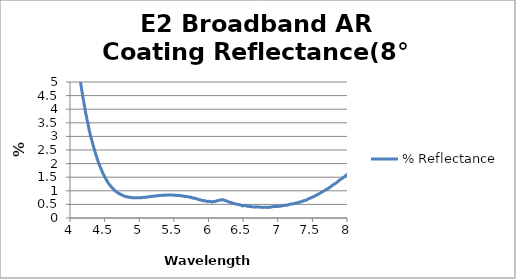
| Category | % Reflectance |
|---|---|
| 0.35 | 2.412 |
| 0.351 | 2.245 |
| 0.352 | 2.558 |
| 0.353 | 4.021 |
| 0.354 | 4.678 |
| 0.355 | 6.227 |
| 0.356 | 7.315 |
| 0.357 | 9.364 |
| 0.358 | 10.662 |
| 0.359 | 12.506 |
| 0.36 | 14.873 |
| 0.361 | 16.148 |
| 0.362 | 16.961 |
| 0.363 | 18.189 |
| 0.364 | 19.214 |
| 0.365 | 19.421 |
| 0.366 | 19.78 |
| 0.367 | 19.995 |
| 0.368 | 19.256 |
| 0.369 | 18.749 |
| 0.37 | 19.007 |
| 0.371 | 17.624 |
| 0.372 | 16.95 |
| 0.373 | 15.239 |
| 0.374 | 14.467 |
| 0.375 | 13.05 |
| 0.376 | 11.771 |
| 0.377 | 10.412 |
| 0.378 | 9.073 |
| 0.379 | 7.457 |
| 0.38 | 6.481 |
| 0.381 | 5.053 |
| 0.382 | 3.864 |
| 0.383 | 2.735 |
| 0.384 | 2.154 |
| 0.385 | 1.462 |
| 0.386 | 1.026 |
| 0.387 | 0.855 |
| 0.388 | 0.882 |
| 0.389 | 1.057 |
| 0.39 | 1.491 |
| 0.391 | 2.039 |
| 0.392 | 2.787 |
| 0.393 | 3.922 |
| 0.394 | 5.25 |
| 0.395 | 6.485 |
| 0.396 | 8.08 |
| 0.397 | 9.695 |
| 0.398 | 11.815 |
| 0.399 | 13.601 |
| 0.4 | 15.647 |
| 0.401 | 18.113 |
| 0.402 | 20.134 |
| 0.403 | 22.518 |
| 0.404 | 24.431 |
| 0.405 | 26.605 |
| 0.406 | 28.521 |
| 0.407 | 30.292 |
| 0.408 | 32.131 |
| 0.409 | 33.46 |
| 0.41 | 34.583 |
| 0.411 | 35.677 |
| 0.412 | 36.618 |
| 0.413 | 37.274 |
| 0.414 | 37.671 |
| 0.415 | 37.719 |
| 0.416 | 37.465 |
| 0.417 | 37.267 |
| 0.418 | 36.661 |
| 0.419 | 35.843 |
| 0.42 | 34.904 |
| 0.421 | 33.518 |
| 0.422 | 32.197 |
| 0.423 | 30.393 |
| 0.424 | 28.611 |
| 0.425 | 26.397 |
| 0.426 | 24.291 |
| 0.427 | 21.887 |
| 0.428 | 19.475 |
| 0.429 | 16.973 |
| 0.43 | 14.462 |
| 0.431 | 12.131 |
| 0.432 | 9.913 |
| 0.433 | 7.716 |
| 0.434 | 5.843 |
| 0.435 | 4.175 |
| 0.436 | 2.874 |
| 0.437 | 1.838 |
| 0.438 | 1.213 |
| 0.439 | 0.879 |
| 0.44 | 0.934 |
| 0.441 | 1.283 |
| 0.442 | 1.843 |
| 0.443 | 2.697 |
| 0.444 | 3.718 |
| 0.445 | 4.801 |
| 0.446 | 6.225 |
| 0.447 | 7.478 |
| 0.448 | 8.958 |
| 0.449 | 10.434 |
| 0.45 | 11.894 |
| 0.451 | 13.3 |
| 0.452 | 14.772 |
| 0.453 | 16.174 |
| 0.454 | 17.43 |
| 0.455 | 18.63 |
| 0.456 | 19.68 |
| 0.457 | 20.547 |
| 0.458 | 21.121 |
| 0.459 | 21.382 |
| 0.46 | 21.308 |
| 0.461 | 20.877 |
| 0.462 | 20.027 |
| 0.463 | 18.829 |
| 0.464 | 17.243 |
| 0.465 | 15.412 |
| 0.466 | 13.439 |
| 0.467 | 11.437 |
| 0.468 | 9.468 |
| 0.469 | 7.587 |
| 0.47 | 5.943 |
| 0.471 | 4.685 |
| 0.472 | 3.882 |
| 0.473 | 3.399 |
| 0.474 | 3.395 |
| 0.475 | 3.823 |
| 0.476 | 4.559 |
| 0.477 | 5.672 |
| 0.478 | 6.997 |
| 0.479 | 8.465 |
| 0.48 | 10.069 |
| 0.481 | 11.747 |
| 0.482 | 13.282 |
| 0.483 | 14.89 |
| 0.484 | 16.334 |
| 0.485 | 17.68 |
| 0.486 | 18.871 |
| 0.487 | 19.859 |
| 0.488 | 20.679 |
| 0.489 | 21.348 |
| 0.49 | 21.854 |
| 0.491 | 22.23 |
| 0.492 | 22.388 |
| 0.493 | 22.394 |
| 0.494 | 22.352 |
| 0.495 | 22.103 |
| 0.496 | 21.811 |
| 0.497 | 21.335 |
| 0.498 | 20.878 |
| 0.499 | 20.324 |
| 0.5 | 19.678 |
| 0.501 | 19.143 |
| 0.502 | 18.536 |
| 0.503 | 17.96 |
| 0.504 | 17.423 |
| 0.505 | 17.04 |
| 0.506 | 16.705 |
| 0.507 | 16.495 |
| 0.508 | 16.448 |
| 0.509 | 16.568 |
| 0.51 | 16.836 |
| 0.511 | 17.281 |
| 0.512 | 17.883 |
| 0.513 | 18.679 |
| 0.514 | 19.573 |
| 0.515 | 20.652 |
| 0.516 | 21.775 |
| 0.517 | 23.022 |
| 0.518 | 24.299 |
| 0.519 | 25.586 |
| 0.52 | 26.9 |
| 0.521 | 28.261 |
| 0.522 | 29.535 |
| 0.523 | 30.79 |
| 0.524 | 31.961 |
| 0.525 | 33.085 |
| 0.526 | 34.096 |
| 0.527 | 35.038 |
| 0.528 | 35.931 |
| 0.529 | 36.639 |
| 0.53 | 37.323 |
| 0.531 | 37.898 |
| 0.532 | 38.395 |
| 0.533 | 38.766 |
| 0.534 | 39.062 |
| 0.535 | 39.214 |
| 0.536 | 39.355 |
| 0.537 | 39.377 |
| 0.538 | 39.28 |
| 0.539 | 39.143 |
| 0.54 | 38.931 |
| 0.541 | 38.624 |
| 0.542 | 38.274 |
| 0.543 | 37.862 |
| 0.544 | 37.34 |
| 0.545 | 36.804 |
| 0.546 | 36.214 |
| 0.547 | 35.546 |
| 0.548 | 34.874 |
| 0.549 | 34.117 |
| 0.55 | 33.371 |
| 0.551 | 32.586 |
| 0.552 | 31.778 |
| 0.553 | 30.951 |
| 0.554 | 30.124 |
| 0.555 | 29.251 |
| 0.556 | 28.422 |
| 0.557 | 27.606 |
| 0.558 | 26.728 |
| 0.559 | 25.862 |
| 0.56 | 25.053 |
| 0.561 | 24.214 |
| 0.562 | 23.408 |
| 0.563 | 22.585 |
| 0.564 | 21.82 |
| 0.565 | 21.017 |
| 0.566 | 20.249 |
| 0.567 | 19.475 |
| 0.568 | 18.729 |
| 0.569 | 17.998 |
| 0.57 | 17.209 |
| 0.571 | 16.464 |
| 0.572 | 15.716 |
| 0.573 | 14.972 |
| 0.574 | 14.206 |
| 0.575 | 13.431 |
| 0.576 | 12.661 |
| 0.577 | 11.923 |
| 0.578 | 11.157 |
| 0.579 | 10.347 |
| 0.58 | 9.568 |
| 0.581 | 8.777 |
| 0.582 | 8.001 |
| 0.583 | 7.254 |
| 0.584 | 6.49 |
| 0.585 | 5.753 |
| 0.586 | 5.045 |
| 0.587 | 4.362 |
| 0.588 | 3.717 |
| 0.589 | 3.148 |
| 0.59 | 2.587 |
| 0.591 | 2.151 |
| 0.592 | 1.768 |
| 0.593 | 1.428 |
| 0.594 | 1.245 |
| 0.595 | 1.128 |
| 0.596 | 1.107 |
| 0.597 | 1.237 |
| 0.598 | 1.44 |
| 0.599 | 1.771 |
| 0.6 | 2.231 |
| 0.601 | 2.772 |
| 0.602 | 3.455 |
| 0.603 | 4.242 |
| 0.604 | 5.145 |
| 0.605 | 6.125 |
| 0.606 | 7.214 |
| 0.607 | 8.34 |
| 0.608 | 9.496 |
| 0.609 | 10.771 |
| 0.61 | 12.133 |
| 0.611 | 13.47 |
| 0.612 | 14.857 |
| 0.613 | 16.255 |
| 0.614 | 17.687 |
| 0.615 | 19.042 |
| 0.616 | 20.399 |
| 0.617 | 21.772 |
| 0.618 | 23.089 |
| 0.619 | 24.397 |
| 0.62 | 25.612 |
| 0.621 | 26.841 |
| 0.622 | 28.005 |
| 0.623 | 29.105 |
| 0.624 | 30.172 |
| 0.625 | 31.162 |
| 0.626 | 32.1 |
| 0.627 | 32.981 |
| 0.628 | 33.802 |
| 0.629 | 34.571 |
| 0.63 | 35.276 |
| 0.631 | 35.864 |
| 0.632 | 36.473 |
| 0.633 | 36.988 |
| 0.634 | 37.431 |
| 0.635 | 37.796 |
| 0.636 | 38.156 |
| 0.637 | 38.385 |
| 0.638 | 38.651 |
| 0.639 | 38.79 |
| 0.64 | 38.891 |
| 0.641 | 38.947 |
| 0.642 | 38.906 |
| 0.643 | 38.837 |
| 0.644 | 38.681 |
| 0.645 | 38.49 |
| 0.646 | 38.279 |
| 0.647 | 37.976 |
| 0.648 | 37.579 |
| 0.649 | 37.194 |
| 0.65 | 36.712 |
| 0.651 | 36.201 |
| 0.652 | 35.628 |
| 0.653 | 35.023 |
| 0.654 | 34.282 |
| 0.655 | 33.59 |
| 0.656 | 32.758 |
| 0.657 | 31.935 |
| 0.658 | 31.02 |
| 0.659 | 30.089 |
| 0.66 | 29.104 |
| 0.661 | 28.083 |
| 0.662 | 27.04 |
| 0.663 | 25.92 |
| 0.664 | 24.808 |
| 0.665 | 23.61 |
| 0.666 | 22.423 |
| 0.667 | 21.227 |
| 0.668 | 19.973 |
| 0.669 | 18.743 |
| 0.67 | 17.502 |
| 0.671 | 16.282 |
| 0.672 | 15.047 |
| 0.673 | 13.79 |
| 0.674 | 12.658 |
| 0.675 | 11.519 |
| 0.676 | 10.381 |
| 0.677 | 9.349 |
| 0.678 | 8.272 |
| 0.679 | 7.305 |
| 0.68 | 6.435 |
| 0.681 | 5.642 |
| 0.682 | 4.873 |
| 0.683 | 4.22 |
| 0.684 | 3.652 |
| 0.685 | 3.191 |
| 0.686 | 2.821 |
| 0.687 | 2.528 |
| 0.688 | 2.331 |
| 0.689 | 2.205 |
| 0.69 | 2.177 |
| 0.691 | 2.245 |
| 0.692 | 2.346 |
| 0.693 | 2.572 |
| 0.694 | 2.816 |
| 0.695 | 3.155 |
| 0.696 | 3.622 |
| 0.697 | 4.057 |
| 0.698 | 4.539 |
| 0.699 | 5.069 |
| 0.7 | 5.675 |
| 0.701 | 6.248 |
| 0.702 | 6.89 |
| 0.703 | 7.481 |
| 0.704 | 8.095 |
| 0.705 | 8.758 |
| 0.706 | 9.352 |
| 0.707 | 9.967 |
| 0.708 | 10.568 |
| 0.709 | 11.139 |
| 0.71 | 11.719 |
| 0.711 | 12.28 |
| 0.712 | 12.79 |
| 0.713 | 13.287 |
| 0.714 | 13.727 |
| 0.715 | 14.083 |
| 0.716 | 14.473 |
| 0.717 | 14.849 |
| 0.718 | 15.103 |
| 0.719 | 15.397 |
| 0.72 | 15.548 |
| 0.721 | 15.729 |
| 0.722 | 15.876 |
| 0.723 | 15.966 |
| 0.724 | 16.027 |
| 0.725 | 16.044 |
| 0.726 | 16.015 |
| 0.727 | 15.941 |
| 0.728 | 15.825 |
| 0.729 | 15.653 |
| 0.73 | 15.468 |
| 0.731 | 15.229 |
| 0.732 | 14.933 |
| 0.733 | 14.622 |
| 0.734 | 14.259 |
| 0.735 | 13.843 |
| 0.736 | 13.422 |
| 0.737 | 12.96 |
| 0.738 | 12.463 |
| 0.739 | 11.93 |
| 0.74 | 11.4 |
| 0.741 | 10.803 |
| 0.742 | 10.2 |
| 0.743 | 9.6 |
| 0.744 | 8.972 |
| 0.745 | 8.312 |
| 0.746 | 7.692 |
| 0.747 | 7.033 |
| 0.748 | 6.371 |
| 0.749 | 5.746 |
| 0.75 | 5.127 |
| 0.751 | 4.523 |
| 0.752 | 3.947 |
| 0.753 | 3.413 |
| 0.754 | 2.884 |
| 0.755 | 2.418 |
| 0.756 | 2.025 |
| 0.757 | 1.661 |
| 0.758 | 1.372 |
| 0.759 | 1.133 |
| 0.76 | 0.975 |
| 0.761 | 0.898 |
| 0.762 | 0.897 |
| 0.763 | 0.984 |
| 0.764 | 1.169 |
| 0.765 | 1.424 |
| 0.766 | 1.792 |
| 0.767 | 2.249 |
| 0.768 | 2.782 |
| 0.769 | 3.41 |
| 0.77 | 4.151 |
| 0.771 | 4.965 |
| 0.772 | 5.843 |
| 0.773 | 6.849 |
| 0.774 | 7.888 |
| 0.775 | 8.993 |
| 0.776 | 10.19 |
| 0.777 | 11.419 |
| 0.778 | 12.683 |
| 0.779 | 14.059 |
| 0.78 | 15.473 |
| 0.781 | 16.819 |
| 0.782 | 18.265 |
| 0.783 | 19.756 |
| 0.784 | 21.153 |
| 0.785 | 22.672 |
| 0.786 | 24.187 |
| 0.787 | 25.631 |
| 0.788 | 27.084 |
| 0.789 | 28.583 |
| 0.79 | 29.995 |
| 0.791 | 31.406 |
| 0.792 | 32.863 |
| 0.793 | 34.222 |
| 0.794 | 35.541 |
| 0.795 | 36.899 |
| 0.796 | 38.183 |
| 0.797 | 39.44 |
| 0.798 | 40.667 |
| 0.799 | 41.875 |
| 0.8 | 43.074 |
| 0.801 | 44.212 |
| 0.802 | 45.318 |
| 0.803 | 46.327 |
| 0.804 | 47.361 |
| 0.805 | 48.372 |
| 0.806 | 49.312 |
| 0.807 | 50.224 |
| 0.808 | 51.109 |
| 0.809 | 51.955 |
| 0.81 | 52.758 |
| 0.811 | 53.606 |
| 0.812 | 54.341 |
| 0.813 | 55.053 |
| 0.814 | 55.762 |
| 0.815 | 56.433 |
| 0.816 | 57.072 |
| 0.817 | 57.674 |
| 0.818 | 58.279 |
| 0.819 | 58.828 |
| 0.82 | 59.36 |
| 0.821 | 59.879 |
| 0.822 | 60.334 |
| 0.823 | 60.828 |
| 0.824 | 61.276 |
| 0.825 | 61.68 |
| 0.826 | 62.077 |
| 0.827 | 62.45 |
| 0.828 | 62.809 |
| 0.829 | 63.143 |
| 0.83 | 63.48 |
| 0.831 | 63.775 |
| 0.832 | 64.059 |
| 0.833 | 64.313 |
| 0.834 | 64.558 |
| 0.835 | 64.792 |
| 0.836 | 65.013 |
| 0.837 | 65.186 |
| 0.838 | 65.393 |
| 0.839 | 65.536 |
| 0.84 | 65.697 |
| 0.841 | 65.848 |
| 0.842 | 65.949 |
| 0.843 | 66.061 |
| 0.844 | 66.162 |
| 0.845 | 66.24 |
| 0.846 | 66.315 |
| 0.847 | 66.344 |
| 0.848 | 66.401 |
| 0.849 | 66.421 |
| 0.85 | 66.431 |
| 0.851 | 66.438 |
| 0.852 | 66.412 |
| 0.853 | 66.399 |
| 0.854 | 66.359 |
| 0.855 | 66.312 |
| 0.856 | 66.263 |
| 0.857 | 66.161 |
| 0.858 | 66.094 |
| 0.859 | 65.986 |
| 0.86 | 65.882 |
| 0.861 | 65.773 |
| 0.862 | 65.605 |
| 0.863 | 65.472 |
| 0.864 | 65.323 |
| 0.865 | 65.146 |
| 0.866 | 64.962 |
| 0.867 | 64.767 |
| 0.868 | 64.544 |
| 0.869 | 64.35 |
| 0.87 | 64.099 |
| 0.871 | 63.876 |
| 0.872 | 63.627 |
| 0.873 | 63.343 |
| 0.874 | 63.061 |
| 0.875 | 62.762 |
| 0.876 | 62.464 |
| 0.877 | 62.15 |
| 0.878 | 61.807 |
| 0.879 | 61.472 |
| 0.88 | 61.107 |
| 0.881 | 60.74 |
| 0.882 | 60.379 |
| 0.883 | 59.98 |
| 0.884 | 59.56 |
| 0.885 | 59.178 |
| 0.886 | 58.742 |
| 0.887 | 58.278 |
| 0.888 | 57.828 |
| 0.889 | 57.377 |
| 0.89 | 56.901 |
| 0.891 | 56.418 |
| 0.892 | 55.926 |
| 0.893 | 55.413 |
| 0.894 | 54.903 |
| 0.895 | 54.386 |
| 0.896 | 53.847 |
| 0.897 | 53.289 |
| 0.898 | 52.747 |
| 0.899 | 52.165 |
| 0.9 | 51.587 |
| 0.901 | 51.023 |
| 0.902 | 50.437 |
| 0.903 | 49.838 |
| 0.904 | 49.268 |
| 0.905 | 48.669 |
| 0.906 | 48.041 |
| 0.907 | 47.459 |
| 0.908 | 46.847 |
| 0.909 | 46.241 |
| 0.91 | 45.661 |
| 0.911 | 45.061 |
| 0.912 | 44.446 |
| 0.913 | 43.863 |
| 0.914 | 43.26 |
| 0.915 | 42.684 |
| 0.916 | 42.11 |
| 0.917 | 41.563 |
| 0.918 | 40.989 |
| 0.919 | 40.446 |
| 0.92 | 39.936 |
| 0.921 | 39.405 |
| 0.922 | 38.898 |
| 0.923 | 38.429 |
| 0.924 | 37.961 |
| 0.925 | 37.506 |
| 0.926 | 37.075 |
| 0.927 | 36.681 |
| 0.928 | 36.295 |
| 0.929 | 35.954 |
| 0.93 | 35.61 |
| 0.931 | 35.291 |
| 0.932 | 35.014 |
| 0.933 | 34.745 |
| 0.934 | 34.524 |
| 0.935 | 34.323 |
| 0.936 | 34.143 |
| 0.937 | 33.996 |
| 0.938 | 33.872 |
| 0.939 | 33.785 |
| 0.94 | 33.714 |
| 0.941 | 33.672 |
| 0.942 | 33.666 |
| 0.943 | 33.68 |
| 0.944 | 33.717 |
| 0.945 | 33.785 |
| 0.946 | 33.874 |
| 0.947 | 33.999 |
| 0.948 | 34.127 |
| 0.949 | 34.29 |
| 0.95 | 34.479 |
| 0.951 | 34.681 |
| 0.952 | 34.899 |
| 0.953 | 35.143 |
| 0.954 | 35.405 |
| 0.955 | 35.669 |
| 0.956 | 35.963 |
| 0.957 | 36.269 |
| 0.958 | 36.587 |
| 0.959 | 36.911 |
| 0.96 | 37.253 |
| 0.961 | 37.599 |
| 0.962 | 37.953 |
| 0.963 | 38.327 |
| 0.964 | 38.691 |
| 0.965 | 39.07 |
| 0.966 | 39.461 |
| 0.967 | 39.833 |
| 0.968 | 40.228 |
| 0.969 | 40.619 |
| 0.97 | 41.012 |
| 0.971 | 41.408 |
| 0.972 | 41.795 |
| 0.973 | 42.18 |
| 0.974 | 42.566 |
| 0.975 | 42.962 |
| 0.976 | 43.348 |
| 0.977 | 43.711 |
| 0.978 | 44.096 |
| 0.979 | 44.468 |
| 0.98 | 44.822 |
| 0.981 | 45.201 |
| 0.982 | 45.559 |
| 0.983 | 45.906 |
| 0.984 | 46.238 |
| 0.985 | 46.597 |
| 0.986 | 46.915 |
| 0.987 | 47.248 |
| 0.988 | 47.568 |
| 0.989 | 47.873 |
| 0.99 | 48.162 |
| 0.991 | 48.475 |
| 0.992 | 48.756 |
| 0.993 | 49.02 |
| 0.994 | 49.298 |
| 0.995 | 49.561 |
| 0.996 | 49.805 |
| 0.997 | 50.053 |
| 0.998 | 50.291 |
| 0.999 | 50.511 |
| 1.0 | 50.742 |
| 1.001 | 50.946 |
| 1.002 | 51.16 |
| 1.003 | 51.337 |
| 1.004 | 51.533 |
| 1.005 | 51.699 |
| 1.006 | 51.883 |
| 1.007 | 52.036 |
| 1.008 | 52.194 |
| 1.009 | 52.313 |
| 1.01 | 52.471 |
| 1.011 | 52.59 |
| 1.012 | 52.707 |
| 1.013 | 52.816 |
| 1.014 | 52.919 |
| 1.015 | 53.002 |
| 1.016 | 53.093 |
| 1.017 | 53.172 |
| 1.018 | 53.232 |
| 1.019 | 53.295 |
| 1.02 | 53.34 |
| 1.021 | 53.388 |
| 1.022 | 53.423 |
| 1.023 | 53.447 |
| 1.024 | 53.46 |
| 1.025 | 53.481 |
| 1.026 | 53.473 |
| 1.027 | 53.488 |
| 1.028 | 53.447 |
| 1.029 | 53.435 |
| 1.03 | 53.4 |
| 1.031 | 53.367 |
| 1.032 | 53.304 |
| 1.033 | 53.272 |
| 1.034 | 53.204 |
| 1.035 | 53.137 |
| 1.036 | 53.054 |
| 1.037 | 52.98 |
| 1.038 | 52.89 |
| 1.039 | 52.773 |
| 1.04 | 52.669 |
| 1.041 | 52.563 |
| 1.042 | 52.426 |
| 1.043 | 52.316 |
| 1.044 | 52.162 |
| 1.045 | 52.011 |
| 1.046 | 51.86 |
| 1.047 | 51.689 |
| 1.048 | 51.501 |
| 1.049 | 51.343 |
| 1.05 | 50.819 |
| 1.051 | 50.623 |
| 1.052 | 50.432 |
| 1.053 | 50.209 |
| 1.054 | 49.999 |
| 1.055 | 49.787 |
| 1.056 | 49.548 |
| 1.057 | 49.305 |
| 1.058 | 49.038 |
| 1.059 | 48.806 |
| 1.06 | 48.546 |
| 1.061 | 48.248 |
| 1.062 | 47.987 |
| 1.063 | 47.691 |
| 1.064 | 47.393 |
| 1.065 | 47.098 |
| 1.066 | 46.789 |
| 1.067 | 46.457 |
| 1.068 | 46.145 |
| 1.069 | 45.8 |
| 1.07 | 45.47 |
| 1.071 | 45.114 |
| 1.072 | 44.752 |
| 1.073 | 44.367 |
| 1.074 | 44.018 |
| 1.075 | 43.628 |
| 1.076 | 43.239 |
| 1.077 | 42.829 |
| 1.078 | 42.442 |
| 1.079 | 42.023 |
| 1.08 | 41.612 |
| 1.081 | 41.198 |
| 1.082 | 40.758 |
| 1.083 | 40.298 |
| 1.084 | 39.864 |
| 1.085 | 39.426 |
| 1.086 | 38.962 |
| 1.087 | 38.49 |
| 1.088 | 38.032 |
| 1.089 | 37.541 |
| 1.09 | 37.074 |
| 1.091 | 36.586 |
| 1.092 | 36.086 |
| 1.093 | 35.591 |
| 1.094 | 35.097 |
| 1.095 | 34.57 |
| 1.096 | 34.056 |
| 1.097 | 33.551 |
| 1.098 | 33.038 |
| 1.099 | 32.483 |
| 1.1 | 31.998 |
| 1.101 | 31.43 |
| 1.102 | 30.909 |
| 1.103 | 30.363 |
| 1.104 | 29.828 |
| 1.105 | 29.279 |
| 1.106 | 28.753 |
| 1.107 | 28.215 |
| 1.108 | 27.641 |
| 1.109 | 27.106 |
| 1.11 | 26.573 |
| 1.111 | 26.018 |
| 1.112 | 25.477 |
| 1.113 | 24.942 |
| 1.114 | 24.398 |
| 1.115 | 23.853 |
| 1.116 | 23.337 |
| 1.117 | 22.799 |
| 1.118 | 22.262 |
| 1.119 | 21.766 |
| 1.12 | 21.224 |
| 1.121 | 20.697 |
| 1.122 | 20.204 |
| 1.123 | 19.706 |
| 1.124 | 19.2 |
| 1.125 | 18.713 |
| 1.126 | 18.24 |
| 1.127 | 17.744 |
| 1.128 | 17.299 |
| 1.129 | 16.843 |
| 1.13 | 16.389 |
| 1.131 | 15.969 |
| 1.132 | 15.546 |
| 1.133 | 15.114 |
| 1.134 | 14.711 |
| 1.135 | 14.324 |
| 1.136 | 13.947 |
| 1.137 | 13.56 |
| 1.138 | 13.221 |
| 1.139 | 12.875 |
| 1.14 | 12.539 |
| 1.141 | 12.233 |
| 1.142 | 11.929 |
| 1.143 | 11.638 |
| 1.144 | 11.369 |
| 1.145 | 11.108 |
| 1.146 | 10.859 |
| 1.147 | 10.638 |
| 1.148 | 10.425 |
| 1.149 | 10.219 |
| 1.15 | 10.039 |
| 1.151 | 9.879 |
| 1.152 | 9.722 |
| 1.153 | 9.582 |
| 1.154 | 9.469 |
| 1.155 | 9.361 |
| 1.156 | 9.27 |
| 1.157 | 9.205 |
| 1.158 | 9.135 |
| 1.159 | 9.089 |
| 1.16 | 9.065 |
| 1.161 | 9.059 |
| 1.162 | 9.046 |
| 1.163 | 9.06 |
| 1.164 | 9.092 |
| 1.165 | 9.133 |
| 1.166 | 9.181 |
| 1.167 | 9.25 |
| 1.168 | 9.327 |
| 1.169 | 9.42 |
| 1.17 | 9.528 |
| 1.171 | 9.647 |
| 1.172 | 9.771 |
| 1.173 | 9.906 |
| 1.174 | 10.058 |
| 1.175 | 10.216 |
| 1.176 | 10.376 |
| 1.177 | 10.56 |
| 1.178 | 10.755 |
| 1.179 | 10.94 |
| 1.18 | 11.144 |
| 1.181 | 11.354 |
| 1.182 | 11.571 |
| 1.183 | 11.809 |
| 1.184 | 12.036 |
| 1.185 | 12.263 |
| 1.186 | 12.511 |
| 1.187 | 12.772 |
| 1.188 | 13.015 |
| 1.189 | 13.267 |
| 1.19 | 13.54 |
| 1.191 | 13.805 |
| 1.192 | 14.072 |
| 1.193 | 14.343 |
| 1.194 | 14.62 |
| 1.195 | 14.886 |
| 1.196 | 15.174 |
| 1.197 | 15.465 |
| 1.198 | 15.735 |
| 1.199 | 16.007 |
| 1.2 | 16.302 |
| 1.201 | 16.582 |
| 1.202 | 16.861 |
| 1.203 | 17.145 |
| 1.204 | 17.435 |
| 1.205 | 17.732 |
| 1.206 | 18.008 |
| 1.207 | 18.275 |
| 1.208 | 18.562 |
| 1.209 | 18.844 |
| 1.21 | 19.119 |
| 1.211 | 19.391 |
| 1.212 | 19.666 |
| 1.213 | 19.939 |
| 1.214 | 20.2 |
| 1.215 | 20.471 |
| 1.216 | 20.725 |
| 1.217 | 20.985 |
| 1.218 | 21.25 |
| 1.219 | 21.493 |
| 1.22 | 21.759 |
| 1.221 | 21.986 |
| 1.222 | 22.231 |
| 1.223 | 22.478 |
| 1.224 | 22.709 |
| 1.225 | 22.939 |
| 1.226 | 23.157 |
| 1.227 | 23.381 |
| 1.228 | 23.608 |
| 1.229 | 23.835 |
| 1.23 | 24.031 |
| 1.231 | 24.23 |
| 1.232 | 24.434 |
| 1.233 | 24.637 |
| 1.234 | 24.837 |
| 1.235 | 25.013 |
| 1.236 | 25.198 |
| 1.237 | 25.357 |
| 1.238 | 25.54 |
| 1.239 | 25.72 |
| 1.24 | 25.871 |
| 1.241 | 26.025 |
| 1.242 | 26.176 |
| 1.243 | 26.324 |
| 1.244 | 26.47 |
| 1.245 | 26.6 |
| 1.246 | 26.736 |
| 1.247 | 26.866 |
| 1.248 | 26.956 |
| 1.249 | 27.103 |
| 1.25 | 27.251 |
| 1.251 | 27.327 |
| 1.252 | 27.419 |
| 1.253 | 27.518 |
| 1.254 | 27.61 |
| 1.255 | 27.698 |
| 1.256 | 27.779 |
| 1.257 | 27.847 |
| 1.258 | 27.906 |
| 1.259 | 27.991 |
| 1.26 | 28.042 |
| 1.261 | 28.088 |
| 1.262 | 28.147 |
| 1.263 | 28.202 |
| 1.264 | 28.226 |
| 1.265 | 28.274 |
| 1.266 | 28.282 |
| 1.267 | 28.311 |
| 1.268 | 28.328 |
| 1.269 | 28.341 |
| 1.27 | 28.352 |
| 1.271 | 28.355 |
| 1.272 | 28.352 |
| 1.273 | 28.333 |
| 1.274 | 28.328 |
| 1.275 | 28.316 |
| 1.276 | 28.29 |
| 1.277 | 28.267 |
| 1.278 | 28.227 |
| 1.279 | 28.185 |
| 1.28 | 28.14 |
| 1.281 | 28.099 |
| 1.282 | 28.048 |
| 1.283 | 27.997 |
| 1.284 | 27.928 |
| 1.285 | 27.864 |
| 1.286 | 27.794 |
| 1.287 | 27.711 |
| 1.288 | 27.624 |
| 1.289 | 27.533 |
| 1.29 | 27.446 |
| 1.291 | 27.351 |
| 1.292 | 27.25 |
| 1.293 | 27.15 |
| 1.294 | 27.034 |
| 1.295 | 26.914 |
| 1.296 | 26.803 |
| 1.297 | 26.677 |
| 1.298 | 26.549 |
| 1.299 | 26.411 |
| 1.3 | 26.276 |
| 1.301 | 26.131 |
| 1.302 | 25.99 |
| 1.303 | 25.824 |
| 1.304 | 25.675 |
| 1.305 | 25.519 |
| 1.306 | 25.356 |
| 1.307 | 25.174 |
| 1.308 | 25.014 |
| 1.309 | 24.826 |
| 1.31 | 24.648 |
| 1.311 | 24.466 |
| 1.312 | 24.279 |
| 1.313 | 24.074 |
| 1.314 | 23.876 |
| 1.315 | 23.684 |
| 1.316 | 23.477 |
| 1.317 | 23.258 |
| 1.318 | 23.055 |
| 1.319 | 22.826 |
| 1.32 | 22.597 |
| 1.321 | 22.388 |
| 1.322 | 22.153 |
| 1.323 | 21.92 |
| 1.324 | 21.68 |
| 1.325 | 21.446 |
| 1.326 | 21.193 |
| 1.327 | 20.959 |
| 1.328 | 20.708 |
| 1.329 | 20.445 |
| 1.33 | 20.196 |
| 1.331 | 19.939 |
| 1.332 | 19.676 |
| 1.333 | 19.415 |
| 1.334 | 19.15 |
| 1.335 | 18.88 |
| 1.336 | 18.603 |
| 1.337 | 18.337 |
| 1.338 | 18.059 |
| 1.339 | 17.782 |
| 1.34 | 17.512 |
| 1.341 | 17.221 |
| 1.342 | 16.925 |
| 1.343 | 16.647 |
| 1.344 | 16.374 |
| 1.345 | 16.073 |
| 1.346 | 15.791 |
| 1.347 | 15.498 |
| 1.348 | 15.204 |
| 1.349 | 14.911 |
| 1.35 | 14.632 |
| 1.351 | 14.33 |
| 1.352 | 14.05 |
| 1.353 | 13.754 |
| 1.354 | 13.455 |
| 1.355 | 13.157 |
| 1.356 | 12.866 |
| 1.357 | 12.569 |
| 1.358 | 12.273 |
| 1.359 | 11.99 |
| 1.36 | 11.689 |
| 1.361 | 11.394 |
| 1.362 | 11.108 |
| 1.363 | 10.816 |
| 1.364 | 10.515 |
| 1.365 | 10.239 |
| 1.366 | 9.955 |
| 1.367 | 9.67 |
| 1.368 | 9.396 |
| 1.369 | 9.127 |
| 1.37 | 8.849 |
| 1.371 | 8.584 |
| 1.372 | 8.313 |
| 1.373 | 8.05 |
| 1.374 | 7.786 |
| 1.375 | 7.549 |
| 1.376 | 7.299 |
| 1.377 | 7.062 |
| 1.378 | 6.836 |
| 1.379 | 6.589 |
| 1.38 | 6.35 |
| 1.381 | 6.125 |
| 1.382 | 5.888 |
| 1.383 | 5.664 |
| 1.384 | 5.449 |
| 1.385 | 5.241 |
| 1.386 | 5.026 |
| 1.387 | 4.845 |
| 1.388 | 4.668 |
| 1.389 | 4.487 |
| 1.39 | 4.318 |
| 1.391 | 4.149 |
| 1.392 | 3.991 |
| 1.393 | 3.834 |
| 1.394 | 3.694 |
| 1.395 | 3.556 |
| 1.396 | 3.421 |
| 1.397 | 3.302 |
| 1.398 | 3.185 |
| 1.399 | 3.077 |
| 1.4 | 2.984 |
| 1.401 | 2.894 |
| 1.402 | 2.814 |
| 1.403 | 2.745 |
| 1.404 | 2.684 |
| 1.405 | 2.627 |
| 1.406 | 2.583 |
| 1.407 | 2.56 |
| 1.408 | 2.53 |
| 1.409 | 2.506 |
| 1.41 | 2.505 |
| 1.411 | 2.511 |
| 1.412 | 2.523 |
| 1.413 | 2.543 |
| 1.414 | 2.579 |
| 1.415 | 2.622 |
| 1.416 | 2.671 |
| 1.417 | 2.734 |
| 1.418 | 2.808 |
| 1.419 | 2.88 |
| 1.42 | 2.983 |
| 1.421 | 3.086 |
| 1.422 | 3.192 |
| 1.423 | 3.302 |
| 1.424 | 3.447 |
| 1.425 | 3.578 |
| 1.426 | 3.731 |
| 1.427 | 3.884 |
| 1.428 | 4.052 |
| 1.429 | 4.23 |
| 1.43 | 4.421 |
| 1.431 | 4.617 |
| 1.432 | 4.816 |
| 1.433 | 5.03 |
| 1.434 | 5.255 |
| 1.435 | 5.478 |
| 1.436 | 5.72 |
| 1.437 | 5.976 |
| 1.438 | 6.22 |
| 1.439 | 6.487 |
| 1.44 | 6.765 |
| 1.441 | 7.034 |
| 1.442 | 7.318 |
| 1.443 | 7.628 |
| 1.444 | 7.922 |
| 1.445 | 8.222 |
| 1.446 | 8.547 |
| 1.447 | 8.859 |
| 1.448 | 9.188 |
| 1.449 | 9.532 |
| 1.45 | 9.87 |
| 1.451 | 10.21 |
| 1.452 | 10.561 |
| 1.453 | 10.917 |
| 1.454 | 11.273 |
| 1.455 | 11.65 |
| 1.456 | 12.034 |
| 1.457 | 12.393 |
| 1.458 | 12.777 |
| 1.459 | 13.164 |
| 1.46 | 13.541 |
| 1.461 | 13.942 |
| 1.462 | 14.352 |
| 1.463 | 14.743 |
| 1.464 | 15.146 |
| 1.465 | 15.562 |
| 1.466 | 15.955 |
| 1.467 | 16.366 |
| 1.468 | 16.803 |
| 1.469 | 17.203 |
| 1.47 | 17.614 |
| 1.471 | 18.046 |
| 1.472 | 18.467 |
| 1.473 | 18.882 |
| 1.474 | 19.327 |
| 1.475 | 19.755 |
| 1.476 | 20.164 |
| 1.477 | 20.594 |
| 1.478 | 21.036 |
| 1.479 | 21.455 |
| 1.48 | 21.891 |
| 1.481 | 22.335 |
| 1.482 | 22.764 |
| 1.483 | 23.18 |
| 1.484 | 23.634 |
| 1.485 | 24.059 |
| 1.486 | 24.486 |
| 1.487 | 24.924 |
| 1.488 | 25.357 |
| 1.489 | 25.787 |
| 1.49 | 26.227 |
| 1.491 | 26.65 |
| 1.492 | 27.069 |
| 1.493 | 27.51 |
| 1.494 | 27.937 |
| 1.495 | 28.362 |
| 1.496 | 28.775 |
| 1.497 | 29.201 |
| 1.498 | 29.609 |
| 1.499 | 30.036 |
| 1.5 | 30.479 |
| 1.501 | 30.86 |
| 1.502 | 31.274 |
| 1.503 | 31.69 |
| 1.504 | 32.082 |
| 1.505 | 32.509 |
| 1.506 | 32.925 |
| 1.507 | 33.3 |
| 1.508 | 33.7 |
| 1.509 | 34.109 |
| 1.51 | 34.506 |
| 1.511 | 34.897 |
| 1.512 | 35.286 |
| 1.513 | 35.68 |
| 1.514 | 36.058 |
| 1.515 | 36.44 |
| 1.516 | 36.814 |
| 1.517 | 37.188 |
| 1.518 | 37.559 |
| 1.519 | 37.954 |
| 1.52 | 38.307 |
| 1.521 | 38.674 |
| 1.522 | 39.042 |
| 1.523 | 39.386 |
| 1.524 | 39.748 |
| 1.525 | 40.13 |
| 1.526 | 40.456 |
| 1.527 | 40.787 |
| 1.528 | 41.157 |
| 1.529 | 41.498 |
| 1.53 | 41.81 |
| 1.531 | 42.159 |
| 1.532 | 42.514 |
| 1.533 | 42.833 |
| 1.534 | 43.175 |
| 1.535 | 43.443 |
| 1.536 | 43.797 |
| 1.537 | 44.112 |
| 1.538 | 44.458 |
| 1.539 | 44.719 |
| 1.54 | 45.034 |
| 1.541 | 45.378 |
| 1.542 | 45.655 |
| 1.543 | 45.948 |
| 1.544 | 46.232 |
| 1.545 | 46.585 |
| 1.546 | 46.848 |
| 1.547 | 47.126 |
| 1.548 | 47.396 |
| 1.549 | 47.707 |
| 1.55 | 47.98 |
| 1.551 | 48.254 |
| 1.552 | 48.516 |
| 1.553 | 48.8 |
| 1.554 | 49.059 |
| 1.555 | 49.337 |
| 1.556 | 49.586 |
| 1.557 | 49.864 |
| 1.558 | 50.11 |
| 1.559 | 50.352 |
| 1.56 | 50.614 |
| 1.561 | 50.859 |
| 1.562 | 51.108 |
| 1.563 | 51.352 |
| 1.564 | 51.591 |
| 1.565 | 51.838 |
| 1.566 | 52.054 |
| 1.567 | 52.291 |
| 1.568 | 52.527 |
| 1.569 | 52.75 |
| 1.57 | 52.981 |
| 1.571 | 53.224 |
| 1.572 | 53.407 |
| 1.573 | 53.647 |
| 1.574 | 53.882 |
| 1.575 | 54.072 |
| 1.576 | 54.265 |
| 1.577 | 54.498 |
| 1.578 | 54.702 |
| 1.579 | 54.894 |
| 1.58 | 55.109 |
| 1.581 | 55.304 |
| 1.582 | 55.488 |
| 1.583 | 55.692 |
| 1.584 | 55.884 |
| 1.585 | 56.07 |
| 1.586 | 56.245 |
| 1.587 | 56.442 |
| 1.588 | 56.632 |
| 1.589 | 56.807 |
| 1.59 | 56.978 |
| 1.591 | 57.16 |
| 1.592 | 57.344 |
| 1.593 | 57.502 |
| 1.594 | 57.666 |
| 1.595 | 57.844 |
| 1.596 | 58.001 |
| 1.597 | 58.2 |
| 1.598 | 58.339 |
| 1.599 | 58.481 |
| 1.6 | 58.641 |
| 1.601 | 58.854 |
| 1.602 | 58.943 |
| 1.603 | 59.114 |
| 1.604 | 59.273 |
| 1.605 | 59.425 |
| 1.606 | 59.544 |
| 1.607 | 59.726 |
| 1.608 | 59.858 |
| 1.609 | 59.983 |
| 1.61 | 60.133 |
| 1.611 | 60.26 |
| 1.612 | 60.398 |
| 1.613 | 60.519 |
| 1.614 | 60.651 |
| 1.615 | 60.802 |
| 1.616 | 60.918 |
| 1.617 | 61.054 |
| 1.618 | 61.157 |
| 1.619 | 61.276 |
| 1.62 | 61.42 |
| 1.621 | 61.551 |
| 1.622 | 61.642 |
| 1.623 | 61.749 |
| 1.624 | 61.895 |
| 1.625 | 61.999 |
| 1.626 | 62.101 |
| 1.627 | 62.235 |
| 1.628 | 62.31 |
| 1.629 | 62.428 |
| 1.63 | 62.555 |
| 1.631 | 62.638 |
| 1.632 | 62.735 |
| 1.633 | 62.871 |
| 1.634 | 62.943 |
| 1.635 | 63.031 |
| 1.636 | 63.137 |
| 1.637 | 63.229 |
| 1.638 | 63.327 |
| 1.639 | 63.426 |
| 1.64 | 63.516 |
| 1.641 | 63.622 |
| 1.642 | 63.704 |
| 1.643 | 63.766 |
| 1.644 | 63.876 |
| 1.645 | 63.96 |
| 1.646 | 64.022 |
| 1.647 | 64.147 |
| 1.648 | 64.203 |
| 1.649 | 64.266 |
| 1.65 | 64.357 |
| 1.651 | 64.467 |
| 1.652 | 64.493 |
| 1.653 | 64.549 |
| 1.654 | 64.686 |
| 1.655 | 64.729 |
| 1.656 | 64.757 |
| 1.657 | 64.891 |
| 1.658 | 64.936 |
| 1.659 | 64.974 |
| 1.66 | 65.087 |
| 1.661 | 65.147 |
| 1.662 | 65.194 |
| 1.663 | 65.248 |
| 1.664 | 65.329 |
| 1.665 | 65.367 |
| 1.666 | 65.45 |
| 1.667 | 65.486 |
| 1.668 | 65.577 |
| 1.669 | 65.595 |
| 1.67 | 65.669 |
| 1.671 | 65.714 |
| 1.672 | 65.768 |
| 1.673 | 65.834 |
| 1.674 | 65.848 |
| 1.675 | 65.94 |
| 1.676 | 65.968 |
| 1.677 | 65.999 |
| 1.678 | 66.059 |
| 1.679 | 66.12 |
| 1.68 | 66.152 |
| 1.681 | 66.184 |
| 1.682 | 66.244 |
| 1.683 | 66.284 |
| 1.684 | 66.317 |
| 1.685 | 66.354 |
| 1.686 | 66.386 |
| 1.687 | 66.435 |
| 1.688 | 66.471 |
| 1.689 | 66.505 |
| 1.69 | 66.543 |
| 1.691 | 66.562 |
| 1.692 | 66.59 |
| 1.693 | 66.635 |
| 1.694 | 66.673 |
| 1.695 | 66.678 |
| 1.696 | 66.725 |
| 1.697 | 66.777 |
| 1.698 | 66.785 |
| 1.699 | 66.808 |
| 1.7 | 66.837 |
| 1.701 | 66.856 |
| 1.702 | 66.885 |
| 1.703 | 66.908 |
| 1.704 | 66.946 |
| 1.705 | 66.962 |
| 1.706 | 66.991 |
| 1.707 | 66.984 |
| 1.708 | 66.993 |
| 1.709 | 67.032 |
| 1.71 | 67.046 |
| 1.711 | 67.033 |
| 1.712 | 67.09 |
| 1.713 | 67.078 |
| 1.714 | 67.09 |
| 1.715 | 67.106 |
| 1.716 | 67.135 |
| 1.717 | 67.123 |
| 1.718 | 67.135 |
| 1.719 | 67.162 |
| 1.72 | 67.16 |
| 1.721 | 67.161 |
| 1.722 | 67.183 |
| 1.723 | 67.178 |
| 1.724 | 67.179 |
| 1.725 | 67.207 |
| 1.726 | 67.187 |
| 1.727 | 67.208 |
| 1.728 | 67.204 |
| 1.729 | 67.175 |
| 1.73 | 67.204 |
| 1.731 | 67.197 |
| 1.732 | 67.199 |
| 1.733 | 67.206 |
| 1.734 | 67.188 |
| 1.735 | 67.19 |
| 1.736 | 67.199 |
| 1.737 | 67.17 |
| 1.738 | 67.184 |
| 1.739 | 67.175 |
| 1.74 | 67.148 |
| 1.741 | 67.152 |
| 1.742 | 67.133 |
| 1.743 | 67.135 |
| 1.744 | 67.121 |
| 1.745 | 67.122 |
| 1.746 | 67.134 |
| 1.747 | 67.102 |
| 1.748 | 67.086 |
| 1.749 | 67.061 |
| 1.75 | 67.067 |
| 1.751 | 67.043 |
| 1.752 | 67.008 |
| 1.753 | 67.007 |
| 1.754 | 66.985 |
| 1.755 | 66.962 |
| 1.756 | 66.948 |
| 1.757 | 66.953 |
| 1.758 | 66.912 |
| 1.759 | 66.904 |
| 1.76 | 66.877 |
| 1.761 | 66.847 |
| 1.762 | 66.827 |
| 1.763 | 66.803 |
| 1.764 | 66.739 |
| 1.765 | 66.774 |
| 1.766 | 66.721 |
| 1.767 | 66.685 |
| 1.768 | 66.65 |
| 1.769 | 66.634 |
| 1.77 | 66.629 |
| 1.771 | 66.576 |
| 1.772 | 66.562 |
| 1.773 | 66.529 |
| 1.774 | 66.49 |
| 1.775 | 66.468 |
| 1.776 | 66.417 |
| 1.777 | 66.417 |
| 1.778 | 66.351 |
| 1.779 | 66.312 |
| 1.78 | 66.298 |
| 1.781 | 66.247 |
| 1.782 | 66.203 |
| 1.783 | 66.18 |
| 1.784 | 66.163 |
| 1.785 | 66.089 |
| 1.786 | 66.078 |
| 1.787 | 66.03 |
| 1.788 | 65.978 |
| 1.789 | 65.963 |
| 1.79 | 65.903 |
| 1.791 | 65.87 |
| 1.792 | 65.818 |
| 1.793 | 65.781 |
| 1.794 | 65.724 |
| 1.795 | 65.681 |
| 1.796 | 65.634 |
| 1.797 | 65.585 |
| 1.798 | 65.53 |
| 1.799 | 65.487 |
| 1.8 | 65.438 |
| 1.801 | 65.402 |
| 1.802 | 65.348 |
| 1.803 | 65.296 |
| 1.804 | 65.245 |
| 1.805 | 65.183 |
| 1.806 | 65.123 |
| 1.807 | 65.086 |
| 1.808 | 65.003 |
| 1.809 | 64.967 |
| 1.81 | 64.912 |
| 1.811 | 64.842 |
| 1.812 | 64.806 |
| 1.813 | 64.738 |
| 1.814 | 64.687 |
| 1.815 | 64.63 |
| 1.816 | 64.581 |
| 1.817 | 64.508 |
| 1.818 | 64.47 |
| 1.819 | 64.384 |
| 1.82 | 64.359 |
| 1.821 | 64.235 |
| 1.822 | 64.213 |
| 1.823 | 64.118 |
| 1.824 | 64.063 |
| 1.825 | 64.008 |
| 1.826 | 63.942 |
| 1.827 | 63.871 |
| 1.828 | 63.795 |
| 1.829 | 63.749 |
| 1.83 | 63.667 |
| 1.831 | 63.585 |
| 1.832 | 63.572 |
| 1.833 | 63.467 |
| 1.834 | 63.404 |
| 1.835 | 63.28 |
| 1.836 | 63.272 |
| 1.837 | 63.178 |
| 1.838 | 63.03 |
| 1.839 | 63.053 |
| 1.84 | 62.944 |
| 1.841 | 62.854 |
| 1.842 | 62.761 |
| 1.843 | 62.677 |
| 1.844 | 62.623 |
| 1.845 | 62.549 |
| 1.846 | 62.466 |
| 1.847 | 62.392 |
| 1.848 | 62.307 |
| 1.849 | 62.198 |
| 1.85 | 62.171 |
| 1.851 | 62.058 |
| 1.852 | 61.958 |
| 1.853 | 61.872 |
| 1.854 | 61.801 |
| 1.855 | 61.703 |
| 1.856 | 61.621 |
| 1.857 | 61.547 |
| 1.858 | 61.44 |
| 1.859 | 61.349 |
| 1.86 | 61.277 |
| 1.861 | 61.178 |
| 1.862 | 61.071 |
| 1.863 | 60.993 |
| 1.864 | 60.901 |
| 1.865 | 60.833 |
| 1.866 | 60.728 |
| 1.867 | 60.618 |
| 1.868 | 60.54 |
| 1.869 | 60.432 |
| 1.87 | 60.329 |
| 1.871 | 60.239 |
| 1.872 | 60.127 |
| 1.873 | 60.038 |
| 1.874 | 59.926 |
| 1.875 | 59.811 |
| 1.876 | 59.708 |
| 1.877 | 59.623 |
| 1.878 | 59.504 |
| 1.879 | 59.426 |
| 1.88 | 59.31 |
| 1.881 | 59.225 |
| 1.882 | 59.098 |
| 1.883 | 59.001 |
| 1.884 | 58.891 |
| 1.885 | 58.784 |
| 1.886 | 58.692 |
| 1.887 | 58.544 |
| 1.888 | 58.48 |
| 1.889 | 58.343 |
| 1.89 | 58.247 |
| 1.891 | 58.132 |
| 1.892 | 58.024 |
| 1.893 | 57.889 |
| 1.894 | 57.83 |
| 1.895 | 57.661 |
| 1.896 | 57.57 |
| 1.897 | 57.461 |
| 1.898 | 57.34 |
| 1.899 | 57.223 |
| 1.9 | 57.088 |
| 1.901 | 57.004 |
| 1.902 | 56.853 |
| 1.903 | 56.73 |
| 1.904 | 56.612 |
| 1.905 | 56.479 |
| 1.906 | 56.357 |
| 1.907 | 56.232 |
| 1.908 | 56.101 |
| 1.909 | 55.981 |
| 1.91 | 55.895 |
| 1.911 | 55.74 |
| 1.912 | 55.618 |
| 1.913 | 55.482 |
| 1.914 | 55.358 |
| 1.915 | 55.233 |
| 1.916 | 55.091 |
| 1.917 | 54.964 |
| 1.918 | 54.83 |
| 1.919 | 54.699 |
| 1.92 | 54.565 |
| 1.921 | 54.432 |
| 1.922 | 54.301 |
| 1.923 | 54.169 |
| 1.924 | 54.016 |
| 1.925 | 53.884 |
| 1.926 | 53.753 |
| 1.927 | 53.634 |
| 1.928 | 53.492 |
| 1.929 | 53.36 |
| 1.93 | 53.203 |
| 1.931 | 53.102 |
| 1.932 | 52.955 |
| 1.933 | 52.794 |
| 1.934 | 52.666 |
| 1.935 | 52.521 |
| 1.936 | 52.381 |
| 1.937 | 52.232 |
| 1.938 | 52.109 |
| 1.939 | 51.952 |
| 1.94 | 51.802 |
| 1.941 | 51.664 |
| 1.942 | 51.524 |
| 1.943 | 51.366 |
| 1.944 | 51.223 |
| 1.945 | 51.086 |
| 1.946 | 50.931 |
| 1.947 | 50.792 |
| 1.948 | 50.626 |
| 1.949 | 50.477 |
| 1.95 | 50.332 |
| 1.951 | 50.164 |
| 1.952 | 50.021 |
| 1.953 | 49.891 |
| 1.954 | 49.732 |
| 1.955 | 49.572 |
| 1.956 | 49.426 |
| 1.957 | 49.263 |
| 1.958 | 49.107 |
| 1.959 | 48.957 |
| 1.96 | 48.819 |
| 1.961 | 48.632 |
| 1.962 | 48.489 |
| 1.963 | 48.326 |
| 1.964 | 48.173 |
| 1.965 | 48.005 |
| 1.966 | 47.847 |
| 1.967 | 47.684 |
| 1.968 | 47.514 |
| 1.969 | 47.366 |
| 1.97 | 47.213 |
| 1.971 | 47.035 |
| 1.972 | 46.88 |
| 1.973 | 46.724 |
| 1.974 | 46.536 |
| 1.975 | 46.405 |
| 1.976 | 46.222 |
| 1.977 | 46.052 |
| 1.978 | 45.897 |
| 1.979 | 45.724 |
| 1.98 | 45.536 |
| 1.981 | 45.415 |
| 1.982 | 45.231 |
| 1.983 | 45.043 |
| 1.984 | 44.895 |
| 1.985 | 44.725 |
| 1.986 | 44.551 |
| 1.987 | 44.385 |
| 1.988 | 44.209 |
| 1.989 | 44.046 |
| 1.99 | 43.889 |
| 1.991 | 43.688 |
| 1.992 | 43.536 |
| 1.993 | 43.359 |
| 1.994 | 43.201 |
| 1.995 | 43.021 |
| 1.996 | 42.833 |
| 1.997 | 42.671 |
| 1.998 | 42.5 |
| 1.999 | 42.324 |
| 2.0 | 42.138 |
| 2.001 | 41.965 |
| 2.002 | 41.791 |
| 2.003 | 41.608 |
| 2.004 | 41.432 |
| 2.005 | 41.263 |
| 2.006 | 41.076 |
| 2.007 | 40.908 |
| 2.008 | 40.741 |
| 2.009 | 40.527 |
| 2.01 | 40.375 |
| 2.011 | 40.227 |
| 2.012 | 40.025 |
| 2.013 | 39.84 |
| 2.014 | 39.695 |
| 2.015 | 39.492 |
| 2.016 | 39.284 |
| 2.017 | 39.151 |
| 2.018 | 38.962 |
| 2.019 | 38.774 |
| 2.02 | 38.596 |
| 2.021 | 38.412 |
| 2.022 | 38.246 |
| 2.023 | 38.052 |
| 2.024 | 37.887 |
| 2.025 | 37.697 |
| 2.026 | 37.532 |
| 2.027 | 37.348 |
| 2.028 | 37.174 |
| 2.029 | 36.994 |
| 2.03 | 36.814 |
| 2.031 | 36.635 |
| 2.032 | 36.461 |
| 2.033 | 36.284 |
| 2.034 | 36.113 |
| 2.035 | 35.924 |
| 2.036 | 35.737 |
| 2.037 | 35.563 |
| 2.038 | 35.394 |
| 2.039 | 35.207 |
| 2.04 | 35.028 |
| 2.041 | 34.85 |
| 2.042 | 34.681 |
| 2.043 | 34.5 |
| 2.044 | 34.314 |
| 2.045 | 34.141 |
| 2.046 | 33.975 |
| 2.047 | 33.786 |
| 2.048 | 33.625 |
| 2.049 | 33.443 |
| 2.05 | 33.27 |
| 2.051 | 33.092 |
| 2.052 | 32.918 |
| 2.053 | 32.745 |
| 2.054 | 32.571 |
| 2.055 | 32.389 |
| 2.056 | 32.213 |
| 2.057 | 32.056 |
| 2.058 | 31.88 |
| 2.059 | 31.687 |
| 2.06 | 31.546 |
| 2.061 | 31.36 |
| 2.062 | 31.173 |
| 2.063 | 31.03 |
| 2.064 | 30.853 |
| 2.065 | 30.67 |
| 2.066 | 30.506 |
| 2.067 | 30.361 |
| 2.068 | 30.184 |
| 2.069 | 29.998 |
| 2.07 | 29.853 |
| 2.071 | 29.68 |
| 2.072 | 29.504 |
| 2.073 | 29.35 |
| 2.074 | 29.179 |
| 2.075 | 29.015 |
| 2.076 | 28.846 |
| 2.077 | 28.693 |
| 2.078 | 28.535 |
| 2.079 | 28.37 |
| 2.08 | 28.205 |
| 2.081 | 28.056 |
| 2.082 | 27.892 |
| 2.083 | 27.744 |
| 2.084 | 27.575 |
| 2.085 | 27.425 |
| 2.086 | 27.261 |
| 2.087 | 27.117 |
| 2.088 | 26.956 |
| 2.089 | 26.808 |
| 2.09 | 26.655 |
| 2.091 | 26.491 |
| 2.092 | 26.348 |
| 2.093 | 26.19 |
| 2.094 | 26.05 |
| 2.095 | 25.902 |
| 2.096 | 25.761 |
| 2.097 | 25.61 |
| 2.098 | 25.476 |
| 2.099 | 25.321 |
| 2.1 | 25.174 |
| 2.101 | 25.028 |
| 2.102 | 24.891 |
| 2.103 | 24.753 |
| 2.104 | 24.628 |
| 2.105 | 24.487 |
| 2.106 | 24.327 |
| 2.107 | 24.215 |
| 2.108 | 24.076 |
| 2.109 | 23.924 |
| 2.11 | 23.812 |
| 2.111 | 23.678 |
| 2.112 | 23.545 |
| 2.113 | 23.408 |
| 2.114 | 23.277 |
| 2.115 | 23.15 |
| 2.116 | 23.034 |
| 2.117 | 22.911 |
| 2.118 | 22.788 |
| 2.119 | 22.661 |
| 2.12 | 22.54 |
| 2.121 | 22.414 |
| 2.122 | 22.308 |
| 2.123 | 22.197 |
| 2.124 | 22.069 |
| 2.125 | 21.955 |
| 2.126 | 21.843 |
| 2.127 | 21.726 |
| 2.128 | 21.641 |
| 2.129 | 21.515 |
| 2.13 | 21.405 |
| 2.131 | 21.3 |
| 2.132 | 21.193 |
| 2.133 | 21.082 |
| 2.134 | 20.984 |
| 2.135 | 20.878 |
| 2.136 | 20.792 |
| 2.137 | 20.683 |
| 2.138 | 20.594 |
| 2.139 | 20.495 |
| 2.14 | 20.397 |
| 2.141 | 20.311 |
| 2.142 | 20.226 |
| 2.143 | 20.131 |
| 2.144 | 20.045 |
| 2.145 | 19.956 |
| 2.146 | 19.86 |
| 2.147 | 19.789 |
| 2.148 | 19.703 |
| 2.149 | 19.62 |
| 2.15 | 19.535 |
| 2.151 | 19.464 |
| 2.152 | 19.384 |
| 2.153 | 19.302 |
| 2.154 | 19.238 |
| 2.155 | 19.17 |
| 2.156 | 19.086 |
| 2.157 | 19.024 |
| 2.158 | 18.941 |
| 2.159 | 18.886 |
| 2.16 | 18.827 |
| 2.161 | 18.759 |
| 2.162 | 18.691 |
| 2.163 | 18.638 |
| 2.164 | 18.578 |
| 2.165 | 18.516 |
| 2.166 | 18.463 |
| 2.167 | 18.41 |
| 2.168 | 18.356 |
| 2.169 | 18.299 |
| 2.17 | 18.248 |
| 2.171 | 18.22 |
| 2.172 | 18.16 |
| 2.173 | 18.104 |
| 2.174 | 18.066 |
| 2.175 | 18.015 |
| 2.176 | 17.985 |
| 2.177 | 17.936 |
| 2.178 | 17.894 |
| 2.179 | 17.868 |
| 2.18 | 17.824 |
| 2.181 | 17.779 |
| 2.182 | 17.765 |
| 2.183 | 17.732 |
| 2.184 | 17.7 |
| 2.185 | 17.665 |
| 2.186 | 17.634 |
| 2.187 | 17.601 |
| 2.188 | 17.593 |
| 2.189 | 17.571 |
| 2.19 | 17.547 |
| 2.191 | 17.524 |
| 2.192 | 17.504 |
| 2.193 | 17.496 |
| 2.194 | 17.469 |
| 2.195 | 17.455 |
| 2.196 | 17.458 |
| 2.197 | 17.443 |
| 2.198 | 17.419 |
| 2.199 | 17.406 |
| 2.2 | 17.404 |
| 2.201 | 17.403 |
| 2.202 | 17.393 |
| 2.203 | 17.4 |
| 2.204 | 17.38 |
| 2.205 | 17.397 |
| 2.206 | 17.403 |
| 2.207 | 17.394 |
| 2.208 | 17.412 |
| 2.209 | 17.416 |
| 2.21 | 17.41 |
| 2.211 | 17.426 |
| 2.212 | 17.432 |
| 2.213 | 17.444 |
| 2.214 | 17.456 |
| 2.215 | 17.474 |
| 2.216 | 17.472 |
| 2.217 | 17.5 |
| 2.218 | 17.526 |
| 2.219 | 17.542 |
| 2.22 | 17.544 |
| 2.221 | 17.578 |
| 2.222 | 17.598 |
| 2.223 | 17.619 |
| 2.224 | 17.645 |
| 2.225 | 17.691 |
| 2.226 | 17.706 |
| 2.227 | 17.738 |
| 2.228 | 17.761 |
| 2.229 | 17.794 |
| 2.23 | 17.82 |
| 2.231 | 17.856 |
| 2.232 | 17.895 |
| 2.233 | 17.928 |
| 2.234 | 17.95 |
| 2.235 | 17.995 |
| 2.236 | 18.037 |
| 2.237 | 18.075 |
| 2.238 | 18.113 |
| 2.239 | 18.153 |
| 2.24 | 18.193 |
| 2.241 | 18.248 |
| 2.242 | 18.293 |
| 2.243 | 18.331 |
| 2.244 | 18.378 |
| 2.245 | 18.428 |
| 2.246 | 18.47 |
| 2.247 | 18.528 |
| 2.248 | 18.581 |
| 2.249 | 18.629 |
| 2.25 | 18.68 |
| 2.251 | 18.737 |
| 2.252 | 18.781 |
| 2.253 | 18.839 |
| 2.254 | 18.895 |
| 2.255 | 18.954 |
| 2.256 | 19.017 |
| 2.257 | 19.07 |
| 2.258 | 19.134 |
| 2.259 | 19.198 |
| 2.26 | 19.25 |
| 2.261 | 19.314 |
| 2.262 | 19.383 |
| 2.263 | 19.442 |
| 2.264 | 19.508 |
| 2.265 | 19.566 |
| 2.266 | 19.632 |
| 2.267 | 19.712 |
| 2.268 | 19.765 |
| 2.269 | 19.827 |
| 2.27 | 19.902 |
| 2.271 | 19.987 |
| 2.272 | 20.038 |
| 2.273 | 20.111 |
| 2.274 | 20.179 |
| 2.275 | 20.261 |
| 2.276 | 20.328 |
| 2.277 | 20.393 |
| 2.278 | 20.47 |
| 2.279 | 20.552 |
| 2.28 | 20.622 |
| 2.281 | 20.687 |
| 2.282 | 20.78 |
| 2.283 | 20.85 |
| 2.284 | 20.919 |
| 2.285 | 20.99 |
| 2.286 | 21.078 |
| 2.287 | 21.145 |
| 2.288 | 21.237 |
| 2.289 | 21.325 |
| 2.29 | 21.405 |
| 2.291 | 21.479 |
| 2.292 | 21.571 |
| 2.293 | 21.637 |
| 2.294 | 21.732 |
| 2.295 | 21.812 |
| 2.296 | 21.901 |
| 2.297 | 21.973 |
| 2.298 | 22.054 |
| 2.299 | 22.124 |
| 2.3 | 22.226 |
| 2.301 | 22.315 |
| 2.302 | 22.393 |
| 2.303 | 22.47 |
| 2.304 | 22.56 |
| 2.305 | 22.662 |
| 2.306 | 22.752 |
| 2.307 | 22.834 |
| 2.308 | 22.933 |
| 2.309 | 23.021 |
| 2.31 | 23.091 |
| 2.311 | 23.197 |
| 2.312 | 23.277 |
| 2.313 | 23.355 |
| 2.314 | 23.466 |
| 2.315 | 23.558 |
| 2.316 | 23.627 |
| 2.317 | 23.728 |
| 2.318 | 23.824 |
| 2.319 | 23.92 |
| 2.32 | 24.008 |
| 2.321 | 24.105 |
| 2.322 | 24.184 |
| 2.323 | 24.265 |
| 2.324 | 24.379 |
| 2.325 | 24.462 |
| 2.326 | 24.551 |
| 2.327 | 24.639 |
| 2.328 | 24.762 |
| 2.329 | 24.837 |
| 2.33 | 24.928 |
| 2.331 | 25.043 |
| 2.332 | 25.131 |
| 2.333 | 25.218 |
| 2.334 | 25.3 |
| 2.335 | 25.395 |
| 2.336 | 25.476 |
| 2.337 | 25.579 |
| 2.338 | 25.664 |
| 2.339 | 25.791 |
| 2.34 | 25.873 |
| 2.341 | 25.975 |
| 2.342 | 26.064 |
| 2.343 | 26.157 |
| 2.344 | 26.227 |
| 2.345 | 26.315 |
| 2.346 | 26.448 |
| 2.347 | 26.511 |
| 2.348 | 26.628 |
| 2.349 | 26.723 |
| 2.35 | 26.797 |
| 2.351 | 26.9 |
| 2.352 | 27.025 |
| 2.353 | 27.11 |
| 2.354 | 27.213 |
| 2.355 | 27.296 |
| 2.356 | 27.378 |
| 2.357 | 27.49 |
| 2.358 | 27.557 |
| 2.359 | 27.676 |
| 2.36 | 27.771 |
| 2.361 | 27.871 |
| 2.362 | 27.944 |
| 2.363 | 28.037 |
| 2.364 | 28.16 |
| 2.365 | 28.233 |
| 2.366 | 28.33 |
| 2.367 | 28.422 |
| 2.368 | 28.528 |
| 2.369 | 28.61 |
| 2.37 | 28.718 |
| 2.371 | 28.784 |
| 2.372 | 28.913 |
| 2.373 | 29 |
| 2.374 | 29.083 |
| 2.375 | 29.177 |
| 2.376 | 29.305 |
| 2.377 | 29.382 |
| 2.378 | 29.491 |
| 2.379 | 29.563 |
| 2.38 | 29.654 |
| 2.381 | 29.737 |
| 2.382 | 29.85 |
| 2.383 | 29.939 |
| 2.384 | 30.027 |
| 2.385 | 30.106 |
| 2.386 | 30.218 |
| 2.387 | 30.311 |
| 2.388 | 30.387 |
| 2.389 | 30.481 |
| 2.39 | 30.592 |
| 2.391 | 30.68 |
| 2.392 | 30.803 |
| 2.393 | 30.869 |
| 2.394 | 30.945 |
| 2.395 | 31.035 |
| 2.396 | 31.118 |
| 2.397 | 31.206 |
| 2.398 | 31.318 |
| 2.399 | 31.409 |
| 2.4 | 31.487 |
| 2.401 | 31.594 |
| 2.402 | 31.681 |
| 2.403 | 31.783 |
| 2.404 | 31.846 |
| 2.405 | 31.943 |
| 2.406 | 32.065 |
| 2.407 | 32.14 |
| 2.408 | 32.229 |
| 2.409 | 32.295 |
| 2.41 | 32.382 |
| 2.411 | 32.495 |
| 2.412 | 32.579 |
| 2.413 | 32.653 |
| 2.414 | 32.745 |
| 2.415 | 32.844 |
| 2.416 | 32.925 |
| 2.417 | 33.015 |
| 2.418 | 33.06 |
| 2.419 | 33.192 |
| 2.42 | 33.279 |
| 2.421 | 33.348 |
| 2.422 | 33.435 |
| 2.423 | 33.5 |
| 2.424 | 33.612 |
| 2.425 | 33.67 |
| 2.426 | 33.773 |
| 2.427 | 33.872 |
| 2.428 | 33.936 |
| 2.429 | 34.061 |
| 2.43 | 34.106 |
| 2.431 | 34.203 |
| 2.432 | 34.297 |
| 2.433 | 34.368 |
| 2.434 | 34.454 |
| 2.435 | 34.531 |
| 2.436 | 34.624 |
| 2.437 | 34.7 |
| 2.438 | 34.787 |
| 2.439 | 34.852 |
| 2.44 | 34.949 |
| 2.441 | 35.009 |
| 2.442 | 35.095 |
| 2.443 | 35.177 |
| 2.444 | 35.253 |
| 2.445 | 35.354 |
| 2.446 | 35.442 |
| 2.447 | 35.481 |
| 2.448 | 35.59 |
| 2.449 | 35.664 |
| 2.45 | 35.743 |
| 2.451 | 35.828 |
| 2.452 | 35.891 |
| 2.453 | 35.982 |
| 2.454 | 36.093 |
| 2.455 | 36.155 |
| 2.456 | 36.2 |
| 2.457 | 36.329 |
| 2.458 | 36.373 |
| 2.459 | 36.456 |
| 2.46 | 36.526 |
| 2.461 | 36.62 |
| 2.462 | 36.673 |
| 2.463 | 36.79 |
| 2.464 | 36.843 |
| 2.465 | 36.898 |
| 2.466 | 36.976 |
| 2.467 | 37.055 |
| 2.468 | 37.102 |
| 2.469 | 37.193 |
| 2.47 | 37.263 |
| 2.471 | 37.314 |
| 2.472 | 37.409 |
| 2.473 | 37.477 |
| 2.474 | 37.55 |
| 2.475 | 37.642 |
| 2.476 | 37.694 |
| 2.477 | 37.786 |
| 2.478 | 37.843 |
| 2.479 | 37.931 |
| 2.48 | 37.986 |
| 2.481 | 38.064 |
| 2.482 | 38.115 |
| 2.483 | 38.176 |
| 2.484 | 38.27 |
| 2.485 | 38.338 |
| 2.486 | 38.427 |
| 2.487 | 38.51 |
| 2.488 | 38.531 |
| 2.489 | 38.607 |
| 2.49 | 38.686 |
| 2.491 | 38.755 |
| 2.492 | 38.811 |
| 2.493 | 38.843 |
| 2.494 | 38.942 |
| 2.495 | 38.995 |
| 2.496 | 39.026 |
| 2.497 | 39.14 |
| 2.498 | 39.21 |
| 2.499 | 39.261 |
| 2.5 | 39.33 |
| 2.5016700000000003 | 39.295 |
| 2.5055300000000003 | 39.537 |
| 2.50939 | 39.776 |
| 2.51325 | 40.014 |
| 2.51711 | 40.237 |
| 2.52098 | 40.471 |
| 2.52484 | 40.693 |
| 2.5286999999999997 | 40.906 |
| 2.53256 | 41.123 |
| 2.53642 | 41.335 |
| 2.54028 | 41.54 |
| 2.54414 | 41.746 |
| 2.548 | 41.948 |
| 2.55186 | 42.139 |
| 2.55572 | 42.318 |
| 2.55958 | 42.517 |
| 2.56344 | 42.685 |
| 2.5673000000000004 | 42.868 |
| 2.57116 | 43.043 |
| 2.57502 | 43.202 |
| 2.5788800000000003 | 43.369 |
| 2.58275 | 43.535 |
| 2.5866100000000003 | 43.706 |
| 2.59047 | 43.847 |
| 2.59433 | 44.016 |
| 2.59819 | 44.15 |
| 2.60205 | 44.296 |
| 2.6059099999999997 | 44.43 |
| 2.60977 | 44.552 |
| 2.61363 | 44.696 |
| 2.6174899999999997 | 44.82 |
| 2.62135 | 44.928 |
| 2.62521 | 45.072 |
| 2.62907 | 45.172 |
| 2.63293 | 45.291 |
| 2.63679 | 45.38 |
| 2.64065 | 45.504 |
| 2.6445100000000004 | 45.596 |
| 2.64838 | 45.684 |
| 2.65224 | 45.795 |
| 2.6561 | 45.869 |
| 2.65996 | 45.962 |
| 2.6638200000000003 | 46.031 |
| 2.66768 | 46.097 |
| 2.67154 | 46.151 |
| 2.6754000000000002 | 46.268 |
| 2.67926 | 46.305 |
| 2.6831199999999997 | 46.361 |
| 2.68698 | 46.414 |
| 2.69084 | 46.458 |
| 2.6946999999999997 | 46.492 |
| 2.69856 | 46.505 |
| 2.70242 | 46.525 |
| 2.70628 | 46.52 |
| 2.71015 | 46.538 |
| 2.71401 | 46.526 |
| 2.71787 | 46.526 |
| 2.72173 | 46.491 |
| 2.72559 | 46.471 |
| 2.72945 | 46.454 |
| 2.73331 | 46.427 |
| 2.73717 | 46.337 |
| 2.7410300000000003 | 46.236 |
| 2.74489 | 46.148 |
| 2.74875 | 46.028 |
| 2.7526100000000002 | 45.889 |
| 2.7564699999999998 | 45.703 |
| 2.7603299999999997 | 45.565 |
| 2.76419 | 45.378 |
| 2.76805 | 45.209 |
| 2.7719099999999997 | 45.012 |
| 2.77578 | 44.853 |
| 2.7796399999999997 | 44.662 |
| 2.7835 | 44.49 |
| 2.78736 | 44.32 |
| 2.7912199999999996 | 44.161 |
| 2.79508 | 43.989 |
| 2.79894 | 43.852 |
| 2.8028000000000004 | 43.719 |
| 2.80666 | 43.577 |
| 2.81052 | 43.459 |
| 2.8143800000000003 | 43.338 |
| 2.81824 | 43.232 |
| 2.8221 | 43.129 |
| 2.8259600000000002 | 43.044 |
| 2.8298200000000002 | 42.949 |
| 2.8336799999999998 | 42.866 |
| 2.8375500000000002 | 42.796 |
| 2.8414099999999998 | 42.733 |
| 2.84527 | 42.665 |
| 2.84913 | 42.612 |
| 2.8529899999999997 | 42.556 |
| 2.85685 | 42.509 |
| 2.86071 | 42.459 |
| 2.86457 | 42.408 |
| 2.86843 | 42.377 |
| 2.87229 | 42.332 |
| 2.87615 | 42.288 |
| 2.8800100000000004 | 42.245 |
| 2.88387 | 42.227 |
| 2.88773 | 42.177 |
| 2.8915900000000003 | 42.139 |
| 2.89545 | 42.112 |
| 2.89931 | 42.076 |
| 2.90318 | 42.044 |
| 2.90704 | 42.018 |
| 2.9109000000000003 | 41.998 |
| 2.9147600000000002 | 41.964 |
| 2.9186199999999998 | 41.939 |
| 2.92248 | 41.911 |
| 2.92634 | 41.875 |
| 2.9301999999999997 | 41.854 |
| 2.93406 | 41.832 |
| 2.93792 | 41.796 |
| 2.94178 | 41.775 |
| 2.94564 | 41.757 |
| 2.9495 | 41.729 |
| 2.95336 | 41.702 |
| 2.95722 | 41.681 |
| 2.96108 | 41.669 |
| 2.96495 | 41.632 |
| 2.96881 | 41.625 |
| 2.97267 | 41.592 |
| 2.9765300000000003 | 41.559 |
| 2.98039 | 41.529 |
| 2.98425 | 41.506 |
| 2.9881100000000003 | 41.472 |
| 2.99197 | 41.449 |
| 2.9958299999999998 | 41.421 |
| 2.99969 | 41.376 |
| 3.00355 | 41.34 |
| 3.0074099999999997 | 41.296 |
| 3.01127 | 41.249 |
| 3.01513 | 41.205 |
| 3.0189899999999996 | 41.162 |
| 3.02285 | 41.12 |
| 3.02671 | 41.063 |
| 3.03058 | 41.007 |
| 3.03444 | 40.958 |
| 3.0383 | 40.9 |
| 3.04216 | 40.834 |
| 3.04602 | 40.764 |
| 3.04988 | 40.694 |
| 3.05374 | 40.638 |
| 3.0576 | 40.58 |
| 3.06146 | 40.496 |
| 3.0653200000000003 | 40.412 |
| 3.06918 | 40.344 |
| 3.0730399999999998 | 40.265 |
| 3.0769 | 40.19 |
| 3.08076 | 40.104 |
| 3.0846199999999997 | 40.019 |
| 3.08848 | 39.938 |
| 3.0923499999999997 | 39.865 |
| 3.09621 | 39.775 |
| 3.10007 | 39.695 |
| 3.1039299999999996 | 39.617 |
| 3.10779 | 39.543 |
| 3.11165 | 39.467 |
| 3.11551 | 39.382 |
| 3.11937 | 39.309 |
| 3.12323 | 39.223 |
| 3.12709 | 39.136 |
| 3.13095 | 39.062 |
| 3.13481 | 38.97 |
| 3.1386700000000003 | 38.888 |
| 3.1425300000000003 | 38.798 |
| 3.14639 | 38.714 |
| 3.15025 | 38.62 |
| 3.15411 | 38.529 |
| 3.1579800000000002 | 38.442 |
| 3.16184 | 38.339 |
| 3.1656999999999997 | 38.245 |
| 3.16956 | 38.153 |
| 3.17342 | 38.061 |
| 3.17728 | 37.958 |
| 3.18114 | 37.854 |
| 3.185 | 37.743 |
| 3.18886 | 37.642 |
| 3.19272 | 37.542 |
| 3.19658 | 37.422 |
| 3.20044 | 37.308 |
| 3.2043000000000004 | 37.198 |
| 3.20816 | 37.093 |
| 3.21202 | 36.977 |
| 3.2158800000000003 | 36.858 |
| 3.21975 | 36.734 |
| 3.2236100000000003 | 36.613 |
| 3.22747 | 36.494 |
| 3.23133 | 36.37 |
| 3.2351900000000002 | 36.256 |
| 3.23905 | 36.125 |
| 3.2429099999999997 | 36.005 |
| 3.24677 | 35.882 |
| 3.25063 | 35.752 |
| 3.2544899999999997 | 35.625 |
| 3.25835 | 35.491 |
| 3.26221 | 35.352 |
| 3.26607 | 35.224 |
| 3.26993 | 35.087 |
| 3.27379 | 34.958 |
| 3.27765 | 34.829 |
| 3.2815100000000004 | 34.684 |
| 3.28538 | 34.546 |
| 3.28924 | 34.413 |
| 3.2931 | 34.275 |
| 3.29696 | 34.134 |
| 3.3008200000000003 | 33.985 |
| 3.30468 | 33.842 |
| 3.30854 | 33.707 |
| 3.3124000000000002 | 33.566 |
| 3.31626 | 33.419 |
| 3.3201199999999997 | 33.264 |
| 3.32398 | 33.126 |
| 3.32784 | 32.974 |
| 3.3316999999999997 | 32.817 |
| 3.33556 | 32.667 |
| 3.33942 | 32.512 |
| 3.34328 | 32.361 |
| 3.34715 | 32.201 |
| 3.35101 | 32.035 |
| 3.35487 | 31.873 |
| 3.35873 | 31.717 |
| 3.36259 | 31.571 |
| 3.36645 | 31.424 |
| 3.37031 | 31.28 |
| 3.37417 | 31.128 |
| 3.3780300000000003 | 30.97 |
| 3.38189 | 30.811 |
| 3.38575 | 30.653 |
| 3.3896100000000002 | 30.503 |
| 3.3934699999999998 | 30.334 |
| 3.3973299999999997 | 30.175 |
| 3.40119 | 30.018 |
| 3.40505 | 29.849 |
| 3.4089099999999997 | 29.703 |
| 3.41278 | 29.536 |
| 3.4166399999999997 | 29.373 |
| 3.4205 | 29.221 |
| 3.42436 | 29.073 |
| 3.4282199999999996 | 28.91 |
| 3.43208 | 28.752 |
| 3.43594 | 28.58 |
| 3.4398 | 28.424 |
| 3.44366 | 28.259 |
| 3.44752 | 28.098 |
| 3.45138 | 27.934 |
| 3.45524 | 27.772 |
| 3.4591 | 27.603 |
| 3.46296 | 27.442 |
| 3.4668200000000002 | 27.276 |
| 3.4706799999999998 | 27.106 |
| 3.4745500000000002 | 26.939 |
| 3.47841 | 26.773 |
| 3.48227 | 26.61 |
| 3.48613 | 26.444 |
| 3.4899899999999997 | 26.291 |
| 3.49385 | 26.119 |
| 3.49771 | 25.952 |
| 3.50157 | 25.786 |
| 3.50543 | 25.63 |
| 3.50929 | 25.473 |
| 3.51315 | 25.298 |
| 3.5170100000000004 | 25.138 |
| 3.52087 | 24.969 |
| 3.52473 | 24.808 |
| 3.5285900000000003 | 24.645 |
| 3.53245 | 24.477 |
| 3.53631 | 24.316 |
| 3.54018 | 24.143 |
| 3.54404 | 23.986 |
| 3.5479000000000003 | 23.822 |
| 3.5517600000000003 | 23.659 |
| 3.55562 | 23.495 |
| 3.55948 | 23.335 |
| 3.56334 | 23.173 |
| 3.5671999999999997 | 22.997 |
| 3.57106 | 22.834 |
| 3.57492 | 22.678 |
| 3.57878 | 22.512 |
| 3.58264 | 22.349 |
| 3.5865 | 22.194 |
| 3.59036 | 22.032 |
| 3.59422 | 21.863 |
| 3.59808 | 21.707 |
| 3.60195 | 21.552 |
| 3.60581 | 21.385 |
| 3.60967 | 21.226 |
| 3.6135300000000004 | 21.059 |
| 3.61739 | 20.899 |
| 3.62125 | 20.741 |
| 3.6251100000000003 | 20.584 |
| 3.62897 | 20.412 |
| 3.63283 | 20.264 |
| 3.63669 | 20.11 |
| 3.64055 | 19.953 |
| 3.6444099999999997 | 19.792 |
| 3.64827 | 19.632 |
| 3.65213 | 19.478 |
| 3.6559899999999996 | 19.322 |
| 3.65985 | 19.166 |
| 3.66371 | 19.016 |
| 3.66758 | 18.855 |
| 3.67144 | 18.694 |
| 3.6753 | 18.553 |
| 3.67916 | 18.395 |
| 3.68302 | 18.244 |
| 3.68688 | 18.091 |
| 3.69074 | 17.942 |
| 3.6946 | 17.794 |
| 3.69846 | 17.639 |
| 3.7023200000000003 | 17.492 |
| 3.70618 | 17.337 |
| 3.71004 | 17.186 |
| 3.7139 | 17.042 |
| 3.71776 | 16.891 |
| 3.7216199999999997 | 16.748 |
| 3.72548 | 16.604 |
| 3.7293499999999997 | 16.463 |
| 3.73321 | 16.314 |
| 3.73707 | 16.172 |
| 3.7409299999999996 | 16.023 |
| 3.74479 | 15.884 |
| 3.74865 | 15.74 |
| 3.75251 | 15.603 |
| 3.75637 | 15.471 |
| 3.76023 | 15.325 |
| 3.76409 | 15.187 |
| 3.76795 | 15.044 |
| 3.77181 | 14.905 |
| 3.77567 | 14.764 |
| 3.7795300000000003 | 14.638 |
| 3.78339 | 14.502 |
| 3.78725 | 14.359 |
| 3.79111 | 14.221 |
| 3.79498 | 14.09 |
| 3.79884 | 13.957 |
| 3.8026999999999997 | 13.828 |
| 3.80656 | 13.696 |
| 3.81042 | 13.563 |
| 3.81428 | 13.432 |
| 3.81814 | 13.297 |
| 3.822 | 13.171 |
| 3.82586 | 13.047 |
| 3.82972 | 12.916 |
| 3.83358 | 12.79 |
| 3.83744 | 12.67 |
| 3.8413000000000004 | 12.546 |
| 3.84516 | 12.417 |
| 3.84902 | 12.294 |
| 3.8528800000000003 | 12.174 |
| 3.85675 | 12.052 |
| 3.8606100000000003 | 11.934 |
| 3.86447 | 11.812 |
| 3.86833 | 11.694 |
| 3.8721900000000002 | 11.574 |
| 3.87605 | 11.454 |
| 3.8799099999999997 | 11.336 |
| 3.88377 | 11.216 |
| 3.88763 | 11.099 |
| 3.8914899999999997 | 10.982 |
| 3.89535 | 10.874 |
| 3.89921 | 10.759 |
| 3.90307 | 10.652 |
| 3.90693 | 10.538 |
| 3.91079 | 10.418 |
| 3.91465 | 10.305 |
| 3.9185100000000004 | 10.199 |
| 3.92238 | 10.088 |
| 3.92624 | 9.98 |
| 3.9301 | 9.872 |
| 3.93396 | 9.77 |
| 3.9378200000000003 | 9.665 |
| 3.94168 | 9.551 |
| 3.94554 | 9.456 |
| 3.9494000000000002 | 9.353 |
| 3.95326 | 9.248 |
| 3.9571199999999997 | 9.14 |
| 3.96098 | 9.04 |
| 3.96484 | 8.943 |
| 3.9686999999999997 | 8.844 |
| 3.97256 | 8.746 |
| 3.97642 | 8.651 |
| 3.98028 | 8.549 |
| 3.98415 | 8.455 |
| 3.98801 | 8.361 |
| 3.99187 | 8.266 |
| 3.99573 | 8.167 |
| 3.99959 | 8.076 |
| 4.00345 | 7.977 |
| 4.00731 | 7.882 |
| 4.01117 | 7.794 |
| 4.01503 | 7.71 |
| 4.01889 | 7.622 |
| 4.02275 | 7.533 |
| 4.02661 | 7.441 |
| 4.03047 | 7.348 |
| 4.03433 | 7.263 |
| 4.03819 | 7.177 |
| 4.042050000000001 | 7.09 |
| 4.04591 | 7.007 |
| 4.04978 | 6.92 |
| 4.05364 | 6.842 |
| 4.0575 | 6.759 |
| 4.0613600000000005 | 6.682 |
| 4.06522 | 6.6 |
| 4.06908 | 6.523 |
| 4.07294 | 6.441 |
| 4.0768 | 6.367 |
| 4.08066 | 6.28 |
| 4.08452 | 6.203 |
| 4.08838 | 6.134 |
| 4.092239999999999 | 6.056 |
| 4.096100000000001 | 5.975 |
| 4.09996 | 5.908 |
| 4.10382 | 5.84 |
| 4.10768 | 5.764 |
| 4.11155 | 5.688 |
| 4.11541 | 5.62 |
| 4.11927 | 5.551 |
| 4.12313 | 5.481 |
| 4.12699 | 5.414 |
| 4.130850000000001 | 5.342 |
| 4.13471 | 5.278 |
| 4.13857 | 5.212 |
| 4.14243 | 5.143 |
| 4.14629 | 5.078 |
| 4.15015 | 5.017 |
| 4.15401 | 4.955 |
| 4.15787 | 4.894 |
| 4.1617299999999995 | 4.83 |
| 4.16559 | 4.767 |
| 4.169449999999999 | 4.706 |
| 4.173310000000001 | 4.643 |
| 4.17718 | 4.589 |
| 4.18104 | 4.524 |
| 4.1849 | 4.459 |
| 4.18876 | 4.403 |
| 4.19262 | 4.35 |
| 4.196479999999999 | 4.3 |
| 4.20034 | 4.245 |
| 4.2042 | 4.191 |
| 4.208060000000001 | 4.132 |
| 4.21192 | 4.074 |
| 4.21578 | 4.021 |
| 4.21964 | 3.968 |
| 4.2235 | 3.904 |
| 4.22736 | 3.845 |
| 4.23122 | 3.802 |
| 4.23508 | 3.769 |
| 4.23895 | 3.705 |
| 4.24281 | 3.643 |
| 4.24667 | 3.602 |
| 4.2505299999999995 | 3.568 |
| 4.25439 | 3.522 |
| 4.25825 | 3.485 |
| 4.26211 | 3.437 |
| 4.26597 | 3.374 |
| 4.26983 | 3.338 |
| 4.273689999999999 | 3.28 |
| 4.27755 | 3.213 |
| 4.28141 | 3.18 |
| 4.285270000000001 | 3.17 |
| 4.28913 | 3.111 |
| 4.29299 | 3.055 |
| 4.29685 | 3.027 |
| 4.3007100000000005 | 3 |
| 4.30458 | 2.957 |
| 4.308439999999999 | 2.912 |
| 4.3123000000000005 | 2.878 |
| 4.31616 | 2.85 |
| 4.32002 | 2.814 |
| 4.32388 | 2.769 |
| 4.3277399999999995 | 2.732 |
| 4.331600000000001 | 2.693 |
| 4.33546 | 2.658 |
| 4.33932 | 2.627 |
| 4.34318 | 2.589 |
| 4.34704 | 2.555 |
| 4.350899999999999 | 2.521 |
| 4.354760000000001 | 2.486 |
| 4.35862 | 2.454 |
| 4.36248 | 2.426 |
| 4.366350000000001 | 2.392 |
| 4.37021 | 2.36 |
| 4.37407 | 2.323 |
| 4.37793 | 2.293 |
| 4.38179 | 2.268 |
| 4.38565 | 2.237 |
| 4.3895100000000005 | 2.204 |
| 4.39337 | 2.173 |
| 4.3972299999999995 | 2.141 |
| 4.40109 | 2.115 |
| 4.4049499999999995 | 2.089 |
| 4.408810000000001 | 2.06 |
| 4.41267 | 2.029 |
| 4.41653 | 2.003 |
| 4.42039 | 1.981 |
| 4.42425 | 1.96 |
| 4.428109999999999 | 1.937 |
| 4.431979999999999 | 1.908 |
| 4.43584 | 1.882 |
| 4.4397 | 1.857 |
| 4.443560000000001 | 1.834 |
| 4.44742 | 1.81 |
| 4.45128 | 1.788 |
| 4.45514 | 1.768 |
| 4.459 | 1.746 |
| 4.46286 | 1.718 |
| 4.4667200000000005 | 1.695 |
| 4.47058 | 1.67 |
| 4.4744399999999995 | 1.648 |
| 4.4783 | 1.628 |
| 4.4821599999999995 | 1.608 |
| 4.486020000000001 | 1.591 |
| 4.48988 | 1.571 |
| 4.49375 | 1.55 |
| 4.49761 | 1.532 |
| 4.50147 | 1.518 |
| 4.50533 | 1.493 |
| 4.509189999999999 | 1.472 |
| 4.51305 | 1.455 |
| 4.51691 | 1.444 |
| 4.520770000000001 | 1.425 |
| 4.52463 | 1.406 |
| 4.52849 | 1.392 |
| 4.53235 | 1.372 |
| 4.53621 | 1.354 |
| 4.54007 | 1.336 |
| 4.5439300000000005 | 1.323 |
| 4.54779 | 1.307 |
| 4.5516499999999995 | 1.291 |
| 4.55551 | 1.276 |
| 4.55938 | 1.264 |
| 4.5632399999999995 | 1.25 |
| 4.5671 | 1.235 |
| 4.57096 | 1.22 |
| 4.57482 | 1.211 |
| 4.57868 | 1.2 |
| 4.58254 | 1.186 |
| 4.586399999999999 | 1.172 |
| 4.59026 | 1.164 |
| 4.59412 | 1.151 |
| 4.59798 | 1.137 |
| 4.60184 | 1.129 |
| 4.6057 | 1.119 |
| 4.60956 | 1.107 |
| 4.61342 | 1.098 |
| 4.61728 | 1.084 |
| 4.621149999999999 | 1.075 |
| 4.6250100000000005 | 1.07 |
| 4.62887 | 1.059 |
| 4.63273 | 1.047 |
| 4.63659 | 1.036 |
| 4.6404499999999995 | 1.027 |
| 4.644310000000001 | 1.021 |
| 4.64817 | 1.006 |
| 4.65203 | 0.994 |
| 4.65589 | 0.987 |
| 4.65975 | 0.984 |
| 4.663609999999999 | 0.978 |
| 4.667470000000001 | 0.968 |
| 4.67133 | 0.964 |
| 4.67519 | 0.959 |
| 4.67905 | 0.949 |
| 4.68291 | 0.942 |
| 4.68678 | 0.934 |
| 4.69064 | 0.922 |
| 4.6945 | 0.917 |
| 4.69836 | 0.913 |
| 4.7022200000000005 | 0.905 |
| 4.70608 | 0.901 |
| 4.70994 | 0.9 |
| 4.7138 | 0.892 |
| 4.7176599999999995 | 0.885 |
| 4.721520000000001 | 0.881 |
| 4.72538 | 0.876 |
| 4.72924 | 0.872 |
| 4.7331 | 0.868 |
| 4.73696 | 0.861 |
| 4.740819999999999 | 0.856 |
| 4.744680000000001 | 0.851 |
| 4.74855 | 0.845 |
| 4.75241 | 0.841 |
| 4.756270000000001 | 0.837 |
| 4.76013 | 0.834 |
| 4.76399 | 0.829 |
| 4.76785 | 0.822 |
| 4.77171 | 0.82 |
| 4.77557 | 0.815 |
| 4.7794300000000005 | 0.808 |
| 4.78329 | 0.806 |
| 4.78715 | 0.805 |
| 4.79101 | 0.803 |
| 4.7948699999999995 | 0.799 |
| 4.79873 | 0.792 |
| 4.80259 | 0.788 |
| 4.80645 | 0.785 |
| 4.81031 | 0.781 |
| 4.81418 | 0.778 |
| 4.81804 | 0.777 |
| 4.821899999999999 | 0.78 |
| 4.82576 | 0.781 |
| 4.82962 | 0.78 |
| 4.83348 | 0.775 |
| 4.83734 | 0.768 |
| 4.8412 | 0.763 |
| 4.84506 | 0.765 |
| 4.84892 | 0.769 |
| 4.85278 | 0.769 |
| 4.8566400000000005 | 0.763 |
| 4.8605 | 0.758 |
| 4.86436 | 0.761 |
| 4.86822 | 0.763 |
| 4.8720799999999995 | 0.761 |
| 4.87595 | 0.758 |
| 4.87981 | 0.758 |
| 4.88367 | 0.757 |
| 4.88753 | 0.756 |
| 4.89139 | 0.751 |
| 4.89525 | 0.746 |
| 4.899109999999999 | 0.746 |
| 4.90297 | 0.744 |
| 4.90683 | 0.744 |
| 4.91069 | 0.744 |
| 4.91455 | 0.745 |
| 4.91841 | 0.747 |
| 4.92227 | 0.746 |
| 4.92613 | 0.743 |
| 4.92999 | 0.744 |
| 4.9338500000000005 | 0.747 |
| 4.93771 | 0.744 |
| 4.94158 | 0.742 |
| 4.94544 | 0.74 |
| 4.9493 | 0.739 |
| 4.95316 | 0.741 |
| 4.957020000000001 | 0.745 |
| 4.96088 | 0.746 |
| 4.96474 | 0.747 |
| 4.9686 | 0.749 |
| 4.97246 | 0.745 |
| 4.976319999999999 | 0.741 |
| 4.980180000000001 | 0.743 |
| 4.98404 | 0.742 |
| 4.9879 | 0.741 |
| 4.99176 | 0.742 |
| 4.99562 | 0.744 |
| 4.999479999999999 | 0.745 |
| 5.00335 | 0.746 |
| 5.00721 | 0.748 |
| 5.01107 | 0.747 |
| 5.0149300000000006 | 0.746 |
| 5.01879 | 0.747 |
| 5.02265 | 0.749 |
| 5.02651 | 0.748 |
| 5.03037 | 0.748 |
| 5.03423 | 0.749 |
| 5.03809 | 0.749 |
| 5.04195 | 0.748 |
| 5.04581 | 0.753 |
| 5.04967 | 0.756 |
| 5.053529999999999 | 0.757 |
| 5.057390000000001 | 0.759 |
| 5.06125 | 0.761 |
| 5.06511 | 0.762 |
| 5.06898 | 0.763 |
| 5.07284 | 0.759 |
| 5.0767 | 0.757 |
| 5.08056 | 0.756 |
| 5.08442 | 0.755 |
| 5.08828 | 0.759 |
| 5.0921400000000006 | 0.762 |
| 5.096 | 0.764 |
| 5.09986 | 0.767 |
| 5.10372 | 0.768 |
| 5.10758 | 0.768 |
| 5.11144 | 0.77 |
| 5.1153 | 0.774 |
| 5.11916 | 0.777 |
| 5.12302 | 0.776 |
| 5.12688 | 0.779 |
| 5.13075 | 0.782 |
| 5.1346099999999995 | 0.782 |
| 5.13847 | 0.781 |
| 5.14233 | 0.779 |
| 5.14619 | 0.78 |
| 5.15005 | 0.784 |
| 5.15391 | 0.785 |
| 5.15777 | 0.785 |
| 5.16163 | 0.788 |
| 5.16549 | 0.789 |
| 5.1693500000000006 | 0.79 |
| 5.17321 | 0.789 |
| 5.17707 | 0.791 |
| 5.18093 | 0.795 |
| 5.18479 | 0.797 |
| 5.18865 | 0.798 |
| 5.19251 | 0.799 |
| 5.19638 | 0.802 |
| 5.20024 | 0.801 |
| 5.2041 | 0.796 |
| 5.20796 | 0.799 |
| 5.2118199999999995 | 0.804 |
| 5.21568 | 0.806 |
| 5.21954 | 0.809 |
| 5.2234 | 0.813 |
| 5.22726 | 0.814 |
| 5.23112 | 0.811 |
| 5.234979999999999 | 0.808 |
| 5.23884 | 0.811 |
| 5.2427 | 0.813 |
| 5.246560000000001 | 0.814 |
| 5.25042 | 0.816 |
| 5.25428 | 0.816 |
| 5.25814 | 0.816 |
| 5.26201 | 0.818 |
| 5.26587 | 0.818 |
| 5.269729999999999 | 0.816 |
| 5.27359 | 0.817 |
| 5.27745 | 0.82 |
| 5.28131 | 0.825 |
| 5.28517 | 0.827 |
| 5.2890299999999995 | 0.826 |
| 5.292890000000001 | 0.825 |
| 5.29675 | 0.829 |
| 5.30061 | 0.832 |
| 5.30447 | 0.831 |
| 5.30833 | 0.83 |
| 5.312189999999999 | 0.83 |
| 5.316050000000001 | 0.831 |
| 5.31991 | 0.832 |
| 5.32378 | 0.834 |
| 5.327640000000001 | 0.836 |
| 5.3315 | 0.839 |
| 5.33536 | 0.839 |
| 5.33922 | 0.837 |
| 5.34308 | 0.833 |
| 5.34694 | 0.829 |
| 5.3508000000000004 | 0.83 |
| 5.35466 | 0.836 |
| 5.35852 | 0.837 |
| 5.36238 | 0.834 |
| 5.3662399999999995 | 0.837 |
| 5.370100000000001 | 0.842 |
| 5.37396 | 0.844 |
| 5.37782 | 0.843 |
| 5.38168 | 0.84 |
| 5.38554 | 0.84 |
| 5.38941 | 0.841 |
| 5.39327 | 0.842 |
| 5.39713 | 0.844 |
| 5.40099 | 0.846 |
| 5.404850000000001 | 0.846 |
| 5.40871 | 0.845 |
| 5.41257 | 0.843 |
| 5.41643 | 0.844 |
| 5.42029 | 0.845 |
| 5.42415 | 0.845 |
| 5.4280100000000004 | 0.847 |
| 5.43187 | 0.847 |
| 5.4357299999999995 | 0.846 |
| 5.43959 | 0.848 |
| 5.4434499999999995 | 0.848 |
| 5.447310000000001 | 0.846 |
| 5.45118 | 0.845 |
| 5.45504 | 0.846 |
| 5.4589 | 0.847 |
| 5.46276 | 0.845 |
| 5.46662 | 0.844 |
| 5.470479999999999 | 0.846 |
| 5.47434 | 0.845 |
| 5.4782 | 0.844 |
| 5.482060000000001 | 0.846 |
| 5.48592 | 0.847 |
| 5.48978 | 0.843 |
| 5.49364 | 0.84 |
| 5.4975 | 0.839 |
| 5.50136 | 0.838 |
| 5.5052200000000004 | 0.838 |
| 5.50908 | 0.84 |
| 5.5129399999999995 | 0.841 |
| 5.51681 | 0.84 |
| 5.52067 | 0.837 |
| 5.5245299999999995 | 0.836 |
| 5.52839 | 0.837 |
| 5.53225 | 0.836 |
| 5.53611 | 0.833 |
| 5.53997 | 0.83 |
| 5.54383 | 0.828 |
| 5.547689999999999 | 0.83 |
| 5.55155 | 0.833 |
| 5.55541 | 0.833 |
| 5.559270000000001 | 0.829 |
| 5.56313 | 0.824 |
| 5.56699 | 0.822 |
| 5.57085 | 0.823 |
| 5.57471 | 0.825 |
| 5.57858 | 0.826 |
| 5.582439999999999 | 0.829 |
| 5.5863000000000005 | 0.832 |
| 5.59016 | 0.833 |
| 5.59402 | 0.827 |
| 5.59788 | 0.821 |
| 5.6017399999999995 | 0.82 |
| 5.605600000000001 | 0.821 |
| 5.60946 | 0.817 |
| 5.61332 | 0.813 |
| 5.61718 | 0.812 |
| 5.62104 | 0.812 |
| 5.624899999999999 | 0.813 |
| 5.628760000000001 | 0.81 |
| 5.63262 | 0.805 |
| 5.63648 | 0.804 |
| 5.64034 | 0.803 |
| 5.64421 | 0.801 |
| 5.64807 | 0.799 |
| 5.65193 | 0.798 |
| 5.65579 | 0.797 |
| 5.65965 | 0.794 |
| 5.6635100000000005 | 0.793 |
| 5.66737 | 0.794 |
| 5.6712299999999995 | 0.796 |
| 5.67509 | 0.796 |
| 5.6789499999999995 | 0.793 |
| 5.682810000000001 | 0.79 |
| 5.68667 | 0.789 |
| 5.69053 | 0.787 |
| 5.69439 | 0.784 |
| 5.69825 | 0.783 |
| 5.702109999999999 | 0.781 |
| 5.705979999999999 | 0.778 |
| 5.70984 | 0.776 |
| 5.7137 | 0.774 |
| 5.717560000000001 | 0.772 |
| 5.72142 | 0.77 |
| 5.72528 | 0.769 |
| 5.72914 | 0.768 |
| 5.733 | 0.764 |
| 5.73686 | 0.762 |
| 5.7407200000000005 | 0.763 |
| 5.74458 | 0.764 |
| 5.7484399999999996 | 0.764 |
| 5.7523 | 0.758 |
| 5.7561599999999995 | 0.749 |
| 5.760020000000001 | 0.742 |
| 5.76388 | 0.738 |
| 5.76774 | 0.734 |
| 5.77161 | 0.731 |
| 5.77547 | 0.73 |
| 5.77933 | 0.729 |
| 5.783189999999999 | 0.729 |
| 5.78705 | 0.73 |
| 5.79091 | 0.733 |
| 5.794770000000001 | 0.734 |
| 5.79863 | 0.732 |
| 5.80249 | 0.727 |
| 5.80635 | 0.722 |
| 5.81021 | 0.72 |
| 5.81407 | 0.718 |
| 5.8179300000000005 | 0.715 |
| 5.82179 | 0.71 |
| 5.8256499999999996 | 0.707 |
| 5.82951 | 0.704 |
| 5.83338 | 0.702 |
| 5.8372399999999995 | 0.7 |
| 5.8411 | 0.697 |
| 5.84496 | 0.694 |
| 5.84882 | 0.691 |
| 5.85268 | 0.686 |
| 5.85654 | 0.678 |
| 5.860399999999999 | 0.67 |
| 5.86426 | 0.667 |
| 5.86812 | 0.669 |
| 5.87198 | 0.673 |
| 5.87584 | 0.676 |
| 5.8797 | 0.673 |
| 5.88356 | 0.665 |
| 5.88742 | 0.66 |
| 5.89128 | 0.658 |
| 5.8951400000000005 | 0.657 |
| 5.8990100000000005 | 0.653 |
| 5.90287 | 0.649 |
| 5.90673 | 0.646 |
| 5.91059 | 0.644 |
| 5.9144499999999995 | 0.641 |
| 5.91831 | 0.638 |
| 5.92217 | 0.639 |
| 5.92603 | 0.643 |
| 5.92989 | 0.647 |
| 5.93375 | 0.646 |
| 5.937609999999999 | 0.638 |
| 5.941470000000001 | 0.63 |
| 5.94533 | 0.627 |
| 5.94919 | 0.627 |
| 5.95305 | 0.626 |
| 5.95691 | 0.623 |
| 5.96078 | 0.621 |
| 5.96464 | 0.619 |
| 5.9685 | 0.617 |
| 5.97236 | 0.616 |
| 5.9762200000000005 | 0.615 |
| 5.98008 | 0.613 |
| 5.98394 | 0.61 |
| 5.9878 | 0.604 |
| 5.9916599999999995 | 0.6 |
| 5.995520000000001 | 0.602 |
| 5.99938 | 0.608 |
| 6.00324 | 0.612 |
| 6.0071 | 0.614 |
| 6.01096 | 0.614 |
| 6.014819999999999 | 0.612 |
| 6.018680000000001 | 0.609 |
| 6.02254 | 0.605 |
| 6.02641 | 0.604 |
| 6.030270000000001 | 0.603 |
| 6.03413 | 0.603 |
| 6.03799 | 0.603 |
| 6.04185 | 0.6 |
| 6.04571 | 0.593 |
| 6.04957 | 0.584 |
| 6.0534300000000005 | 0.586 |
| 6.05729 | 0.594 |
| 6.06115 | 0.599 |
| 6.06501 | 0.602 |
| 6.0688699999999995 | 0.604 |
| 6.07273 | 0.608 |
| 6.07659 | 0.612 |
| 6.08045 | 0.612 |
| 6.08431 | 0.609 |
| 6.08818 | 0.608 |
| 6.09204 | 0.607 |
| 6.095899999999999 | 0.608 |
| 6.09976 | 0.61 |
| 6.10362 | 0.615 |
| 6.10748 | 0.62 |
| 6.11134 | 0.622 |
| 6.1152 | 0.625 |
| 6.11906 | 0.631 |
| 6.12292 | 0.634 |
| 6.12678 | 0.636 |
| 6.1306400000000005 | 0.637 |
| 6.1345 | 0.639 |
| 6.13836 | 0.639 |
| 6.14222 | 0.639 |
| 6.1460799999999995 | 0.641 |
| 6.14994 | 0.645 |
| 6.15381 | 0.65 |
| 6.15767 | 0.655 |
| 6.16153 | 0.658 |
| 6.16539 | 0.661 |
| 6.16925 | 0.663 |
| 6.173109999999999 | 0.664 |
| 6.17697 | 0.665 |
| 6.18083 | 0.667 |
| 6.18469 | 0.671 |
| 6.18855 | 0.675 |
| 6.19241 | 0.675 |
| 6.19627 | 0.672 |
| 6.20013 | 0.668 |
| 6.20399 | 0.668 |
| 6.2078500000000005 | 0.67 |
| 6.21171 | 0.669 |
| 6.21558 | 0.666 |
| 6.21944 | 0.662 |
| 6.2233 | 0.658 |
| 6.22716 | 0.653 |
| 6.23102 | 0.649 |
| 6.23488 | 0.648 |
| 6.23874 | 0.646 |
| 6.2426 | 0.641 |
| 6.24646 | 0.635 |
| 6.250319999999999 | 0.632 |
| 6.25418 | 0.631 |
| 6.25804 | 0.63 |
| 6.2619 | 0.625 |
| 6.26576 | 0.618 |
| 6.26962 | 0.613 |
| 6.273479999999999 | 0.611 |
| 6.277340000000001 | 0.61 |
| 6.28121 | 0.606 |
| 6.285069999999999 | 0.601 |
| 6.288930000000001 | 0.596 |
| 6.29279 | 0.592 |
| 6.29665 | 0.588 |
| 6.30051 | 0.583 |
| 6.30437 | 0.58 |
| 6.30823 | 0.578 |
| 6.31209 | 0.575 |
| 6.31595 | 0.572 |
| 6.31981 | 0.571 |
| 6.32367 | 0.571 |
| 6.327529999999999 | 0.568 |
| 6.331390000000001 | 0.564 |
| 6.33525 | 0.56 |
| 6.33911 | 0.554 |
| 6.34298 | 0.545 |
| 6.34684 | 0.538 |
| 6.3507 | 0.538 |
| 6.35456 | 0.54 |
| 6.35842 | 0.539 |
| 6.36228 | 0.536 |
| 6.366140000000001 | 0.533 |
| 6.37 | 0.53 |
| 6.37386 | 0.529 |
| 6.37772 | 0.527 |
| 6.38158 | 0.524 |
| 6.38544 | 0.52 |
| 6.3893 | 0.517 |
| 6.39316 | 0.514 |
| 6.39702 | 0.51 |
| 6.40088 | 0.506 |
| 6.404739999999999 | 0.503 |
| 6.4086099999999995 | 0.502 |
| 6.41247 | 0.504 |
| 6.41633 | 0.506 |
| 6.42019 | 0.505 |
| 6.42405 | 0.502 |
| 6.42791 | 0.499 |
| 6.43177 | 0.496 |
| 6.43563 | 0.493 |
| 6.43949 | 0.49 |
| 6.443350000000001 | 0.489 |
| 6.44721 | 0.489 |
| 6.45107 | 0.487 |
| 6.45493 | 0.484 |
| 6.45879 | 0.48 |
| 6.46265 | 0.476 |
| 6.46651 | 0.474 |
| 6.4703800000000005 | 0.472 |
| 6.47424 | 0.468 |
| 6.4781 | 0.463 |
| 6.48196 | 0.458 |
| 6.4858199999999995 | 0.45 |
| 6.48968 | 0.443 |
| 6.49354 | 0.442 |
| 6.4974 | 0.449 |
| 6.50126 | 0.455 |
| 6.50512 | 0.459 |
| 6.508979999999999 | 0.461 |
| 6.51284 | 0.461 |
| 6.5167 | 0.458 |
| 6.520560000000001 | 0.455 |
| 6.52442 | 0.454 |
| 6.52828 | 0.453 |
| 6.53214 | 0.453 |
| 6.53601 | 0.454 |
| 6.53987 | 0.453 |
| 6.543729999999999 | 0.449 |
| 6.5475900000000005 | 0.443 |
| 6.55145 | 0.438 |
| 6.55531 | 0.435 |
| 6.55917 | 0.434 |
| 6.5630299999999995 | 0.434 |
| 6.56689 | 0.436 |
| 6.57075 | 0.437 |
| 6.57461 | 0.436 |
| 6.57847 | 0.433 |
| 6.58233 | 0.428 |
| 6.586189999999999 | 0.425 |
| 6.59005 | 0.422 |
| 6.59391 | 0.42 |
| 6.597779999999999 | 0.421 |
| 6.601640000000001 | 0.42 |
| 6.6055 | 0.419 |
| 6.60936 | 0.419 |
| 6.61322 | 0.42 |
| 6.61708 | 0.42 |
| 6.620939999999999 | 0.417 |
| 6.6248000000000005 | 0.413 |
| 6.62866 | 0.41 |
| 6.63252 | 0.409 |
| 6.63638 | 0.407 |
| 6.6402399999999995 | 0.404 |
| 6.644100000000001 | 0.401 |
| 6.64796 | 0.402 |
| 6.65182 | 0.405 |
| 6.65568 | 0.408 |
| 6.65954 | 0.408 |
| 6.66341 | 0.406 |
| 6.66727 | 0.402 |
| 6.67113 | 0.401 |
| 6.67499 | 0.402 |
| 6.678850000000001 | 0.407 |
| 6.68271 | 0.412 |
| 6.68657 | 0.412 |
| 6.69043 | 0.407 |
| 6.69429 | 0.404 |
| 6.69815 | 0.404 |
| 6.7020100000000005 | 0.406 |
| 6.70587 | 0.408 |
| 6.7097299999999995 | 0.409 |
| 6.71359 | 0.407 |
| 6.7174499999999995 | 0.404 |
| 6.721310000000001 | 0.401 |
| 6.72518 | 0.402 |
| 6.72904 | 0.405 |
| 6.7329 | 0.406 |
| 6.73676 | 0.405 |
| 6.74062 | 0.402 |
| 6.744479999999999 | 0.4 |
| 6.74834 | 0.4 |
| 6.7522 | 0.4 |
| 6.756060000000001 | 0.398 |
| 6.75992 | 0.397 |
| 6.76378 | 0.396 |
| 6.76764 | 0.396 |
| 6.7715 | 0.396 |
| 6.77536 | 0.394 |
| 6.7792200000000005 | 0.391 |
| 6.78308 | 0.388 |
| 6.7869399999999995 | 0.386 |
| 6.7908100000000005 | 0.387 |
| 6.79467 | 0.389 |
| 6.7985299999999995 | 0.391 |
| 6.80239 | 0.392 |
| 6.80625 | 0.392 |
| 6.81011 | 0.393 |
| 6.81397 | 0.396 |
| 6.81783 | 0.398 |
| 6.821689999999999 | 0.397 |
| 6.82555 | 0.396 |
| 6.82941 | 0.394 |
| 6.833270000000001 | 0.393 |
| 6.83713 | 0.392 |
| 6.84099 | 0.391 |
| 6.84485 | 0.393 |
| 6.84871 | 0.396 |
| 6.85258 | 0.399 |
| 6.856439999999999 | 0.4 |
| 6.8603000000000005 | 0.397 |
| 6.86416 | 0.392 |
| 6.8680200000000005 | 0.388 |
| 6.87188 | 0.39 |
| 6.8757399999999995 | 0.392 |
| 6.8796 | 0.394 |
| 6.88346 | 0.396 |
| 6.88732 | 0.398 |
| 6.89118 | 0.4 |
| 6.89504 | 0.403 |
| 6.898899999999999 | 0.404 |
| 6.90276 | 0.403 |
| 6.90662 | 0.403 |
| 6.91048 | 0.405 |
| 6.91434 | 0.41 |
| 6.91821 | 0.414 |
| 6.92207 | 0.417 |
| 6.92593 | 0.418 |
| 6.92979 | 0.418 |
| 6.933649999999999 | 0.419 |
| 6.9375100000000005 | 0.419 |
| 6.94137 | 0.418 |
| 6.94523 | 0.419 |
| 6.94909 | 0.421 |
| 6.9529499999999995 | 0.424 |
| 6.956810000000001 | 0.426 |
| 6.96067 | 0.426 |
| 6.96453 | 0.422 |
| 6.96839 | 0.42 |
| 6.97225 | 0.42 |
| 6.976109999999999 | 0.421 |
| 6.979979999999999 | 0.422 |
| 6.98384 | 0.421 |
| 6.9877 | 0.421 |
| 6.991560000000001 | 0.423 |
| 6.99542 | 0.424 |
| 6.99928 | 0.425 |
| 7.00314 | 0.425 |
| 7.007 | 0.426 |
| 7.01086 | 0.429 |
| 7.0147200000000005 | 0.433 |
| 7.01858 | 0.436 |
| 7.02244 | 0.437 |
| 7.0263 | 0.436 |
| 7.0301599999999995 | 0.434 |
| 7.034020000000001 | 0.434 |
| 7.03788 | 0.435 |
| 7.04174 | 0.437 |
| 7.04561 | 0.439 |
| 7.04947 | 0.441 |
| 7.05333 | 0.444 |
| 7.057189999999999 | 0.447 |
| 7.06105 | 0.449 |
| 7.06491 | 0.451 |
| 7.068770000000001 | 0.452 |
| 7.07263 | 0.453 |
| 7.07649 | 0.454 |
| 7.08035 | 0.456 |
| 7.08421 | 0.458 |
| 7.08807 | 0.461 |
| 7.0919300000000005 | 0.462 |
| 7.09579 | 0.464 |
| 7.09965 | 0.465 |
| 7.10351 | 0.467 |
| 7.10738 | 0.471 |
| 7.11124 | 0.474 |
| 7.1151 | 0.475 |
| 7.11896 | 0.474 |
| 7.12282 | 0.473 |
| 7.12668 | 0.472 |
| 7.13054 | 0.472 |
| 7.134399999999999 | 0.472 |
| 7.13826 | 0.473 |
| 7.14212 | 0.475 |
| 7.14598 | 0.479 |
| 7.14984 | 0.484 |
| 7.1537 | 0.488 |
| 7.15756 | 0.49 |
| 7.16142 | 0.492 |
| 7.16528 | 0.496 |
| 7.1691400000000005 | 0.501 |
| 7.1730100000000006 | 0.505 |
| 7.17687 | 0.508 |
| 7.18073 | 0.509 |
| 7.18459 | 0.509 |
| 7.18845 | 0.51 |
| 7.19231 | 0.51 |
| 7.19617 | 0.512 |
| 7.20003 | 0.514 |
| 7.20389 | 0.515 |
| 7.20775 | 0.516 |
| 7.211609999999999 | 0.515 |
| 7.21547 | 0.515 |
| 7.21933 | 0.517 |
| 7.22319 | 0.52 |
| 7.22705 | 0.523 |
| 7.23091 | 0.527 |
| 7.23478 | 0.53 |
| 7.23864 | 0.534 |
| 7.2425 | 0.537 |
| 7.246359999999999 | 0.54 |
| 7.2502200000000006 | 0.541 |
| 7.25408 | 0.543 |
| 7.25794 | 0.545 |
| 7.2618 | 0.548 |
| 7.26566 | 0.552 |
| 7.269520000000001 | 0.555 |
| 7.27338 | 0.556 |
| 7.27724 | 0.556 |
| 7.2811 | 0.556 |
| 7.28496 | 0.557 |
| 7.288819999999999 | 0.558 |
| 7.292680000000001 | 0.56 |
| 7.29654 | 0.565 |
| 7.30041 | 0.571 |
| 7.304270000000001 | 0.577 |
| 7.30813 | 0.582 |
| 7.31199 | 0.585 |
| 7.31585 | 0.586 |
| 7.31971 | 0.587 |
| 7.32357 | 0.588 |
| 7.3274300000000006 | 0.588 |
| 7.33129 | 0.589 |
| 7.33515 | 0.591 |
| 7.33901 | 0.594 |
| 7.34287 | 0.601 |
| 7.34673 | 0.608 |
| 7.35059 | 0.614 |
| 7.35445 | 0.618 |
| 7.35831 | 0.62 |
| 7.36218 | 0.622 |
| 7.36604 | 0.624 |
| 7.3698999999999995 | 0.625 |
| 7.37376 | 0.628 |
| 7.37762 | 0.633 |
| 7.38148 | 0.639 |
| 7.38534 | 0.643 |
| 7.3892 | 0.646 |
| 7.39306 | 0.648 |
| 7.39692 | 0.649 |
| 7.40078 | 0.651 |
| 7.4046400000000006 | 0.653 |
| 7.4085 | 0.655 |
| 7.41236 | 0.658 |
| 7.41622 | 0.662 |
| 7.42008 | 0.668 |
| 7.42394 | 0.674 |
| 7.42781 | 0.68 |
| 7.43167 | 0.687 |
| 7.43553 | 0.693 |
| 7.43939 | 0.698 |
| 7.44325 | 0.703 |
| 7.4471099999999995 | 0.707 |
| 7.45097 | 0.712 |
| 7.45483 | 0.715 |
| 7.45869 | 0.719 |
| 7.46255 | 0.723 |
| 7.46641 | 0.726 |
| 7.47027 | 0.731 |
| 7.47413 | 0.736 |
| 7.47799 | 0.741 |
| 7.4818500000000006 | 0.747 |
| 7.48571 | 0.753 |
| 7.48958 | 0.758 |
| 7.49344 | 0.761 |
| 7.4973 | 0.764 |
| 7.50116 | 0.766 |
| 7.50502 | 0.77 |
| 7.50888 | 0.775 |
| 7.51274 | 0.78 |
| 7.5166 | 0.786 |
| 7.52046 | 0.79 |
| 7.5243199999999995 | 0.793 |
| 7.52818 | 0.796 |
| 7.53204 | 0.799 |
| 7.5359 | 0.805 |
| 7.53976 | 0.813 |
| 7.54362 | 0.822 |
| 7.547479999999999 | 0.829 |
| 7.55134 | 0.833 |
| 7.55521 | 0.838 |
| 7.559069999999999 | 0.842 |
| 7.562930000000001 | 0.846 |
| 7.56679 | 0.85 |
| 7.57065 | 0.853 |
| 7.57451 | 0.856 |
| 7.57837 | 0.861 |
| 7.582229999999999 | 0.867 |
| 7.58609 | 0.875 |
| 7.58995 | 0.883 |
| 7.59381 | 0.89 |
| 7.59767 | 0.896 |
| 7.6015299999999995 | 0.9 |
| 7.605390000000001 | 0.904 |
| 7.60925 | 0.907 |
| 7.61311 | 0.913 |
| 7.61698 | 0.92 |
| 7.62084 | 0.928 |
| 7.6247 | 0.936 |
| 7.62856 | 0.942 |
| 7.63242 | 0.946 |
| 7.63628 | 0.95 |
| 7.640140000000001 | 0.955 |
| 7.644 | 0.96 |
| 7.64786 | 0.965 |
| 7.65172 | 0.97 |
| 7.65558 | 0.976 |
| 7.65944 | 0.982 |
| 7.6633000000000004 | 0.988 |
| 7.66716 | 0.994 |
| 7.67102 | 1 |
| 7.67488 | 1.006 |
| 7.6787399999999995 | 1.012 |
| 7.6826099999999995 | 1.019 |
| 7.68647 | 1.026 |
| 7.69033 | 1.033 |
| 7.69419 | 1.04 |
| 7.69805 | 1.046 |
| 7.70191 | 1.051 |
| 7.70577 | 1.055 |
| 7.70963 | 1.058 |
| 7.71349 | 1.062 |
| 7.717350000000001 | 1.067 |
| 7.72121 | 1.074 |
| 7.72507 | 1.082 |
| 7.72893 | 1.09 |
| 7.73279 | 1.097 |
| 7.73665 | 1.103 |
| 7.7405100000000004 | 1.109 |
| 7.7443800000000005 | 1.114 |
| 7.74824 | 1.12 |
| 7.7521 | 1.126 |
| 7.75596 | 1.131 |
| 7.7598199999999995 | 1.138 |
| 7.76368 | 1.145 |
| 7.76754 | 1.154 |
| 7.7714 | 1.164 |
| 7.77526 | 1.174 |
| 7.77912 | 1.184 |
| 7.782979999999999 | 1.192 |
| 7.78684 | 1.2 |
| 7.7907 | 1.204 |
| 7.794560000000001 | 1.208 |
| 7.79842 | 1.213 |
| 7.80228 | 1.219 |
| 7.80614 | 1.228 |
| 7.81001 | 1.236 |
| 7.81387 | 1.244 |
| 7.817729999999999 | 1.25 |
| 7.8215900000000005 | 1.254 |
| 7.82545 | 1.258 |
| 7.82931 | 1.263 |
| 7.83317 | 1.269 |
| 7.8370299999999995 | 1.276 |
| 7.84089 | 1.284 |
| 7.84475 | 1.291 |
| 7.84861 | 1.3 |
| 7.85247 | 1.308 |
| 7.85633 | 1.316 |
| 7.860189999999999 | 1.324 |
| 7.86405 | 1.331 |
| 7.86791 | 1.338 |
| 7.871779999999999 | 1.346 |
| 7.875640000000001 | 1.355 |
| 7.8795 | 1.364 |
| 7.88336 | 1.373 |
| 7.88722 | 1.382 |
| 7.89108 | 1.39 |
| 7.894939999999999 | 1.398 |
| 7.8988000000000005 | 1.406 |
| 7.90266 | 1.413 |
| 7.90652 | 1.42 |
| 7.91038 | 1.426 |
| 7.9142399999999995 | 1.431 |
| 7.918100000000001 | 1.436 |
| 7.92196 | 1.442 |
| 7.92582 | 1.449 |
| 7.92968 | 1.457 |
| 7.93354 | 1.466 |
| 7.93741 | 1.475 |
| 7.94127 | 1.482 |
| 7.94513 | 1.486 |
| 7.94899 | 1.49 |
| 7.952850000000001 | 1.494 |
| 7.95671 | 1.499 |
| 7.96057 | 1.506 |
| 7.96443 | 1.514 |
| 7.96829 | 1.523 |
| 7.97215 | 1.534 |
| 7.9760100000000005 | 1.545 |
| 7.97987 | 1.555 |
| 7.9837299999999995 | 1.565 |
| 7.98759 | 1.573 |
| 7.9914499999999995 | 1.58 |
| 7.995310000000001 | 1.587 |
| 7.99918 | 1.595 |
| 8.00304 | 1.602 |
| 8.0069 | 1.61 |
| 8.01076 | 1.619 |
| 8.01462 | 1.628 |
| 8.01848 | 1.637 |
| 8.02234 | 1.647 |
| 8.0262 | 1.656 |
| 8.03006 | 1.665 |
| 8.03392 | 1.674 |
| 8.03778 | 1.683 |
| 8.041640000000001 | 1.693 |
| 8.0455 | 1.703 |
| 8.04936 | 1.713 |
| 8.05322 | 1.722 |
| 8.05708 | 1.73 |
| 8.06094 | 1.737 |
| 8.06481 | 1.744 |
| 8.068670000000001 | 1.751 |
| 8.07253 | 1.759 |
| 8.07639 | 1.768 |
| 8.08025 | 1.777 |
| 8.084109999999999 | 1.786 |
| 8.08797 | 1.793 |
| 8.09183 | 1.8 |
| 8.09569 | 1.806 |
| 8.09955 | 1.813 |
| 8.10341 | 1.819 |
| 8.10727 | 1.826 |
| 8.11113 | 1.834 |
| 8.11499 | 1.842 |
| 8.11885 | 1.85 |
| 8.12271 | 1.859 |
| 8.12658 | 1.867 |
| 8.13044 | 1.876 |
| 8.1343 | 1.885 |
| 8.13816 | 1.895 |
| 8.14202 | 1.906 |
| 8.14588 | 1.916 |
| 8.14974 | 1.927 |
| 8.1536 | 1.938 |
| 8.15746 | 1.949 |
| 8.16132 | 1.96 |
| 8.16518 | 1.972 |
| 8.16904 | 1.982 |
| 8.1729 | 1.992 |
| 8.17676 | 2.001 |
| 8.18062 | 2.01 |
| 8.184479999999999 | 2.019 |
| 8.18834 | 2.028 |
| 8.19221 | 2.036 |
| 8.196069999999999 | 2.043 |
| 8.19993 | 2.05 |
| 8.203790000000001 | 2.056 |
| 8.20765 | 2.065 |
| 8.21151 | 2.074 |
| 8.21537 | 2.084 |
| 8.21923 | 2.095 |
| 8.223090000000001 | 2.106 |
| 8.22695 | 2.115 |
| 8.23081 | 2.123 |
| 8.23467 | 2.13 |
| 8.23853 | 2.137 |
| 8.242389999999999 | 2.145 |
| 8.24625 | 2.154 |
| 8.250110000000001 | 2.164 |
| 8.25398 | 2.176 |
| 8.25784 | 2.19 |
| 8.261700000000001 | 2.203 |
| 8.265559999999999 | 2.216 |
| 8.26942 | 2.227 |
| 8.273280000000002 | 2.237 |
| 8.27714 | 2.247 |
| 8.281 | 2.256 |
| 8.28486 | 2.266 |
| 8.28872 | 2.275 |
| 8.29258 | 2.285 |
| 8.29644 | 2.296 |
| 8.3003 | 2.307 |
| 8.30416 | 2.318 |
| 8.30802 | 2.327 |
| 8.311879999999999 | 2.335 |
| 8.31574 | 2.342 |
| 8.31961 | 2.35 |
| 8.323469999999999 | 2.358 |
| 8.32733 | 2.368 |
| 8.331190000000001 | 2.379 |
| 8.335049999999999 | 2.391 |
| 8.33891 | 2.402 |
| 8.34277 | 2.413 |
| 8.34663 | 2.422 |
| 8.35049 | 2.43 |
| 8.35435 | 2.439 |
| 8.35821 | 2.45 |
| 8.36207 | 2.462 |
| 8.36593 | 2.475 |
| 8.36979 | 2.487 |
| 8.37365 | 2.497 |
| 8.377510000000001 | 2.506 |
| 8.38138 | 2.514 |
| 8.38524 | 2.524 |
| 8.389100000000001 | 2.534 |
| 8.392959999999999 | 2.544 |
| 8.39682 | 2.556 |
| 8.40068 | 2.568 |
| 8.40454 | 2.58 |
| 8.4084 | 2.592 |
| 8.41226 | 2.604 |
| 8.416120000000001 | 2.616 |
| 8.419979999999999 | 2.626 |
| 8.42384 | 2.636 |
| 8.427700000000002 | 2.645 |
| 8.43156 | 2.654 |
| 8.43542 | 2.663 |
| 8.43928 | 2.672 |
| 8.44314 | 2.681 |
| 8.44701 | 2.69 |
| 8.45087 | 2.699 |
| 8.45473 | 2.708 |
| 8.458590000000001 | 2.718 |
| 8.46245 | 2.729 |
| 8.46631 | 2.739 |
| 8.47017 | 2.75 |
| 8.47403 | 2.761 |
| 8.477889999999999 | 2.772 |
| 8.48175 | 2.783 |
| 8.485610000000001 | 2.794 |
| 8.489469999999999 | 2.805 |
| 8.49333 | 2.817 |
| 8.49719 | 2.829 |
| 8.50105 | 2.841 |
| 8.50491 | 2.854 |
| 8.50878 | 2.867 |
| 8.51264 | 2.881 |
| 8.5165 | 2.894 |
| 8.52036 | 2.907 |
| 8.52422 | 2.918 |
| 8.52808 | 2.929 |
| 8.53194 | 2.94 |
| 8.5358 | 2.951 |
| 8.53966 | 2.963 |
| 8.543520000000001 | 2.976 |
| 8.547379999999999 | 2.989 |
| 8.55124 | 3.002 |
| 8.5551 | 3.014 |
| 8.558959999999999 | 3.024 |
| 8.56282 | 3.032 |
| 8.56668 | 3.04 |
| 8.570540000000001 | 3.048 |
| 8.57441 | 3.057 |
| 8.57827 | 3.066 |
| 8.58213 | 3.078 |
| 8.585989999999999 | 3.09 |
| 8.58985 | 3.102 |
| 8.59371 | 3.115 |
| 8.59757 | 3.128 |
| 8.60143 | 3.141 |
| 8.60529 | 3.154 |
| 8.60915 | 3.168 |
| 8.613010000000001 | 3.182 |
| 8.61687 | 3.195 |
| 8.62073 | 3.207 |
| 8.62459 | 3.219 |
| 8.62845 | 3.232 |
| 8.63231 | 3.245 |
| 8.63618 | 3.259 |
| 8.64004 | 3.272 |
| 8.6439 | 3.284 |
| 8.64776 | 3.294 |
| 8.651620000000001 | 3.303 |
| 8.655479999999999 | 3.311 |
| 8.65934 | 3.32 |
| 8.663200000000002 | 3.331 |
| 8.66706 | 3.343 |
| 8.67092 | 3.356 |
| 8.67478 | 3.369 |
| 8.67864 | 3.382 |
| 8.6825 | 3.394 |
| 8.68636 | 3.406 |
| 8.69022 | 3.419 |
| 8.69408 | 3.432 |
| 8.697940000000001 | 3.446 |
| 8.70181 | 3.459 |
| 8.70567 | 3.471 |
| 8.70953 | 3.481 |
| 8.713389999999999 | 3.488 |
| 8.71725 | 3.495 |
| 8.721110000000001 | 3.502 |
| 8.724969999999999 | 3.51 |
| 8.72883 | 3.519 |
| 8.73269 | 3.529 |
| 8.73655 | 3.539 |
| 8.74041 | 3.548 |
| 8.74427 | 3.557 |
| 8.74813 | 3.566 |
| 8.75199 | 3.575 |
| 8.75585 | 3.587 |
| 8.759709999999998 | 3.599 |
| 8.76357 | 3.614 |
| 8.76744 | 3.629 |
| 8.7713 | 3.646 |
| 8.77516 | 3.662 |
| 8.779020000000001 | 3.677 |
| 8.782879999999999 | 3.691 |
| 8.78674 | 3.704 |
| 8.7906 | 3.716 |
| 8.794459999999999 | 3.727 |
| 8.79832 | 3.738 |
| 8.80218 | 3.749 |
| 8.806040000000001 | 3.761 |
| 8.809899999999999 | 3.772 |
| 8.81376 | 3.783 |
| 8.817620000000002 | 3.794 |
| 8.82148 | 3.805 |
| 8.82534 | 3.817 |
| 8.82921 | 3.831 |
| 8.83307 | 3.844 |
| 8.83693 | 3.858 |
| 8.84079 | 3.872 |
| 8.84465 | 3.883 |
| 8.848510000000001 | 3.894 |
| 8.85237 | 3.903 |
| 8.85623 | 3.912 |
| 8.86009 | 3.923 |
| 8.86395 | 3.934 |
| 8.867809999999999 | 3.949 |
| 8.87167 | 3.964 |
| 8.875530000000001 | 3.979 |
| 8.879389999999999 | 3.995 |
| 8.88325 | 4.01 |
| 8.88711 | 4.025 |
| 8.89097 | 4.037 |
| 8.89484 | 4.05 |
| 8.898700000000002 | 4.059 |
| 8.90256 | 4.068 |
| 8.90642 | 4.077 |
| 8.91028 | 4.086 |
| 8.91414 | 4.098 |
| 8.918 | 4.111 |
| 8.92186 | 4.125 |
| 8.92572 | 4.139 |
| 8.92958 | 4.152 |
| 8.933440000000001 | 4.164 |
| 8.937299999999999 | 4.175 |
| 8.94116 | 4.186 |
| 8.945020000000001 | 4.199 |
| 8.948879999999999 | 4.212 |
| 8.95274 | 4.226 |
| 8.956610000000001 | 4.241 |
| 8.960469999999999 | 4.254 |
| 8.96433 | 4.267 |
| 8.96819 | 4.279 |
| 8.97205 | 4.29 |
| 8.97591 | 4.302 |
| 8.97977 | 4.314 |
| 8.98363 | 4.326 |
| 8.98749 | 4.339 |
| 8.99135 | 4.352 |
| 8.995209999999998 | 4.365 |
| 8.99907 | 4.377 |
| 9.002930000000001 | 4.389 |
| 9.00679 | 4.402 |
| 9.01065 | 4.414 |
| 9.01451 | 4.427 |
| 9.01837 | 4.44 |
| 9.02224 | 4.452 |
| 9.0261 | 4.465 |
| 9.029959999999999 | 4.477 |
| 9.03382 | 4.489 |
| 9.03768 | 4.502 |
| 9.041540000000001 | 4.515 |
| 9.045399999999999 | 4.53 |
| 9.04926 | 4.546 |
| 9.053120000000002 | 4.564 |
| 9.05698 | 4.583 |
| 9.06084 | 4.6 |
| 9.0647 | 4.617 |
| 9.06856 | 4.63 |
| 9.07242 | 4.643 |
| 9.07628 | 4.654 |
| 9.08014 | 4.664 |
| 9.084010000000001 | 4.676 |
| 9.08787 | 4.689 |
| 9.09173 | 4.702 |
| 9.09559 | 4.715 |
| 9.099450000000001 | 4.728 |
| 9.103309999999999 | 4.74 |
| 9.10717 | 4.751 |
| 9.111030000000001 | 4.761 |
| 9.114889999999999 | 4.772 |
| 9.11875 | 4.784 |
| 9.12261 | 4.797 |
| 9.12647 | 4.812 |
| 9.13033 | 4.827 |
| 9.13419 | 4.842 |
| 9.13805 | 4.856 |
| 9.14191 | 4.87 |
| 9.14577 | 4.883 |
| 9.14964 | 4.897 |
| 9.1535 | 4.912 |
| 9.15736 | 4.928 |
| 9.16122 | 4.944 |
| 9.16508 | 4.959 |
| 9.168940000000001 | 4.974 |
| 9.172799999999999 | 4.988 |
| 9.17666 | 5.002 |
| 9.18052 | 5.015 |
| 9.184379999999999 | 5.028 |
| 9.18824 | 5.04 |
| 9.1921 | 5.052 |
| 9.19596 | 5.063 |
| 9.199819999999999 | 5.075 |
| 9.20368 | 5.086 |
| 9.207540000000002 | 5.098 |
| 9.211409999999999 | 5.111 |
| 9.21527 | 5.126 |
| 9.21913 | 5.142 |
| 9.22299 | 5.159 |
| 9.22685 | 5.177 |
| 9.230709999999998 | 5.192 |
| 9.23457 | 5.208 |
| 9.238430000000001 | 5.22 |
| 9.24229 | 5.232 |
| 9.24615 | 5.244 |
| 9.25001 | 5.256 |
| 9.253870000000001 | 5.27 |
| 9.257729999999999 | 5.285 |
| 9.26159 | 5.299 |
| 9.265450000000001 | 5.314 |
| 9.269309999999999 | 5.328 |
| 9.27317 | 5.341 |
| 9.277040000000001 | 5.354 |
| 9.280899999999999 | 5.367 |
| 9.28476 | 5.379 |
| 9.288620000000002 | 5.391 |
| 9.29248 | 5.402 |
| 9.29634 | 5.413 |
| 9.3002 | 5.423 |
| 9.30406 | 5.434 |
| 9.30792 | 5.445 |
| 9.31178 | 5.458 |
| 9.31564 | 5.474 |
| 9.3195 | 5.49 |
| 9.323360000000001 | 5.509 |
| 9.327219999999999 | 5.528 |
| 9.33108 | 5.545 |
| 9.334940000000001 | 5.563 |
| 9.338809999999999 | 5.576 |
| 9.34267 | 5.59 |
| 9.346530000000001 | 5.602 |
| 9.350389999999999 | 5.614 |
| 9.35425 | 5.626 |
| 9.35811 | 5.639 |
| 9.36197 | 5.652 |
| 9.36583 | 5.664 |
| 9.36969 | 5.677 |
| 9.37355 | 5.689 |
| 9.37741 | 5.701 |
| 9.38127 | 5.714 |
| 9.385129999999998 | 5.726 |
| 9.38899 | 5.742 |
| 9.392850000000001 | 5.758 |
| 9.396709999999999 | 5.776 |
| 9.40057 | 5.796 |
| 9.404440000000001 | 5.816 |
| 9.408299999999999 | 5.835 |
| 9.41216 | 5.854 |
| 9.41602 | 5.87 |
| 9.41988 | 5.886 |
| 9.42374 | 5.901 |
| 9.4276 | 5.915 |
| 9.43146 | 5.927 |
| 9.435319999999999 | 5.94 |
| 9.43918 | 5.952 |
| 9.443040000000002 | 5.964 |
| 9.4469 | 5.976 |
| 9.45076 | 5.989 |
| 9.45462 | 6.002 |
| 9.45848 | 6.017 |
| 9.46234 | 6.032 |
| 9.466209999999998 | 6.047 |
| 9.47007 | 6.063 |
| 9.473930000000001 | 6.077 |
| 9.47779 | 6.092 |
| 9.48165 | 6.105 |
| 9.48551 | 6.117 |
| 9.489370000000001 | 6.13 |
| 9.493229999999999 | 6.142 |
| 9.49709 | 6.154 |
| 9.500950000000001 | 6.167 |
| 9.504809999999999 | 6.18 |
| 9.50867 | 6.194 |
| 9.51253 | 6.208 |
| 9.51639 | 6.222 |
| 9.52025 | 6.235 |
| 9.52411 | 6.248 |
| 9.52797 | 6.259 |
| 9.53184 | 6.27 |
| 9.5357 | 6.281 |
| 9.53956 | 6.292 |
| 9.54342 | 6.302 |
| 9.54728 | 6.312 |
| 9.55114 | 6.323 |
| 9.555 | 6.333 |
| 9.558860000000001 | 6.343 |
| 9.562719999999999 | 6.356 |
| 9.56658 | 6.37 |
| 9.570440000000001 | 6.386 |
| 9.5743 | 6.403 |
| 9.57816 | 6.42 |
| 9.58202 | 6.436 |
| 9.58588 | 6.451 |
| 9.589739999999999 | 6.464 |
| 9.59361 | 6.477 |
| 9.59747 | 6.489 |
| 9.60133 | 6.501 |
| 9.60519 | 6.514 |
| 9.60905 | 6.527 |
| 9.61291 | 6.541 |
| 9.61677 | 6.557 |
| 9.620629999999998 | 6.573 |
| 9.62449 | 6.591 |
| 9.628350000000001 | 6.609 |
| 9.632209999999999 | 6.626 |
| 9.63607 | 6.643 |
| 9.63993 | 6.659 |
| 9.643790000000001 | 6.673 |
| 9.64765 | 6.687 |
| 9.65151 | 6.701 |
| 9.655370000000001 | 6.715 |
| 9.65924 | 6.729 |
| 9.6631 | 6.743 |
| 9.66696 | 6.757 |
| 9.670819999999999 | 6.771 |
| 9.67468 | 6.784 |
| 9.678540000000002 | 6.796 |
| 9.6824 | 6.808 |
| 9.68626 | 6.821 |
| 9.69012 | 6.835 |
| 9.69398 | 6.85 |
| 9.69784 | 6.867 |
| 9.7017 | 6.883 |
| 9.70556 | 6.899 |
| 9.70942 | 6.915 |
| 9.713280000000001 | 6.929 |
| 9.717139999999999 | 6.943 |
| 9.72101 | 6.956 |
| 9.724870000000001 | 6.97 |
| 9.728729999999999 | 6.984 |
| 9.73259 | 6.999 |
| 9.736450000000001 | 7.015 |
| 9.74031 | 7.032 |
| 9.74417 | 7.049 |
| 9.74803 | 7.067 |
| 9.75189 | 7.085 |
| 9.75575 | 7.103 |
| 9.75961 | 7.117 |
| 9.76347 | 7.131 |
| 9.76733 | 7.143 |
| 9.77119 | 7.154 |
| 9.775049999999998 | 7.165 |
| 9.77891 | 7.179 |
| 9.782770000000001 | 7.193 |
| 9.78664 | 7.21 |
| 9.7905 | 7.228 |
| 9.794360000000001 | 7.246 |
| 9.798219999999999 | 7.263 |
| 9.80208 | 7.28 |
| 9.80594 | 7.292 |
| 9.8098 | 7.304 |
| 9.81366 | 7.316 |
| 9.81752 | 7.328 |
| 9.82138 | 7.34 |
| 9.825239999999999 | 7.355 |
| 9.8291 | 7.371 |
| 9.83296 | 7.388 |
| 9.83682 | 7.406 |
| 9.84068 | 7.424 |
| 9.84454 | 7.44 |
| 9.84841 | 7.457 |
| 9.85227 | 7.472 |
| 9.856129999999999 | 7.488 |
| 9.85999 | 7.502 |
| 9.863850000000001 | 7.516 |
| 9.867709999999999 | 7.531 |
| 9.87157 | 7.545 |
| 9.87543 | 7.559 |
| 9.879290000000001 | 7.573 |
| 9.883149999999999 | 7.588 |
| 9.88701 | 7.602 |
| 9.890870000000001 | 7.617 |
| 9.89473 | 7.631 |
| 9.89859 | 7.646 |
| 9.90245 | 7.661 |
| 9.90631 | 7.675 |
| 9.91017 | 7.69 |
| 9.914040000000002 | 7.704 |
| 9.9179 | 7.717 |
| 9.92176 | 7.731 |
| 9.92562 | 7.744 |
| 9.92948 | 7.757 |
| 9.93334 | 7.771 |
| 9.9372 | 7.784 |
| 9.94106 | 7.798 |
| 9.94492 | 7.812 |
| 9.948780000000001 | 7.828 |
| 9.952639999999999 | 7.844 |
| 9.9565 | 7.863 |
| 9.960360000000001 | 7.882 |
| 9.96422 | 7.901 |
| 9.96808 | 7.919 |
| 9.97194 | 7.937 |
| 9.97581 | 7.95 |
| 9.97967 | 7.963 |
| 9.98353 | 7.975 |
| 9.98739 | 7.985 |
| 9.99125 | 7.995 |
| 9.99511 | 8.008 |
| 9.99897 | 8.02 |
| 10.002799999999999 | 8.035 |
| 10.0067 | 8.052 |
| 10.0106 | 8.07 |
| 10.0144 | 8.089 |
| 10.0183 | 8.108 |
| 10.0221 | 8.127 |
| 10.026 | 8.145 |
| 10.0299 | 8.163 |
| 10.033700000000001 | 8.179 |
| 10.037600000000001 | 8.195 |
| 10.0414 | 8.209 |
| 10.0453 | 8.221 |
| 10.0492 | 8.234 |
| 10.053 | 8.245 |
| 10.056899999999999 | 8.256 |
| 10.0607 | 8.268 |
| 10.0646 | 8.281 |
| 10.0685 | 8.294 |
| 10.072299999999998 | 8.312 |
| 10.0762 | 8.33 |
| 10.08 | 8.349 |
| 10.0839 | 8.369 |
| 10.0878 | 8.388 |
| 10.0916 | 8.405 |
| 10.0955 | 8.421 |
| 10.0993 | 8.435 |
| 10.103200000000001 | 8.446 |
| 10.1071 | 8.456 |
| 10.110899999999999 | 8.467 |
| 10.114799999999999 | 8.478 |
| 10.1186 | 8.489 |
| 10.1225 | 8.505 |
| 10.1264 | 8.52 |
| 10.1302 | 8.537 |
| 10.1341 | 8.556 |
| 10.138 | 8.574 |
| 10.1418 | 8.592 |
| 10.145700000000001 | 8.611 |
| 10.1495 | 8.628 |
| 10.1534 | 8.643 |
| 10.1573 | 8.659 |
| 10.161100000000001 | 8.672 |
| 10.165 | 8.684 |
| 10.1688 | 8.696 |
| 10.1727 | 8.708 |
| 10.1766 | 8.719 |
| 10.180399999999999 | 8.731 |
| 10.184299999999999 | 8.744 |
| 10.1881 | 8.756 |
| 10.192 | 8.77 |
| 10.1959 | 8.784 |
| 10.1997 | 8.8 |
| 10.2036 | 8.816 |
| 10.2074 | 8.832 |
| 10.2113 | 8.849 |
| 10.215200000000001 | 8.867 |
| 10.219 | 8.884 |
| 10.2229 | 8.903 |
| 10.226700000000001 | 8.921 |
| 10.2306 | 8.94 |
| 10.2345 | 8.958 |
| 10.238299999999999 | 8.977 |
| 10.2422 | 8.994 |
| 10.246 | 9.011 |
| 10.2499 | 9.026 |
| 10.2538 | 9.04 |
| 10.2576 | 9.054 |
| 10.2615 | 9.067 |
| 10.2654 | 9.079 |
| 10.269200000000001 | 9.091 |
| 10.273100000000001 | 9.104 |
| 10.2769 | 9.117 |
| 10.2808 | 9.131 |
| 10.2847 | 9.146 |
| 10.2885 | 9.161 |
| 10.292399999999999 | 9.178 |
| 10.2962 | 9.194 |
| 10.3001 | 9.21 |
| 10.304 | 9.226 |
| 10.307799999999999 | 9.242 |
| 10.3117 | 9.256 |
| 10.3155 | 9.27 |
| 10.3194 | 9.283 |
| 10.3233 | 9.294 |
| 10.3271 | 9.305 |
| 10.331 | 9.316 |
| 10.3348 | 9.328 |
| 10.338700000000001 | 9.339 |
| 10.342600000000001 | 9.353 |
| 10.3464 | 9.367 |
| 10.350299999999999 | 9.382 |
| 10.3541 | 9.402 |
| 10.358 | 9.421 |
| 10.3619 | 9.441 |
| 10.3657 | 9.461 |
| 10.3696 | 9.482 |
| 10.3734 | 9.499 |
| 10.3773 | 9.515 |
| 10.381200000000002 | 9.531 |
| 10.385 | 9.543 |
| 10.3889 | 9.554 |
| 10.3928 | 9.566 |
| 10.396600000000001 | 9.578 |
| 10.4005 | 9.59 |
| 10.4043 | 9.604 |
| 10.4082 | 9.619 |
| 10.4121 | 9.634 |
| 10.415899999999999 | 9.652 |
| 10.419799999999999 | 9.67 |
| 10.4236 | 9.688 |
| 10.4275 | 9.705 |
| 10.4314 | 9.722 |
| 10.4352 | 9.739 |
| 10.4391 | 9.755 |
| 10.4429 | 9.771 |
| 10.4468 | 9.787 |
| 10.450700000000001 | 9.802 |
| 10.4545 | 9.818 |
| 10.4584 | 9.834 |
| 10.462200000000001 | 9.849 |
| 10.4661 | 9.865 |
| 10.47 | 9.878 |
| 10.473799999999999 | 9.892 |
| 10.4777 | 9.905 |
| 10.4815 | 9.917 |
| 10.4854 | 9.929 |
| 10.4893 | 9.941 |
| 10.4931 | 9.953 |
| 10.497 | 9.966 |
| 10.5008 | 9.98 |
| 10.504700000000001 | 9.995 |
| 10.5086 | 10.01 |
| 10.5124 | 10.026 |
| 10.5163 | 10.041 |
| 10.5202 | 10.056 |
| 10.524 | 10.069 |
| 10.527899999999999 | 10.082 |
| 10.5317 | 10.094 |
| 10.5356 | 10.105 |
| 10.5395 | 10.116 |
| 10.543299999999999 | 10.128 |
| 10.5472 | 10.141 |
| 10.551 | 10.154 |
| 10.5549 | 10.169 |
| 10.5588 | 10.184 |
| 10.5626 | 10.2 |
| 10.5665 | 10.215 |
| 10.5703 | 10.231 |
| 10.574200000000001 | 10.246 |
| 10.578100000000001 | 10.262 |
| 10.5819 | 10.277 |
| 10.585799999999999 | 10.293 |
| 10.5896 | 10.309 |
| 10.5935 | 10.324 |
| 10.5974 | 10.34 |
| 10.6012 | 10.355 |
| 10.6051 | 10.37 |
| 10.6089 | 10.385 |
| 10.6128 | 10.399 |
| 10.616700000000002 | 10.412 |
| 10.6205 | 10.426 |
| 10.6244 | 10.439 |
| 10.628200000000001 | 10.453 |
| 10.632100000000001 | 10.466 |
| 10.636 | 10.48 |
| 10.6398 | 10.495 |
| 10.6437 | 10.51 |
| 10.6476 | 10.524 |
| 10.651399999999999 | 10.539 |
| 10.655299999999999 | 10.554 |
| 10.6591 | 10.568 |
| 10.663 | 10.581 |
| 10.6669 | 10.595 |
| 10.6707 | 10.608 |
| 10.6746 | 10.62 |
| 10.6784 | 10.633 |
| 10.6823 | 10.645 |
| 10.686200000000001 | 10.659 |
| 10.69 | 10.672 |
| 10.6939 | 10.686 |
| 10.697700000000001 | 10.701 |
| 10.701600000000001 | 10.716 |
| 10.7055 | 10.731 |
| 10.709299999999999 | 10.746 |
| 10.7132 | 10.761 |
| 10.717 | 10.775 |
| 10.7209 | 10.788 |
| 10.7248 | 10.801 |
| 10.7286 | 10.813 |
| 10.7325 | 10.824 |
| 10.7363 | 10.835 |
| 10.740200000000002 | 10.847 |
| 10.7441 | 10.858 |
| 10.7479 | 10.87 |
| 10.7518 | 10.882 |
| 10.755600000000001 | 10.895 |
| 10.7595 | 10.908 |
| 10.763399999999999 | 10.922 |
| 10.7672 | 10.935 |
| 10.7711 | 10.948 |
| 10.775 | 10.96 |
| 10.778799999999999 | 10.972 |
| 10.7827 | 10.984 |
| 10.7865 | 10.996 |
| 10.7904 | 11.007 |
| 10.7943 | 11.019 |
| 10.7981 | 11.03 |
| 10.802 | 11.041 |
| 10.8058 | 11.051 |
| 10.809700000000001 | 11.06 |
| 10.813600000000001 | 11.07 |
| 10.8174 | 11.079 |
| 10.821299999999999 | 11.089 |
| 10.8251 | 11.098 |
| 10.829 | 11.109 |
| 10.8329 | 11.12 |
| 10.8367 | 11.131 |
| 10.8406 | 11.142 |
| 10.8444 | 11.152 |
| 10.8483 | 11.163 |
| 10.8522 | 11.173 |
| 10.856 | 11.183 |
| 10.8599 | 11.193 |
| 10.863700000000001 | 11.204 |
| 10.8676 | 11.215 |
| 10.8715 | 11.227 |
| 10.8753 | 11.24 |
| 10.8792 | 11.254 |
| 10.883 | 11.268 |
| 10.886899999999999 | 11.282 |
| 10.890799999999999 | 11.298 |
| 10.8946 | 11.313 |
| 10.8985 | 11.329 |
| 10.9024 | 11.345 |
| 10.9062 | 11.361 |
| 10.9101 | 11.376 |
| 10.9139 | 11.392 |
| 10.9178 | 11.407 |
| 10.921700000000001 | 11.421 |
| 10.9255 | 11.436 |
| 10.9294 | 11.45 |
| 10.933200000000001 | 11.464 |
| 10.937100000000001 | 11.478 |
| 10.941 | 11.492 |
| 10.944799999999999 | 11.506 |
| 10.9487 | 11.519 |
| 10.9525 | 11.533 |
| 10.9564 | 11.546 |
| 10.9603 | 11.558 |
| 10.9641 | 11.571 |
| 10.968 | 11.584 |
| 10.9718 | 11.598 |
| 10.975700000000002 | 11.612 |
| 10.9796 | 11.627 |
| 10.9834 | 11.642 |
| 10.9873 | 11.658 |
| 10.991100000000001 | 11.674 |
| 10.995 | 11.69 |
| 10.998899999999999 | 11.706 |
| 11.0027 | 11.721 |
| 11.0066 | 11.736 |
| 11.010399999999999 | 11.751 |
| 11.014299999999999 | 11.765 |
| 11.0182 | 11.778 |
| 11.022 | 11.792 |
| 11.0259 | 11.805 |
| 11.0298 | 11.818 |
| 11.0336 | 11.831 |
| 11.0375 | 11.843 |
| 11.0413 | 11.854 |
| 11.045200000000001 | 11.865 |
| 11.049100000000001 | 11.875 |
| 11.0529 | 11.884 |
| 11.056799999999999 | 11.894 |
| 11.0606 | 11.903 |
| 11.0645 | 11.912 |
| 11.0684 | 11.922 |
| 11.0722 | 11.933 |
| 11.0761 | 11.945 |
| 11.0799 | 11.956 |
| 11.0838 | 11.97 |
| 11.0877 | 11.985 |
| 11.0915 | 11.999 |
| 11.0954 | 12.014 |
| 11.099200000000002 | 12.03 |
| 11.1031 | 12.045 |
| 11.107 | 12.06 |
| 11.1108 | 12.076 |
| 11.114700000000001 | 12.091 |
| 11.1185 | 12.106 |
| 11.122399999999999 | 12.121 |
| 11.126299999999999 | 12.136 |
| 11.1301 | 12.15 |
| 11.134 | 12.164 |
| 11.137799999999999 | 12.179 |
| 11.1417 | 12.193 |
| 11.1456 | 12.207 |
| 11.1494 | 12.221 |
| 11.1533 | 12.235 |
| 11.157200000000001 | 12.248 |
| 11.161 | 12.262 |
| 11.1649 | 12.275 |
| 11.168700000000001 | 12.287 |
| 11.172600000000001 | 12.3 |
| 11.1765 | 12.312 |
| 11.180299999999999 | 12.322 |
| 11.1842 | 12.332 |
| 11.188 | 12.343 |
| 11.1919 | 12.353 |
| 11.195799999999998 | 12.364 |
| 11.1996 | 12.375 |
| 11.2035 | 12.389 |
| 11.2073 | 12.403 |
| 11.211200000000002 | 12.417 |
| 11.2151 | 12.433 |
| 11.2189 | 12.45 |
| 11.2228 | 12.467 |
| 11.226600000000001 | 12.485 |
| 11.2305 | 12.502 |
| 11.234399999999999 | 12.52 |
| 11.2382 | 12.538 |
| 11.2421 | 12.554 |
| 11.245899999999999 | 12.571 |
| 11.249799999999999 | 12.587 |
| 11.2537 | 12.601 |
| 11.2575 | 12.615 |
| 11.2614 | 12.629 |
| 11.2652 | 12.641 |
| 11.2691 | 12.653 |
| 11.273 | 12.664 |
| 11.2768 | 12.676 |
| 11.280700000000001 | 12.688 |
| 11.284600000000001 | 12.7 |
| 11.2884 | 12.712 |
| 11.2923 | 12.724 |
| 11.296100000000001 | 12.736 |
| 11.3 | 12.747 |
| 11.3039 | 12.758 |
| 11.3077 | 12.769 |
| 11.3116 | 12.779 |
| 11.3154 | 12.79 |
| 11.3193 | 12.801 |
| 11.3232 | 12.812 |
| 11.327 | 12.825 |
| 11.3309 | 12.838 |
| 11.334700000000002 | 12.852 |
| 11.3386 | 12.866 |
| 11.3425 | 12.881 |
| 11.3463 | 12.896 |
| 11.350200000000001 | 12.91 |
| 11.354 | 12.924 |
| 11.357899999999999 | 12.938 |
| 11.361799999999999 | 12.95 |
| 11.3656 | 12.961 |
| 11.3695 | 12.972 |
| 11.373299999999999 | 12.981 |
| 11.3772 | 12.99 |
| 11.3811 | 12.999 |
| 11.3849 | 13.008 |
| 11.3888 | 13.018 |
| 11.3926 | 13.029 |
| 11.3965 | 13.039 |
| 11.4004 | 13.054 |
| 11.404200000000001 | 13.069 |
| 11.408100000000001 | 13.083 |
| 11.412 | 13.1 |
| 11.415799999999999 | 13.118 |
| 11.4197 | 13.135 |
| 11.4235 | 13.152 |
| 11.4274 | 13.168 |
| 11.431299999999998 | 13.184 |
| 11.4351 | 13.2 |
| 11.439 | 13.212 |
| 11.4428 | 13.225 |
| 11.4467 | 13.238 |
| 11.4506 | 13.248 |
| 11.4544 | 13.259 |
| 11.4583 | 13.269 |
| 11.4621 | 13.279 |
| 11.466 | 13.288 |
| 11.469899999999999 | 13.297 |
| 11.473700000000001 | 13.307 |
| 11.4776 | 13.318 |
| 11.481399999999999 | 13.328 |
| 11.485299999999999 | 13.339 |
| 11.4892 | 13.351 |
| 11.493 | 13.364 |
| 11.4969 | 13.377 |
| 11.5007 | 13.389 |
| 11.5046 | 13.402 |
| 11.5085 | 13.415 |
| 11.5123 | 13.426 |
| 11.516200000000001 | 13.436 |
| 11.52 | 13.446 |
| 11.5239 | 13.456 |
| 11.5278 | 13.464 |
| 11.531600000000001 | 13.473 |
| 11.5355 | 13.481 |
| 11.539399999999999 | 13.491 |
| 11.5432 | 13.501 |
| 11.5471 | 13.511 |
| 11.5509 | 13.522 |
| 11.554799999999998 | 13.535 |
| 11.5587 | 13.548 |
| 11.5625 | 13.561 |
| 11.5664 | 13.575 |
| 11.570200000000002 | 13.59 |
| 11.5741 | 13.605 |
| 11.578 | 13.62 |
| 11.5818 | 13.635 |
| 11.585700000000001 | 13.651 |
| 11.5895 | 13.666 |
| 11.593399999999999 | 13.681 |
| 11.597299999999999 | 13.696 |
| 11.6011 | 13.711 |
| 11.605 | 13.724 |
| 11.608799999999999 | 13.737 |
| 11.6127 | 13.751 |
| 11.6166 | 13.762 |
| 11.6204 | 13.772 |
| 11.6243 | 13.783 |
| 11.6281 | 13.793 |
| 11.632 | 13.802 |
| 11.6359 | 13.812 |
| 11.639700000000001 | 13.821 |
| 11.643600000000001 | 13.833 |
| 11.6474 | 13.844 |
| 11.651299999999999 | 13.856 |
| 11.6552 | 13.868 |
| 11.659 | 13.88 |
| 11.6629 | 13.892 |
| 11.666799999999999 | 13.904 |
| 11.6706 | 13.915 |
| 11.6745 | 13.925 |
| 11.6783 | 13.936 |
| 11.6822 | 13.946 |
| 11.6861 | 13.957 |
| 11.6899 | 13.967 |
| 11.6938 | 13.978 |
| 11.6976 | 13.99 |
| 11.7015 | 14.003 |
| 11.7054 | 14.015 |
| 11.709200000000001 | 14.028 |
| 11.7131 | 14.041 |
| 11.716899999999999 | 14.054 |
| 11.720799999999999 | 14.067 |
| 11.7247 | 14.08 |
| 11.7285 | 14.093 |
| 11.7324 | 14.106 |
| 11.7362 | 14.12 |
| 11.7401 | 14.132 |
| 11.744 | 14.146 |
| 11.7478 | 14.158 |
| 11.751700000000001 | 14.171 |
| 11.7555 | 14.184 |
| 11.7594 | 14.196 |
| 11.7633 | 14.208 |
| 11.767100000000001 | 14.219 |
| 11.771 | 14.23 |
| 11.774799999999999 | 14.24 |
| 11.7787 | 14.249 |
| 11.7826 | 14.258 |
| 11.7864 | 14.268 |
| 11.790299999999998 | 14.277 |
| 11.7942 | 14.286 |
| 11.798 | 14.296 |
| 11.8019 | 14.308 |
| 11.8057 | 14.32 |
| 11.8096 | 14.333 |
| 11.8135 | 14.347 |
| 11.8173 | 14.364 |
| 11.821200000000001 | 14.381 |
| 11.825 | 14.398 |
| 11.828899999999999 | 14.416 |
| 11.832799999999999 | 14.433 |
| 11.8366 | 14.451 |
| 11.8405 | 14.468 |
| 11.844299999999999 | 14.482 |
| 11.8482 | 14.496 |
| 11.8521 | 14.51 |
| 11.8559 | 14.52 |
| 11.8598 | 14.529 |
| 11.8636 | 14.538 |
| 11.8675 | 14.547 |
| 11.8714 | 14.553 |
| 11.875200000000001 | 14.56 |
| 11.879100000000001 | 14.567 |
| 11.8829 | 14.575 |
| 11.8868 | 14.584 |
| 11.8907 | 14.593 |
| 11.8945 | 14.603 |
| 11.898399999999999 | 14.616 |
| 11.9022 | 14.63 |
| 11.9061 | 14.644 |
| 11.91 | 14.659 |
| 11.913799999999998 | 14.674 |
| 11.9177 | 14.69 |
| 11.9216 | 14.705 |
| 11.9254 | 14.718 |
| 11.9293 | 14.731 |
| 11.9331 | 14.744 |
| 11.937 | 14.755 |
| 11.9409 | 14.764 |
| 11.944700000000001 | 14.773 |
| 11.9486 | 14.782 |
| 11.952399999999999 | 14.791 |
| 11.956299999999999 | 14.799 |
| 11.9602 | 14.808 |
| 11.964 | 14.817 |
| 11.9679 | 14.828 |
| 11.9717 | 14.839 |
| 11.9756 | 14.85 |
| 11.9795 | 14.863 |
| 11.9833 | 14.876 |
| 11.987200000000001 | 14.89 |
| 11.991 | 14.904 |
| 11.9949 | 14.92 |
| 11.9988 | 14.935 |
| 12.002600000000001 | 14.95 |
| 12.0065 | 14.967 |
| 12.010299999999999 | 14.983 |
| 12.0142 | 15 |
| 12.0181 | 15.016 |
| 12.0219 | 15.031 |
| 12.025799999999998 | 15.045 |
| 12.0296 | 15.06 |
| 12.0335 | 15.073 |
| 12.0374 | 15.084 |
| 12.0412 | 15.095 |
| 12.0451 | 15.106 |
| 12.049 | 15.115 |
| 12.0528 | 15.123 |
| 12.056700000000001 | 15.131 |
| 12.0605 | 15.14 |
| 12.0644 | 15.148 |
| 12.068299999999999 | 15.156 |
| 12.0721 | 15.164 |
| 12.076 | 15.174 |
| 12.079799999999999 | 15.186 |
| 12.0837 | 15.197 |
| 12.0876 | 15.208 |
| 12.0914 | 15.223 |
| 12.0953 | 15.237 |
| 12.0991 | 15.252 |
| 12.103 | 15.266 |
| 12.1069 | 15.281 |
| 12.110700000000001 | 15.296 |
| 12.114600000000001 | 15.311 |
| 12.1184 | 15.325 |
| 12.1223 | 15.338 |
| 12.1262 | 15.351 |
| 12.13 | 15.364 |
| 12.133899999999999 | 15.376 |
| 12.1377 | 15.387 |
| 12.1416 | 15.398 |
| 12.1455 | 15.409 |
| 12.149299999999998 | 15.42 |
| 12.1532 | 15.431 |
| 12.157 | 15.442 |
| 12.1609 | 15.452 |
| 12.1648 | 15.462 |
| 12.1686 | 15.472 |
| 12.1725 | 15.481 |
| 12.1764 | 15.49 |
| 12.180200000000001 | 15.498 |
| 12.1841 | 15.505 |
| 12.187899999999999 | 15.513 |
| 12.191799999999999 | 15.521 |
| 12.1957 | 15.529 |
| 12.1995 | 15.537 |
| 12.2034 | 15.547 |
| 12.2072 | 15.557 |
| 12.2111 | 15.568 |
| 12.215 | 15.578 |
| 12.2188 | 15.591 |
| 12.222700000000001 | 15.603 |
| 12.2265 | 15.615 |
| 12.2304 | 15.628 |
| 12.2343 | 15.64 |
| 12.238100000000001 | 15.651 |
| 12.242 | 15.663 |
| 12.2458 | 15.674 |
| 12.2497 | 15.685 |
| 12.2536 | 15.696 |
| 12.2574 | 15.707 |
| 12.261299999999999 | 15.719 |
| 12.2651 | 15.732 |
| 12.269 | 15.744 |
| 12.2729 | 15.756 |
| 12.2767 | 15.77 |
| 12.2806 | 15.784 |
| 12.2844 | 15.798 |
| 12.2883 | 15.812 |
| 12.292200000000001 | 15.825 |
| 12.296 | 15.838 |
| 12.2999 | 15.851 |
| 12.303799999999999 | 15.863 |
| 12.3076 | 15.873 |
| 12.3115 | 15.884 |
| 12.315299999999999 | 15.895 |
| 12.3192 | 15.905 |
| 12.3231 | 15.914 |
| 12.3269 | 15.924 |
| 12.3308 | 15.934 |
| 12.3346 | 15.944 |
| 12.3385 | 15.955 |
| 12.3424 | 15.966 |
| 12.346200000000001 | 15.977 |
| 12.350100000000001 | 15.99 |
| 12.3539 | 16.003 |
| 12.3578 | 16.016 |
| 12.3617 | 16.029 |
| 12.3655 | 16.044 |
| 12.369399999999999 | 16.059 |
| 12.3732 | 16.074 |
| 12.3771 | 16.088 |
| 12.381 | 16.102 |
| 12.384799999999998 | 16.116 |
| 12.3887 | 16.13 |
| 12.3925 | 16.143 |
| 12.3964 | 16.155 |
| 12.4003 | 16.166 |
| 12.4041 | 16.178 |
| 12.408 | 16.188 |
| 12.4118 | 16.198 |
| 12.415700000000001 | 16.208 |
| 12.4196 | 16.218 |
| 12.423399999999999 | 16.226 |
| 12.427299999999999 | 16.235 |
| 12.4312 | 16.244 |
| 12.435 | 16.252 |
| 12.4389 | 16.261 |
| 12.4427 | 16.27 |
| 12.4466 | 16.279 |
| 12.4505 | 16.288 |
| 12.4543 | 16.299 |
| 12.458200000000001 | 16.31 |
| 12.462 | 16.321 |
| 12.4659 | 16.332 |
| 12.4698 | 16.345 |
| 12.473600000000001 | 16.358 |
| 12.4775 | 16.371 |
| 12.4813 | 16.384 |
| 12.4852 | 16.398 |
| 12.4891 | 16.412 |
| 12.492899999999999 | 16.425 |
| 12.496799999999999 | 16.438 |
| 12.5006 | 16.451 |
| 12.5045 | 16.463 |
| 12.5084 | 16.475 |
| 12.5122 | 16.487 |
| 12.5161 | 16.498 |
| 12.5199 | 16.508 |
| 12.5238 | 16.519 |
| 12.527700000000001 | 16.531 |
| 12.5315 | 16.543 |
| 12.5354 | 16.554 |
| 12.539200000000001 | 16.566 |
| 12.5431 | 16.579 |
| 12.547 | 16.592 |
| 12.550799999999999 | 16.605 |
| 12.5547 | 16.618 |
| 12.5586 | 16.63 |
| 12.5624 | 16.642 |
| 12.5663 | 16.655 |
| 12.5701 | 16.667 |
| 12.574 | 16.678 |
| 12.5779 | 16.688 |
| 12.581700000000001 | 16.698 |
| 12.585600000000001 | 16.708 |
| 12.5894 | 16.718 |
| 12.5933 | 16.727 |
| 12.5972 | 16.737 |
| 12.601 | 16.746 |
| 12.604899999999999 | 16.757 |
| 12.6087 | 16.768 |
| 12.6126 | 16.778 |
| 12.6165 | 16.789 |
| 12.620299999999999 | 16.8 |
| 12.6242 | 16.812 |
| 12.628 | 16.824 |
| 12.6319 | 16.835 |
| 12.6358 | 16.846 |
| 12.6396 | 16.857 |
| 12.6435 | 16.868 |
| 12.6473 | 16.879 |
| 12.651200000000001 | 16.888 |
| 12.655100000000001 | 16.898 |
| 12.6589 | 16.908 |
| 12.662799999999999 | 16.918 |
| 12.6666 | 16.928 |
| 12.6705 | 16.939 |
| 12.6744 | 16.949 |
| 12.6782 | 16.96 |
| 12.6821 | 16.973 |
| 12.686 | 16.985 |
| 12.6898 | 16.998 |
| 12.693700000000002 | 17.011 |
| 12.6975 | 17.025 |
| 12.7014 | 17.038 |
| 12.7053 | 17.052 |
| 12.709100000000001 | 17.066 |
| 12.713 | 17.08 |
| 12.7168 | 17.093 |
| 12.7207 | 17.106 |
| 12.7246 | 17.12 |
| 12.728399999999999 | 17.132 |
| 12.732299999999999 | 17.145 |
| 12.7361 | 17.157 |
| 12.74 | 17.17 |
| 12.7439 | 17.182 |
| 12.7477 | 17.194 |
| 12.7516 | 17.206 |
| 12.7554 | 17.219 |
| 12.7593 | 17.231 |
| 12.763200000000001 | 17.243 |
| 12.767 | 17.255 |
| 12.7709 | 17.267 |
| 12.774700000000001 | 17.278 |
| 12.7786 | 17.29 |
| 12.7825 | 17.302 |
| 12.786299999999999 | 17.313 |
| 12.7902 | 17.325 |
| 12.794 | 17.338 |
| 12.7979 | 17.35 |
| 12.8018 | 17.362 |
| 12.8056 | 17.375 |
| 12.8095 | 17.388 |
| 12.8134 | 17.401 |
| 12.817200000000001 | 17.414 |
| 12.8211 | 17.426 |
| 12.8249 | 17.438 |
| 12.8288 | 17.45 |
| 12.8327 | 17.462 |
| 12.8365 | 17.473 |
| 12.840399999999999 | 17.484 |
| 12.8442 | 17.494 |
| 12.8481 | 17.504 |
| 12.852 | 17.514 |
| 12.855799999999999 | 17.524 |
| 12.8597 | 17.533 |
| 12.8635 | 17.543 |
| 12.8674 | 17.552 |
| 12.8713 | 17.562 |
| 12.8751 | 17.571 |
| 12.879 | 17.581 |
| 12.8828 | 17.59 |
| 12.886700000000001 | 17.6 |
| 12.890600000000001 | 17.609 |
| 12.8944 | 17.619 |
| 12.898299999999999 | 17.628 |
| 12.9021 | 17.638 |
| 12.906 | 17.647 |
| 12.9099 | 17.657 |
| 12.9137 | 17.666 |
| 12.9176 | 17.676 |
| 12.9214 | 17.685 |
| 12.9253 | 17.694 |
| 12.929200000000002 | 17.703 |
| 12.933 | 17.714 |
| 12.9369 | 17.726 |
| 12.9408 | 17.738 |
| 12.944600000000001 | 17.75 |
| 12.9485 | 17.763 |
| 12.9523 | 17.78 |
| 12.9562 | 17.798 |
| 12.9601 | 17.815 |
| 12.963899999999999 | 17.832 |
| 12.967799999999999 | 17.85 |
| 12.9716 | 17.868 |
| 12.9755 | 17.886 |
| 12.9794 | 17.904 |
| 12.9832 | 17.917 |
| 12.9871 | 17.93 |
| 12.9909 | 17.942 |
| 12.9948 | 17.955 |
| 12.998700000000001 | 17.965 |
| 13.0025 | 17.974 |
| 13.0064 | 17.983 |
| 13.010200000000001 | 17.992 |
| 13.014100000000001 | 18.002 |
| 13.018 | 18.013 |
| 13.021799999999999 | 18.023 |
| 13.0257 | 18.034 |
| 13.0295 | 18.044 |
| 13.0334 | 18.056 |
| 13.0373 | 18.067 |
| 13.0411 | 18.079 |
| 13.045 | 18.09 |
| 13.0488 | 18.1 |
| 13.052700000000002 | 18.11 |
| 13.0566 | 18.12 |
| 13.0604 | 18.13 |
| 13.0643 | 18.139 |
| 13.068200000000001 | 18.149 |
| 13.072 | 18.158 |
| 13.075899999999999 | 18.167 |
| 13.0797 | 18.177 |
| 13.0836 | 18.188 |
| 13.0875 | 18.198 |
| 13.091299999999999 | 18.209 |
| 13.0952 | 18.219 |
| 13.099 | 18.231 |
| 13.1029 | 18.244 |
| 13.1068 | 18.256 |
| 13.1106 | 18.268 |
| 13.1145 | 18.282 |
| 13.1183 | 18.296 |
| 13.122200000000001 | 18.31 |
| 13.126100000000001 | 18.324 |
| 13.1299 | 18.339 |
| 13.133799999999999 | 18.355 |
| 13.1376 | 18.371 |
| 13.1415 | 18.387 |
| 13.1454 | 18.403 |
| 13.1492 | 18.419 |
| 13.1531 | 18.434 |
| 13.1569 | 18.45 |
| 13.1608 | 18.466 |
| 13.1647 | 18.477 |
| 13.1685 | 18.488 |
| 13.1724 | 18.499 |
| 13.176200000000001 | 18.51 |
| 13.1801 | 18.517 |
| 13.184 | 18.522 |
| 13.1878 | 18.526 |
| 13.1917 | 18.531 |
| 13.1956 | 18.535 |
| 13.199399999999999 | 18.538 |
| 13.203299999999999 | 18.541 |
| 13.2071 | 18.543 |
| 13.211 | 18.546 |
| 13.2149 | 18.554 |
| 13.2187 | 18.562 |
| 13.2226 | 18.569 |
| 13.2264 | 18.577 |
| 13.2303 | 18.588 |
| 13.234200000000001 | 18.602 |
| 13.238 | 18.616 |
| 13.2419 | 18.63 |
| 13.245700000000001 | 18.643 |
| 13.249600000000001 | 18.658 |
| 13.2535 | 18.673 |
| 13.257299999999999 | 18.687 |
| 13.2612 | 18.702 |
| 13.265 | 18.715 |
| 13.2689 | 18.727 |
| 13.2728 | 18.739 |
| 13.2766 | 18.751 |
| 13.2805 | 18.762 |
| 13.2843 | 18.772 |
| 13.288200000000002 | 18.783 |
| 13.2921 | 18.793 |
| 13.2959 | 18.804 |
| 13.2998 | 18.814 |
| 13.303600000000001 | 18.825 |
| 13.3075 | 18.836 |
| 13.311399999999999 | 18.847 |
| 13.3152 | 18.858 |
| 13.3191 | 18.869 |
| 13.323 | 18.88 |
| 13.326799999999999 | 18.891 |
| 13.3307 | 18.902 |
| 13.3345 | 18.912 |
| 13.3384 | 18.923 |
| 13.3423 | 18.934 |
| 13.3461 | 18.945 |
| 13.35 | 18.956 |
| 13.3538 | 18.967 |
| 13.357700000000001 | 18.978 |
| 13.361600000000001 | 18.989 |
| 13.3654 | 19 |
| 13.369299999999999 | 19.011 |
| 13.3731 | 19.022 |
| 13.377 | 19.032 |
| 13.3809 | 19.043 |
| 13.3847 | 19.053 |
| 13.3886 | 19.062 |
| 13.3924 | 19.072 |
| 13.3963 | 19.081 |
| 13.4002 | 19.09 |
| 13.404 | 19.098 |
| 13.4079 | 19.107 |
| 13.411700000000002 | 19.115 |
| 13.4156 | 19.124 |
| 13.4195 | 19.134 |
| 13.4233 | 19.143 |
| 13.427200000000001 | 19.153 |
| 13.431 | 19.163 |
| 13.434899999999999 | 19.174 |
| 13.438799999999999 | 19.186 |
| 13.4426 | 19.197 |
| 13.4465 | 19.209 |
| 13.4504 | 19.221 |
| 13.4542 | 19.233 |
| 13.4581 | 19.246 |
| 13.4619 | 19.258 |
| 13.4658 | 19.27 |
| 13.469700000000001 | 19.282 |
| 13.4735 | 19.293 |
| 13.4774 | 19.304 |
| 13.481200000000001 | 19.315 |
| 13.485100000000001 | 19.327 |
| 13.489 | 19.338 |
| 13.492799999999999 | 19.348 |
| 13.4967 | 19.359 |
| 13.5005 | 19.37 |
| 13.5044 | 19.381 |
| 13.508299999999998 | 19.392 |
| 13.5121 | 19.403 |
| 13.516 | 19.414 |
| 13.5198 | 19.425 |
| 13.523700000000002 | 19.436 |
| 13.5276 | 19.447 |
| 13.5314 | 19.458 |
| 13.5353 | 19.468 |
| 13.539100000000001 | 19.479 |
| 13.543 | 19.488 |
| 13.546899999999999 | 19.497 |
| 13.5507 | 19.507 |
| 13.5546 | 19.516 |
| 13.558399999999999 | 19.525 |
| 13.562299999999999 | 19.533 |
| 13.5662 | 19.541 |
| 13.57 | 19.549 |
| 13.5739 | 19.557 |
| 13.5778 | 19.565 |
| 13.5816 | 19.573 |
| 13.5855 | 19.581 |
| 13.5893 | 19.59 |
| 13.593200000000001 | 19.598 |
| 13.597100000000001 | 19.608 |
| 13.6009 | 19.618 |
| 13.6048 | 19.628 |
| 13.608600000000001 | 19.638 |
| 13.6125 | 19.648 |
| 13.6164 | 19.659 |
| 13.6202 | 19.67 |
| 13.6241 | 19.681 |
| 13.6279 | 19.691 |
| 13.6318 | 19.701 |
| 13.6357 | 19.71 |
| 13.6395 | 19.72 |
| 13.6434 | 19.729 |
| 13.647200000000002 | 19.738 |
| 13.6511 | 19.746 |
| 13.655 | 19.755 |
| 13.6588 | 19.763 |
| 13.662700000000001 | 19.771 |
| 13.6665 | 19.781 |
| 13.670399999999999 | 19.79 |
| 13.674299999999999 | 19.8 |
| 13.6781 | 19.809 |
| 13.682 | 19.819 |
| 13.685799999999999 | 19.83 |
| 13.6897 | 19.84 |
| 13.6936 | 19.851 |
| 13.6974 | 19.862 |
| 13.7013 | 19.873 |
| 13.705200000000001 | 19.884 |
| 13.709 | 19.895 |
| 13.7129 | 19.905 |
| 13.716700000000001 | 19.916 |
| 13.720600000000001 | 19.927 |
| 13.7245 | 19.938 |
| 13.728299999999999 | 19.949 |
| 13.7322 | 19.96 |
| 13.736 | 19.97 |
| 13.7399 | 19.982 |
| 13.743799999999998 | 19.993 |
| 13.7476 | 20.005 |
| 13.7515 | 20.016 |
| 13.7553 | 20.028 |
| 13.7592 | 20.038 |
| 13.7631 | 20.049 |
| 13.7669 | 20.06 |
| 13.7708 | 20.07 |
| 13.7746 | 20.08 |
| 13.7785 | 20.09 |
| 13.782399999999999 | 20.099 |
| 13.786200000000001 | 20.108 |
| 13.7901 | 20.118 |
| 13.793899999999999 | 20.127 |
| 13.797799999999999 | 20.136 |
| 13.8017 | 20.145 |
| 13.8055 | 20.154 |
| 13.8094 | 20.162 |
| 13.8132 | 20.172 |
| 13.8171 | 20.18 |
| 13.821 | 20.19 |
| 13.8248 | 20.199 |
| 13.828700000000001 | 20.207 |
| 13.832600000000001 | 20.216 |
| 13.8364 | 20.225 |
| 13.8403 | 20.233 |
| 13.844100000000001 | 20.242 |
| 13.848 | 20.25 |
| 13.851899999999999 | 20.258 |
| 13.8557 | 20.267 |
| 13.8596 | 20.276 |
| 13.8634 | 20.284 |
| 13.867299999999998 | 20.293 |
| 13.8712 | 20.301 |
| 13.875 | 20.31 |
| 13.8789 | 20.319 |
| 13.882700000000002 | 20.328 |
| 13.8866 | 20.335 |
| 13.8905 | 20.343 |
| 13.8943 | 20.351 |
| 13.898200000000001 | 20.359 |
| 13.902 | 20.367 |
| 13.905899999999999 | 20.374 |
| 13.909799999999999 | 20.381 |
| 13.9136 | 20.388 |
| 13.9175 | 20.396 |
| 13.921299999999999 | 20.403 |
| 13.9252 | 20.412 |
| 13.9291 | 20.42 |
| 13.9329 | 20.428 |
| 13.9368 | 20.437 |
| 13.9406 | 20.446 |
| 13.9445 | 20.456 |
| 13.9484 | 20.467 |
| 13.952200000000001 | 20.477 |
| 13.956100000000001 | 20.487 |
| 13.96 | 20.498 |
| 13.963799999999999 | 20.509 |
| 13.9677 | 20.521 |
| 13.9715 | 20.532 |
| 13.9754 | 20.543 |
| 13.979299999999999 | 20.554 |
| 13.9831 | 20.564 |
| 13.987 | 20.575 |
| 13.9908 | 20.585 |
| 13.9947 | 20.596 |
| 13.9986 | 20.606 |
| 14.0024 | 20.616 |
| 14.0063 | 20.627 |
| 14.0101 | 20.637 |
| 14.014 | 20.647 |
| 14.0179 | 20.659 |
| 14.021700000000001 | 20.671 |
| 14.0256 | 20.684 |
| 14.029399999999999 | 20.696 |
| 14.033299999999999 | 20.708 |
| 14.0372 | 20.721 |
| 14.041 | 20.734 |
| 14.0449 | 20.746 |
| 14.0487 | 20.759 |
| 14.0526 | 20.772 |
| 14.0565 | 20.781 |
| 14.0603 | 20.791 |
| 14.064200000000001 | 20.8 |
| 14.068 | 20.81 |
| 14.0719 | 20.819 |
| 14.0758 | 20.825 |
| 14.079600000000001 | 20.831 |
| 14.0835 | 20.837 |
| 14.087399999999999 | 20.843 |
| 14.0912 | 20.849 |
| 14.0951 | 20.853 |
| 14.0989 | 20.858 |
| 14.102799999999998 | 20.862 |
| 14.1067 | 20.866 |
| 14.1105 | 20.87 |
| 14.1144 | 20.875 |
| 14.1182 | 20.879 |
| 14.1221 | 20.883 |
| 14.126 | 20.887 |
| 14.1298 | 20.891 |
| 14.133700000000001 | 20.896 |
| 14.1375 | 20.9 |
| 14.141399999999999 | 20.904 |
| 14.145299999999999 | 20.909 |
| 14.1491 | 20.913 |
| 14.153 | 20.919 |
| 14.156799999999999 | 20.924 |
| 14.1607 | 20.93 |
| 14.1646 | 20.935 |
| 14.1684 | 20.94 |
| 14.1723 | 20.947 |
| 14.1761 | 20.954 |
| 14.18 | 20.962 |
| 14.1839 | 20.968 |
| 14.187700000000001 | 20.976 |
| 14.191600000000001 | 20.983 |
| 14.1954 | 20.991 |
| 14.1993 | 20.999 |
| 14.2032 | 21.007 |
| 14.207 | 21.015 |
| 14.210899999999999 | 21.023 |
| 14.214799999999999 | 21.032 |
| 14.2186 | 21.04 |
| 14.2225 | 21.049 |
| 14.226299999999998 | 21.057 |
| 14.2302 | 21.068 |
| 14.2341 | 21.079 |
| 14.2379 | 21.089 |
| 14.2418 | 21.1 |
| 14.2456 | 21.11 |
| 14.2495 | 21.123 |
| 14.2534 | 21.135 |
| 14.257200000000001 | 21.147 |
| 14.2611 | 21.16 |
| 14.264899999999999 | 21.172 |
| 14.268799999999999 | 21.184 |
| 14.2727 | 21.196 |
| 14.2765 | 21.208 |
| 14.2804 | 21.22 |
| 14.2842 | 21.232 |
| 14.2881 | 21.242 |
| 14.292 | 21.252 |
| 14.2958 | 21.262 |
| 14.299700000000001 | 21.272 |
| 14.3035 | 21.282 |
| 14.3074 | 21.289 |
| 14.3113 | 21.296 |
| 14.315100000000001 | 21.303 |
| 14.319 | 21.309 |
| 14.322799999999999 | 21.316 |
| 14.3267 | 21.321 |
| 14.3306 | 21.325 |
| 14.3344 | 21.329 |
| 14.338299999999998 | 21.333 |
| 14.3422 | 21.337 |
| 14.346 | 21.341 |
| 14.3499 | 21.346 |
| 14.3537 | 21.351 |
| 14.3576 | 21.357 |
| 14.3615 | 21.362 |
| 14.3653 | 21.368 |
| 14.369200000000001 | 21.377 |
| 14.373 | 21.386 |
| 14.3769 | 21.395 |
| 14.380799999999999 | 21.404 |
| 14.3846 | 21.414 |
| 14.3885 | 21.425 |
| 14.392299999999999 | 21.437 |
| 14.3962 | 21.448 |
| 14.4001 | 21.46 |
| 14.4039 | 21.471 |
| 14.4078 | 21.482 |
| 14.4116 | 21.492 |
| 14.4155 | 21.503 |
| 14.4194 | 21.514 |
| 14.423200000000001 | 21.524 |
| 14.427100000000001 | 21.533 |
| 14.4309 | 21.542 |
| 14.4348 | 21.551 |
| 14.4387 | 21.56 |
| 14.4425 | 21.569 |
| 14.446399999999999 | 21.578 |
| 14.4502 | 21.586 |
| 14.4541 | 21.594 |
| 14.458 | 21.602 |
| 14.461799999999998 | 21.61 |
| 14.4657 | 21.618 |
| 14.4696 | 21.625 |
| 14.4734 | 21.632 |
| 14.4773 | 21.639 |
| 14.4811 | 21.646 |
| 14.485 | 21.653 |
| 14.4889 | 21.66 |
| 14.492700000000001 | 21.666 |
| 14.4966 | 21.673 |
| 14.500399999999999 | 21.679 |
| 14.504299999999999 | 21.686 |
| 14.5082 | 21.694 |
| 14.512 | 21.703 |
| 14.5159 | 21.712 |
| 14.5197 | 21.722 |
| 14.5236 | 21.731 |
| 14.5275 | 21.742 |
| 14.5313 | 21.755 |
| 14.535200000000001 | 21.768 |
| 14.539 | 21.78 |
| 14.5429 | 21.793 |
| 14.5468 | 21.806 |
| 14.550600000000001 | 21.817 |
| 14.5545 | 21.829 |
| 14.5583 | 21.841 |
| 14.5622 | 21.853 |
| 14.5661 | 21.865 |
| 14.5699 | 21.873 |
| 14.573799999999999 | 21.882 |
| 14.5776 | 21.89 |
| 14.5815 | 21.899 |
| 14.5854 | 21.907 |
| 14.5892 | 21.916 |
| 14.5931 | 21.924 |
| 14.597 | 21.933 |
| 14.6008 | 21.941 |
| 14.604700000000001 | 21.949 |
| 14.6085 | 21.959 |
| 14.6124 | 21.969 |
| 14.616299999999999 | 21.979 |
| 14.6201 | 21.989 |
| 14.624 | 21.999 |
| 14.627799999999999 | 22.009 |
| 14.6317 | 22.018 |
| 14.6356 | 22.028 |
| 14.6394 | 22.037 |
| 14.6433 | 22.047 |
| 14.6471 | 22.056 |
| 14.651 | 22.064 |
| 14.6549 | 22.072 |
| 14.658700000000001 | 22.079 |
| 14.662600000000001 | 22.087 |
| 14.6664 | 22.094 |
| 14.6703 | 22.102 |
| 14.6742 | 22.11 |
| 14.678 | 22.117 |
| 14.681899999999999 | 22.125 |
| 14.6857 | 22.132 |
| 14.6896 | 22.14 |
| 14.6935 | 22.149 |
| 14.697299999999998 | 22.158 |
| 14.7012 | 22.168 |
| 14.705 | 22.177 |
| 14.7089 | 22.187 |
| 14.7128 | 22.196 |
| 14.7166 | 22.207 |
| 14.7205 | 22.217 |
| 14.7244 | 22.227 |
| 14.728200000000001 | 22.237 |
| 14.7321 | 22.247 |
| 14.735899999999999 | 22.256 |
| 14.739799999999999 | 22.265 |
| 14.7437 | 22.274 |
| 14.7475 | 22.282 |
| 14.7514 | 22.291 |
| 14.7552 | 22.299 |
| 14.7591 | 22.307 |
| 14.763 | 22.314 |
| 14.7668 | 22.322 |
| 14.770700000000001 | 22.329 |
| 14.7745 | 22.336 |
| 14.7784 | 22.342 |
| 14.7823 | 22.348 |
| 14.786100000000001 | 22.354 |
| 14.79 | 22.36 |
| 14.7938 | 22.367 |
| 14.7977 | 22.372 |
| 14.8016 | 22.378 |
| 14.805399999999999 | 22.384 |
| 14.809299999999999 | 22.39 |
| 14.8131 | 22.395 |
| 14.817 | 22.402 |
| 14.8209 | 22.408 |
| 14.8247 | 22.415 |
| 14.8286 | 22.421 |
| 14.8324 | 22.428 |
| 14.8363 | 22.435 |
| 14.840200000000001 | 22.442 |
| 14.844 | 22.449 |
| 14.8479 | 22.456 |
| 14.851799999999999 | 22.463 |
| 14.8556 | 22.47 |
| 14.8595 | 22.478 |
| 14.863299999999999 | 22.485 |
| 14.8672 | 22.492 |
| 14.8711 | 22.499 |
| 14.8749 | 22.507 |
| 14.8788 | 22.514 |
| 14.8826 | 22.52 |
| 14.8865 | 22.526 |
| 14.8904 | 22.533 |
| 14.894200000000001 | 22.539 |
| 14.898100000000001 | 22.545 |
| 14.9019 | 22.55 |
| 14.9058 | 22.551 |
| 14.9097 | 22.552 |
| 14.9135 | 22.553 |
| 14.917399999999999 | 22.554 |
| 14.9212 | 22.556 |
| 14.9251 | 22.551 |
| 14.929 | 22.544 |
| 14.932799999999999 | 22.537 |
| 14.9367 | 22.53 |
| 14.9405 | 22.524 |
| 14.9444 | 22.517 |
| 14.9483 | 22.512 |
| 14.9521 | 22.507 |
| 14.956 | 22.501 |
| 14.9598 | 22.496 |
| 14.963700000000001 | 22.491 |
| 14.967600000000001 | 22.498 |
| 14.9714 | 22.513 |
| 14.975299999999999 | 22.528 |
| 14.9792 | 22.543 |
| 14.983 | 22.558 |
| 14.9869 | 22.574 |
| 14.9907 | 22.59 |
| 14.9946 | 22.606 |
| 14.9985 | 22.623 |
| 15.0023 | 22.639 |
| 15.006200000000002 | 22.656 |
| 15.01 | 22.669 |
| 15.0139 | 22.676 |
| 15.0178 | 22.684 |
| 15.021600000000001 | 22.692 |
| 15.0255 | 22.7 |
| 15.0293 | 22.708 |
| 15.0332 | 22.712 |
| 15.0371 | 22.715 |
| 15.040899999999999 | 22.718 |
| 15.044799999999999 | 22.721 |
| 15.0486 | 22.724 |
| 15.0525 | 22.727 |
| 15.0564 | 22.73 |
| 15.0602 | 22.733 |
| 15.0641 | 22.736 |
| 15.0679 | 22.738 |
| 15.0718 | 22.741 |
| 15.075700000000001 | 22.744 |
| 15.0795 | 22.749 |
| 15.0834 | 22.753 |
| 15.087200000000001 | 22.757 |
| 15.0911 | 22.761 |
| 15.095 | 22.765 |
| 15.098799999999999 | 22.768 |
| 15.1027 | 22.771 |
| 15.1066 | 22.774 |
| 15.1104 | 22.776 |
| 15.1143 | 22.779 |
| 15.1181 | 22.782 |
| 15.122 | 22.784 |
| 15.1259 | 22.786 |
| 15.129700000000001 | 22.787 |
| 15.1336 | 22.789 |
| 15.1374 | 22.791 |
| 15.1413 | 22.793 |
| 15.1452 | 22.796 |
| 15.149 | 22.799 |
| 15.152899999999999 | 22.803 |
| 15.1567 | 22.806 |
| 15.1606 | 22.809 |
| 15.1645 | 22.813 |
| 15.168299999999999 | 22.818 |
| 15.1722 | 22.823 |
| 15.176 | 22.828 |
| 15.1799 | 22.833 |
| 15.1838 | 22.838 |
| 15.1876 | 22.843 |
| 15.1915 | 22.848 |
| 15.1953 | 22.853 |
| 15.199200000000001 | 22.858 |
| 15.203100000000001 | 22.863 |
| 15.2069 | 22.868 |
| 15.210799999999999 | 22.872 |
| 15.2146 | 22.876 |
| 15.2185 | 22.88 |
| 15.2224 | 22.883 |
| 15.2262 | 22.887 |
| 15.2301 | 22.89 |
| 15.234 | 22.89 |
| 15.2378 | 22.891 |
| 15.241700000000002 | 22.891 |
| 15.2455 | 22.891 |
| 15.2494 | 22.892 |
| 15.2533 | 22.891 |
| 15.257100000000001 | 22.889 |
| 15.261 | 22.887 |
| 15.2648 | 22.884 |
| 15.2687 | 22.882 |
| 15.2726 | 22.88 |
| 15.276399999999999 | 22.88 |
| 15.280299999999999 | 22.882 |
| 15.2841 | 22.883 |
| 15.288 | 22.884 |
| 15.2919 | 22.886 |
| 15.2957 | 22.887 |
| 15.2996 | 22.894 |
| 15.3034 | 22.901 |
| 15.3073 | 22.909 |
| 15.311200000000001 | 22.917 |
| 15.315 | 22.924 |
| 15.3189 | 22.932 |
| 15.322700000000001 | 22.941 |
| 15.326600000000001 | 22.95 |
| 15.3305 | 22.959 |
| 15.334299999999999 | 22.969 |
| 15.3382 | 22.978 |
| 15.342 | 22.986 |
| 15.3459 | 22.992 |
| 15.3498 | 22.998 |
| 15.3536 | 23.003 |
| 15.3575 | 23.009 |
| 15.3614 | 23.014 |
| 15.365200000000002 | 23.019 |
| 15.3691 | 23.02 |
| 15.3729 | 23.021 |
| 15.3768 | 23.022 |
| 15.380700000000001 | 23.024 |
| 15.3845 | 23.025 |
| 15.388399999999999 | 23.026 |
| 15.3922 | 23.025 |
| 15.3961 | 23.024 |
| 15.4 | 23.024 |
| 15.403799999999999 | 23.023 |
| 15.4077 | 23.023 |
| 15.4115 | 23.022 |
| 15.4154 | 23.023 |
| 15.4193 | 23.023 |
| 15.4231 | 23.024 |
| 15.427 | 23.024 |
| 15.4308 | 23.024 |
| 15.434700000000001 | 23.025 |
| 15.438600000000001 | 23.027 |
| 15.4424 | 23.028 |
| 15.446299999999999 | 23.03 |
| 15.4501 | 23.031 |
| 15.454 | 23.033 |
| 15.4579 | 23.034 |
| 15.4617 | 23.035 |
| 15.4656 | 23.036 |
| 15.4694 | 23.037 |
| 15.4733 | 23.038 |
| 15.4772 | 23.038 |
| 15.481 | 23.039 |
| 15.4849 | 23.04 |
| 15.4888 | 23.04 |
| 15.4926 | 23.04 |
| 15.4965 | 23.041 |
| 15.5003 | 23.041 |
| 15.5042 | 23.043 |
| 15.5081 | 23.046 |
| 15.511899999999999 | 23.05 |
| 15.515799999999999 | 23.053 |
| 15.5196 | 23.056 |
| 15.5235 | 23.06 |
| 15.5274 | 23.065 |
| 15.5312 | 23.073 |
| 15.5351 | 23.081 |
| 15.5389 | 23.088 |
| 15.5428 | 23.096 |
| 15.546700000000001 | 23.104 |
| 15.5505 | 23.11 |
| 15.5544 | 23.115 |
| 15.558200000000001 | 23.12 |
| 15.562100000000001 | 23.125 |
| 15.566 | 23.13 |
| 15.569799999999999 | 23.135 |
| 15.5737 | 23.135 |
| 15.5775 | 23.13 |
| 15.5814 | 23.126 |
| 15.5853 | 23.121 |
| 15.5891 | 23.116 |
| 15.593 | 23.112 |
| 15.5968 | 23.105 |
| 15.600700000000002 | 23.094 |
| 15.6046 | 23.083 |
| 15.6084 | 23.072 |
| 15.6123 | 23.062 |
| 15.616200000000001 | 23.051 |
| 15.62 | 23.041 |
| 15.623899999999999 | 23.034 |
| 15.6277 | 23.026 |
| 15.6316 | 23.018 |
| 15.6355 | 23.011 |
| 15.639299999999999 | 23.003 |
| 15.6432 | 22.997 |
| 15.647 | 22.995 |
| 15.6509 | 22.994 |
| 15.6548 | 22.992 |
| 15.6586 | 22.99 |
| 15.6625 | 22.989 |
| 15.6663 | 22.987 |
| 15.670200000000001 | 22.988 |
| 15.674100000000001 | 22.989 |
| 15.6779 | 22.99 |
| 15.681799999999999 | 22.991 |
| 15.6856 | 22.992 |
| 15.6895 | 22.992 |
| 15.6934 | 22.993 |
| 15.6972 | 22.994 |
| 15.7011 | 22.995 |
| 15.7049 | 22.996 |
| 15.7088 | 22.997 |
| 15.7127 | 22.998 |
| 15.7165 | 23.001 |
| 15.7204 | 23.004 |
| 15.724200000000002 | 23.007 |
| 15.7281 | 23.01 |
| 15.732 | 23.014 |
| 15.7358 | 23.017 |
| 15.739700000000001 | 23.022 |
| 15.7436 | 23.028 |
| 15.747399999999999 | 23.035 |
| 15.751299999999999 | 23.041 |
| 15.7551 | 23.048 |
| 15.759 | 23.054 |
| 15.7629 | 23.061 |
| 15.7667 | 23.068 |
| 15.7706 | 23.075 |
| 15.7744 | 23.083 |
| 15.7783 | 23.09 |
| 15.782200000000001 | 23.097 |
| 15.786 | 23.105 |
| 15.7899 | 23.114 |
| 15.793700000000001 | 23.122 |
| 15.797600000000001 | 23.131 |
| 15.8015 | 23.14 |
| 15.805299999999999 | 23.149 |
| 15.8092 | 23.158 |
| 15.813 | 23.169 |
| 15.8169 | 23.18 |
| 15.820799999999998 | 23.192 |
| 15.8246 | 23.203 |
| 15.8285 | 23.215 |
| 15.8323 | 23.226 |
| 15.836200000000002 | 23.235 |
| 15.8401 | 23.243 |
| 15.8439 | 23.251 |
| 15.8478 | 23.259 |
| 15.851600000000001 | 23.267 |
| 15.8555 | 23.275 |
| 15.859399999999999 | 23.279 |
| 15.8632 | 23.278 |
| 15.8671 | 23.276 |
| 15.871 | 23.275 |
| 15.874799999999999 | 23.274 |
| 15.8787 | 23.272 |
| 15.8825 | 23.27 |
| 15.8864 | 23.264 |
| 15.8903 | 23.258 |
| 15.8941 | 23.251 |
| 15.898 | 23.245 |
| 15.9018 | 23.239 |
| 15.905700000000001 | 23.233 |
| 15.909600000000001 | 23.229 |
| 15.9134 | 23.226 |
| 15.9173 | 23.223 |
| 15.921100000000001 | 23.22 |
| 15.925 | 23.217 |
| 15.9289 | 23.214 |
| 15.9327 | 23.212 |
| 15.9366 | 23.212 |
| 15.9404 | 23.212 |
| 15.9443 | 23.213 |
| 15.9482 | 23.213 |
| 15.952 | 23.213 |
| 15.9559 | 23.214 |
| 15.959700000000002 | 23.215 |
| 15.9636 | 23.216 |
| 15.9675 | 23.217 |
| 15.9713 | 23.218 |
| 15.975200000000001 | 23.219 |
| 15.979 | 23.22 |
| 15.982899999999999 | 23.223 |
| 15.986799999999999 | 23.226 |
| 15.9906 | 23.229 |
| 15.9945 | 23.232 |
| 15.9984 | 23.235 |
| 16.002200000000002 | 23.238 |
| 16.0061 | 23.242 |
| 16.0099 | 23.245 |
| 16.0138 | 23.248 |
| 16.0177 | 23.252 |
| 16.0215 | 23.255 |
| 16.0254 | 23.258 |
| 16.0292 | 23.262 |
| 16.0331 | 23.261 |
| 16.037 | 23.261 |
| 16.0408 | 23.261 |
| 16.044700000000002 | 23.26 |
| 16.0485 | 23.26 |
| 16.0524 | 23.26 |
| 16.0563 | 23.258 |
| 16.060100000000002 | 23.254 |
| 16.064 | 23.25 |
| 16.0678 | 23.247 |
| 16.0717 | 23.243 |
| 16.0756 | 23.24 |
| 16.0794 | 23.236 |
| 16.083299999999998 | 23.233 |
| 16.0871 | 23.23 |
| 16.091 | 23.227 |
| 16.0949 | 23.224 |
| 16.0987 | 23.221 |
| 16.1026 | 23.219 |
| 16.1064 | 23.218 |
| 16.1103 | 23.218 |
| 16.1142 | 23.218 |
| 16.118 | 23.218 |
| 16.1219 | 23.218 |
| 16.125799999999998 | 23.219 |
| 16.1296 | 23.219 |
| 16.1335 | 23.222 |
| 16.1373 | 23.225 |
| 16.1412 | 23.227 |
| 16.1451 | 23.23 |
| 16.1489 | 23.232 |
| 16.1528 | 23.235 |
| 16.1566 | 23.238 |
| 16.1605 | 23.242 |
| 16.1644 | 23.245 |
| 16.168200000000002 | 23.248 |
| 16.1721 | 23.251 |
| 16.1759 | 23.254 |
| 16.1798 | 23.258 |
| 16.1837 | 23.262 |
| 16.1875 | 23.267 |
| 16.191399999999998 | 23.272 |
| 16.1952 | 23.277 |
| 16.1991 | 23.282 |
| 16.203 | 23.286 |
| 16.206799999999998 | 23.294 |
| 16.2107 | 23.304 |
| 16.2145 | 23.314 |
| 16.2184 | 23.325 |
| 16.2223 | 23.335 |
| 16.2261 | 23.345 |
| 16.23 | 23.355 |
| 16.2338 | 23.37 |
| 16.2377 | 23.386 |
| 16.241600000000002 | 23.401 |
| 16.2454 | 23.416 |
| 16.249299999999998 | 23.431 |
| 16.2532 | 23.446 |
| 16.257 | 23.461 |
| 16.2609 | 23.476 |
| 16.2647 | 23.491 |
| 16.2686 | 23.506 |
| 16.2725 | 23.52 |
| 16.2763 | 23.535 |
| 16.2802 | 23.55 |
| 16.284 | 23.561 |
| 16.2879 | 23.572 |
| 16.2918 | 23.582 |
| 16.2956 | 23.592 |
| 16.2995 | 23.603 |
| 16.3033 | 23.614 |
| 16.3072 | 23.624 |
| 16.3111 | 23.632 |
| 16.314899999999998 | 23.64 |
| 16.3188 | 23.648 |
| 16.3226 | 23.656 |
| 16.3265 | 23.664 |
| 16.3304 | 23.672 |
| 16.3342 | 23.681 |
| 16.3381 | 23.691 |
| 16.3419 | 23.7 |
| 16.3458 | 23.71 |
| 16.349700000000002 | 23.719 |
| 16.3535 | 23.729 |
| 16.3574 | 23.738 |
| 16.3612 | 23.75 |
| 16.3651 | 23.762 |
| 16.369 | 23.773 |
| 16.372799999999998 | 23.785 |
| 16.3767 | 23.797 |
| 16.3806 | 23.809 |
| 16.384400000000003 | 23.821 |
| 16.3883 | 23.834 |
| 16.3921 | 23.848 |
| 16.396 | 23.862 |
| 16.399900000000002 | 23.876 |
| 16.4037 | 23.89 |
| 16.4076 | 23.903 |
| 16.4114 | 23.919 |
| 16.4153 | 23.935 |
| 16.4192 | 23.952 |
| 16.423 | 23.969 |
| 16.4269 | 23.986 |
| 16.4307 | 24.003 |
| 16.4346 | 24.019 |
| 16.4385 | 24.036 |
| 16.4423 | 24.052 |
| 16.4462 | 24.069 |
| 16.45 | 24.085 |
| 16.4539 | 24.102 |
| 16.4578 | 24.118 |
| 16.461599999999997 | 24.134 |
| 16.4655 | 24.146 |
| 16.4693 | 24.156 |
| 16.473200000000002 | 24.167 |
| 16.4771 | 24.178 |
| 16.480900000000002 | 24.189 |
| 16.4848 | 24.2 |
| 16.488599999999998 | 24.21 |
| 16.4925 | 24.219 |
| 16.4964 | 24.227 |
| 16.5002 | 24.236 |
| 16.504099999999998 | 24.244 |
| 16.508 | 24.253 |
| 16.5118 | 24.261 |
| 16.515700000000002 | 24.271 |
| 16.5195 | 24.284 |
| 16.523400000000002 | 24.297 |
| 16.5273 | 24.31 |
| 16.5311 | 24.323 |
| 16.535 | 24.336 |
| 16.5388 | 24.348 |
| 16.5427 | 24.364 |
| 16.546599999999998 | 24.382 |
| 16.5504 | 24.399 |
| 16.554299999999998 | 24.416 |
| 16.5581 | 24.434 |
| 16.562 | 24.452 |
| 16.565900000000003 | 24.469 |
| 16.5697 | 24.487 |
| 16.5736 | 24.506 |
| 16.5774 | 24.524 |
| 16.5813 | 24.542 |
| 16.5852 | 24.561 |
| 16.589 | 24.579 |
| 16.5929 | 24.597 |
| 16.596700000000002 | 24.614 |
| 16.6006 | 24.629 |
| 16.6045 | 24.644 |
| 16.6083 | 24.66 |
| 16.6122 | 24.676 |
| 16.616 | 24.691 |
| 16.6199 | 24.707 |
| 16.6238 | 24.717 |
| 16.627599999999997 | 24.728 |
| 16.6315 | 24.738 |
| 16.6354 | 24.748 |
| 16.639200000000002 | 24.759 |
| 16.643099999999997 | 24.769 |
| 16.646900000000002 | 24.779 |
| 16.6508 | 24.784 |
| 16.654700000000002 | 24.789 |
| 16.6585 | 24.795 |
| 16.6624 | 24.8 |
| 16.6662 | 24.805 |
| 16.670099999999998 | 24.81 |
| 16.674 | 24.815 |
| 16.677799999999998 | 24.817 |
| 16.6817 | 24.82 |
| 16.6855 | 24.822 |
| 16.689400000000003 | 24.824 |
| 16.6933 | 24.826 |
| 16.6971 | 24.829 |
| 16.701 | 24.831 |
| 16.7048 | 24.832 |
| 16.7087 | 24.834 |
| 16.7126 | 24.836 |
| 16.7164 | 24.838 |
| 16.720299999999998 | 24.839 |
| 16.7241 | 24.841 |
| 16.728 | 24.843 |
| 16.731900000000003 | 24.846 |
| 16.7357 | 24.849 |
| 16.7396 | 24.852 |
| 16.7434 | 24.855 |
| 16.7473 | 24.858 |
| 16.7512 | 24.861 |
| 16.755 | 24.865 |
| 16.7589 | 24.87 |
| 16.7628 | 24.876 |
| 16.766599999999997 | 24.881 |
| 16.7705 | 24.887 |
| 16.7743 | 24.892 |
| 16.778200000000002 | 24.897 |
| 16.7821 | 24.903 |
| 16.7859 | 24.91 |
| 16.7898 | 24.917 |
| 16.793599999999998 | 24.924 |
| 16.7975 | 24.93 |
| 16.8014 | 24.937 |
| 16.8052 | 24.944 |
| 16.809099999999997 | 24.951 |
| 16.812900000000003 | 24.958 |
| 16.8168 | 24.964 |
| 16.820700000000002 | 24.971 |
| 16.8245 | 24.978 |
| 16.828400000000002 | 24.984 |
| 16.8322 | 24.991 |
| 16.8361 | 24.997 |
| 16.84 | 25.002 |
| 16.843799999999998 | 25.006 |
| 16.8477 | 25.011 |
| 16.8515 | 25.016 |
| 16.855400000000003 | 25.021 |
| 16.859299999999998 | 25.025 |
| 16.8631 | 25.03 |
| 16.867 | 25.029 |
| 16.8708 | 25.027 |
| 16.8747 | 25.026 |
| 16.8786 | 25.024 |
| 16.8824 | 25.023 |
| 16.8863 | 25.021 |
| 16.8902 | 25.02 |
| 16.894 | 25.011 |
| 16.8979 | 25 |
| 16.9017 | 24.99 |
| 16.9056 | 24.98 |
| 16.9095 | 24.969 |
| 16.9133 | 24.959 |
| 16.9172 | 24.949 |
| 16.921 | 24.938 |
| 16.9249 | 24.927 |
| 16.9288 | 24.916 |
| 16.932599999999997 | 24.905 |
| 16.9365 | 24.894 |
| 16.9403 | 24.883 |
| 16.944200000000002 | 24.872 |
| 16.9481 | 24.866 |
| 16.951900000000002 | 24.866 |
| 16.9558 | 24.865 |
| 16.9596 | 24.864 |
| 16.9635 | 24.863 |
| 16.9674 | 24.862 |
| 16.9712 | 24.861 |
| 16.975099999999998 | 24.864 |
| 16.978900000000003 | 24.873 |
| 16.9828 | 24.882 |
| 16.9867 | 24.891 |
| 16.9905 | 24.9 |
| 16.994400000000002 | 24.909 |
| 16.9982 | 24.918 |
| 17.0021 | 24.928 |
| 17.006 | 24.94 |
| 17.0098 | 24.951 |
| 17.0137 | 24.962 |
| 17.017599999999998 | 24.974 |
| 17.0214 | 24.985 |
| 17.025299999999998 | 24.997 |
| 17.0291 | 25.008 |
| 17.033 | 25.017 |
| 17.036900000000003 | 25.026 |
| 17.0407 | 25.035 |
| 17.0446 | 25.043 |
| 17.0484 | 25.052 |
| 17.0523 | 25.061 |
| 17.0562 | 25.069 |
| 17.06 | 25.075 |
| 17.0639 | 25.079 |
| 17.067700000000002 | 25.083 |
| 17.0716 | 25.087 |
| 17.0755 | 25.091 |
| 17.0793 | 25.094 |
| 17.0832 | 25.098 |
| 17.087 | 25.1 |
| 17.0909 | 25.098 |
| 17.0948 | 25.097 |
| 17.098599999999998 | 25.095 |
| 17.1025 | 25.093 |
| 17.1063 | 25.092 |
| 17.1102 | 25.09 |
| 17.114099999999997 | 25.088 |
| 17.117900000000002 | 25.083 |
| 17.1218 | 25.078 |
| 17.1256 | 25.073 |
| 17.1295 | 25.068 |
| 17.1334 | 25.064 |
| 17.1372 | 25.059 |
| 17.141099999999998 | 25.054 |
| 17.145 | 25.05 |
| 17.148799999999998 | 25.046 |
| 17.1527 | 25.043 |
| 17.1565 | 25.04 |
| 17.160400000000003 | 25.036 |
| 17.1643 | 25.032 |
| 17.1681 | 25.029 |
| 17.172 | 25.026 |
| 17.1758 | 25.024 |
| 17.1797 | 25.021 |
| 17.1836 | 25.018 |
| 17.1874 | 25.016 |
| 17.1913 | 25.013 |
| 17.1951 | 25.011 |
| 17.199 | 25.008 |
| 17.202900000000003 | 25.003 |
| 17.2067 | 24.998 |
| 17.2106 | 24.992 |
| 17.2144 | 24.987 |
| 17.2183 | 24.982 |
| 17.2222 | 24.977 |
| 17.226 | 24.971 |
| 17.2299 | 24.967 |
| 17.233700000000002 | 24.963 |
| 17.237599999999997 | 24.959 |
| 17.2415 | 24.955 |
| 17.2453 | 24.951 |
| 17.249200000000002 | 24.948 |
| 17.253 | 24.944 |
| 17.2569 | 24.941 |
| 17.2608 | 24.946 |
| 17.264599999999998 | 24.95 |
| 17.2685 | 24.954 |
| 17.2724 | 24.958 |
| 17.2762 | 24.962 |
| 17.280099999999997 | 24.966 |
| 17.283900000000003 | 24.971 |
| 17.2878 | 24.979 |
| 17.291700000000002 | 24.988 |
| 17.2955 | 24.997 |
| 17.299400000000002 | 25.006 |
| 17.3032 | 25.015 |
| 17.3071 | 25.025 |
| 17.311 | 25.034 |
| 17.314799999999998 | 25.042 |
| 17.3187 | 25.05 |
| 17.3225 | 25.058 |
| 17.326400000000003 | 25.066 |
| 17.330299999999998 | 25.074 |
| 17.3341 | 25.082 |
| 17.338 | 25.09 |
| 17.3418 | 25.098 |
| 17.3457 | 25.105 |
| 17.3496 | 25.113 |
| 17.3534 | 25.121 |
| 17.3573 | 25.128 |
| 17.361099999999997 | 25.136 |
| 17.365 | 25.143 |
| 17.3689 | 25.151 |
| 17.372700000000002 | 25.159 |
| 17.3766 | 25.168 |
| 17.3804 | 25.177 |
| 17.3843 | 25.186 |
| 17.3882 | 25.194 |
| 17.392 | 25.203 |
| 17.3959 | 25.212 |
| 17.3997 | 25.221 |
| 17.403599999999997 | 25.228 |
| 17.4075 | 25.234 |
| 17.4113 | 25.241 |
| 17.415200000000002 | 25.247 |
| 17.4191 | 25.253 |
| 17.422900000000002 | 25.259 |
| 17.4268 | 25.266 |
| 17.4306 | 25.271 |
| 17.4345 | 25.274 |
| 17.4384 | 25.276 |
| 17.4422 | 25.278 |
| 17.446099999999998 | 25.281 |
| 17.449900000000003 | 25.283 |
| 17.453799999999998 | 25.286 |
| 17.4577 | 25.288 |
| 17.4615 | 25.29 |
| 17.465400000000002 | 25.291 |
| 17.4692 | 25.293 |
| 17.4731 | 25.294 |
| 17.477 | 25.296 |
| 17.4808 | 25.297 |
| 17.4847 | 25.299 |
| 17.4885 | 25.3 |
| 17.4924 | 25.301 |
| 17.496299999999998 | 25.302 |
| 17.5001 | 25.303 |
| 17.504 | 25.304 |
| 17.5078 | 25.305 |
| 17.5117 | 25.306 |
| 17.5156 | 25.307 |
| 17.5194 | 25.307 |
| 17.5233 | 25.307 |
| 17.527099999999997 | 25.307 |
| 17.531 | 25.306 |
| 17.5349 | 25.306 |
| 17.538700000000002 | 25.306 |
| 17.5426 | 25.306 |
| 17.5465 | 25.305 |
| 17.5503 | 25.307 |
| 17.5542 | 25.31 |
| 17.558 | 25.313 |
| 17.5619 | 25.316 |
| 17.5658 | 25.319 |
| 17.569599999999998 | 25.322 |
| 17.5735 | 25.326 |
| 17.5773 | 25.329 |
| 17.5812 | 25.339 |
| 17.585099999999997 | 25.35 |
| 17.588900000000002 | 25.361 |
| 17.5928 | 25.372 |
| 17.5966 | 25.383 |
| 17.6005 | 25.394 |
| 17.604400000000002 | 25.406 |
| 17.6082 | 25.417 |
| 17.612099999999998 | 25.433 |
| 17.6159 | 25.448 |
| 17.619799999999998 | 25.464 |
| 17.6237 | 25.48 |
| 17.6275 | 25.495 |
| 17.631400000000003 | 25.511 |
| 17.6352 | 25.526 |
| 17.6391 | 25.54 |
| 17.643 | 25.553 |
| 17.6468 | 25.565 |
| 17.6507 | 25.578 |
| 17.6545 | 25.59 |
| 17.6584 | 25.602 |
| 17.6623 | 25.615 |
| 17.6661 | 25.627 |
| 17.67 | 25.637 |
| 17.6739 | 25.645 |
| 17.6777 | 25.654 |
| 17.6816 | 25.662 |
| 17.6854 | 25.67 |
| 17.6893 | 25.679 |
| 17.6932 | 25.687 |
| 17.697 | 25.696 |
| 17.7009 | 25.705 |
| 17.7047 | 25.715 |
| 17.708599999999997 | 25.724 |
| 17.7125 | 25.734 |
| 17.7163 | 25.744 |
| 17.720200000000002 | 25.753 |
| 17.724 | 25.763 |
| 17.7279 | 25.772 |
| 17.7318 | 25.784 |
| 17.735599999999998 | 25.796 |
| 17.7395 | 25.808 |
| 17.743299999999998 | 25.82 |
| 17.7472 | 25.832 |
| 17.751099999999997 | 25.843 |
| 17.754900000000003 | 25.855 |
| 17.7588 | 25.867 |
| 17.7626 | 25.875 |
| 17.7665 | 25.884 |
| 17.770400000000002 | 25.892 |
| 17.7742 | 25.9 |
| 17.7781 | 25.908 |
| 17.7819 | 25.917 |
| 17.7858 | 25.925 |
| 17.7897 | 25.932 |
| 17.7935 | 25.934 |
| 17.797400000000003 | 25.936 |
| 17.801299999999998 | 25.938 |
| 17.8051 | 25.94 |
| 17.809 | 25.942 |
| 17.8128 | 25.944 |
| 17.8167 | 25.946 |
| 17.8206 | 25.947 |
| 17.8244 | 25.947 |
| 17.8283 | 25.947 |
| 17.832099999999997 | 25.947 |
| 17.836 | 25.947 |
| 17.8399 | 25.947 |
| 17.843700000000002 | 25.948 |
| 17.8476 | 25.948 |
| 17.8514 | 25.948 |
| 17.8553 | 25.951 |
| 17.8592 | 25.953 |
| 17.863 | 25.955 |
| 17.8669 | 25.958 |
| 17.8707 | 25.96 |
| 17.874599999999997 | 25.962 |
| 17.8785 | 25.965 |
| 17.8823 | 25.967 |
| 17.886200000000002 | 25.969 |
| 17.89 | 25.971 |
| 17.893900000000002 | 25.973 |
| 17.8978 | 25.975 |
| 17.9016 | 25.977 |
| 17.9055 | 25.98 |
| 17.909299999999998 | 25.982 |
| 17.9132 | 25.983 |
| 17.917099999999998 | 25.984 |
| 17.920900000000003 | 25.985 |
| 17.924799999999998 | 25.986 |
| 17.9287 | 25.986 |
| 17.9325 | 25.987 |
| 17.936400000000003 | 25.988 |
| 17.9402 | 25.989 |
| 17.9441 | 25.991 |
| 17.948 | 25.995 |
| 17.9518 | 25.999 |
| 17.9557 | 26.003 |
| 17.9595 | 26.007 |
| 17.9634 | 26.011 |
| 17.967299999999998 | 26.015 |
| 17.9711 | 26.019 |
| 17.975 | 26.025 |
| 17.9788 | 26.035 |
| 17.9827 | 26.045 |
| 17.9866 | 26.055 |
| 17.9904 | 26.065 |
| 17.9943 | 26.075 |
| 17.998099999999997 | 26.085 |
| 18.002 | 26.094 |
| 18.0059 | 26.105 |
| 18.009700000000002 | 26.117 |
| 18.0136 | 26.129 |
| 18.017400000000002 | 26.142 |
| 18.0213 | 26.154 |
| 18.0252 | 26.166 |
| 18.029 | 26.178 |
| 18.0329 | 26.19 |
| 18.0367 | 26.202 |
| 18.040599999999998 | 26.212 |
| 18.0445 | 26.221 |
| 18.048299999999998 | 26.23 |
| 18.0522 | 26.24 |
| 18.056099999999997 | 26.249 |
| 18.059900000000003 | 26.259 |
| 18.0638 | 26.268 |
| 18.0676 | 26.277 |
| 18.0715 | 26.283 |
| 18.075400000000002 | 26.288 |
| 18.0792 | 26.293 |
| 18.083099999999998 | 26.298 |
| 18.0869 | 26.304 |
| 18.090799999999998 | 26.309 |
| 18.0947 | 26.314 |
| 18.0985 | 26.319 |
| 18.102400000000003 | 26.323 |
| 18.1062 | 26.326 |
| 18.1101 | 26.329 |
| 18.114 | 26.332 |
| 18.1178 | 26.335 |
| 18.1217 | 26.338 |
| 18.1255 | 26.341 |
| 18.1294 | 26.344 |
| 18.1333 | 26.347 |
| 18.1371 | 26.35 |
| 18.141 | 26.354 |
| 18.1448 | 26.357 |
| 18.1487 | 26.361 |
| 18.1526 | 26.364 |
| 18.1564 | 26.368 |
| 18.1603 | 26.371 |
| 18.164099999999998 | 26.375 |
| 18.168 | 26.38 |
| 18.1719 | 26.386 |
| 18.1757 | 26.391 |
| 18.179599999999997 | 26.396 |
| 18.1835 | 26.401 |
| 18.1873 | 26.407 |
| 18.191200000000002 | 26.412 |
| 18.195 | 26.417 |
| 18.198900000000002 | 26.424 |
| 18.2028 | 26.43 |
| 18.206599999999998 | 26.437 |
| 18.2105 | 26.444 |
| 18.214299999999998 | 26.45 |
| 18.2182 | 26.457 |
| 18.222099999999998 | 26.464 |
| 18.225900000000003 | 26.47 |
| 18.2298 | 26.476 |
| 18.2336 | 26.481 |
| 18.2375 | 26.486 |
| 18.241400000000002 | 26.491 |
| 18.2452 | 26.496 |
| 18.2491 | 26.502 |
| 18.2529 | 26.507 |
| 18.2568 | 26.512 |
| 18.2607 | 26.515 |
| 18.2645 | 26.517 |
| 18.2684 | 26.518 |
| 18.2722 | 26.519 |
| 18.2761 | 26.521 |
| 18.28 | 26.522 |
| 18.2838 | 26.523 |
| 18.2877 | 26.524 |
| 18.2915 | 26.525 |
| 18.2954 | 26.524 |
| 18.2993 | 26.523 |
| 18.303099999999997 | 26.522 |
| 18.307 | 26.521 |
| 18.3109 | 26.52 |
| 18.314700000000002 | 26.518 |
| 18.3186 | 26.517 |
| 18.322400000000002 | 26.516 |
| 18.3263 | 26.516 |
| 18.3302 | 26.517 |
| 18.334 | 26.518 |
| 18.3379 | 26.518 |
| 18.3417 | 26.519 |
| 18.345599999999997 | 26.52 |
| 18.3495 | 26.52 |
| 18.3533 | 26.521 |
| 18.357200000000002 | 26.523 |
| 18.361 | 26.527 |
| 18.364900000000002 | 26.531 |
| 18.3688 | 26.535 |
| 18.3726 | 26.539 |
| 18.3765 | 26.543 |
| 18.3803 | 26.547 |
| 18.3842 | 26.551 |
| 18.388099999999998 | 26.555 |
| 18.3919 | 26.561 |
| 18.395799999999998 | 26.566 |
| 18.3996 | 26.572 |
| 18.4035 | 26.578 |
| 18.407400000000003 | 26.583 |
| 18.4112 | 26.589 |
| 18.4151 | 26.595 |
| 18.4189 | 26.6 |
| 18.4228 | 26.606 |
| 18.4267 | 26.612 |
| 18.4305 | 26.618 |
| 18.4344 | 26.624 |
| 18.438299999999998 | 26.63 |
| 18.4421 | 26.636 |
| 18.446 | 26.641 |
| 18.4498 | 26.647 |
| 18.4537 | 26.653 |
| 18.4576 | 26.66 |
| 18.4614 | 26.666 |
| 18.4653 | 26.672 |
| 18.469099999999997 | 26.679 |
| 18.473 | 26.685 |
| 18.4769 | 26.692 |
| 18.480700000000002 | 26.698 |
| 18.484599999999997 | 26.705 |
| 18.488400000000002 | 26.711 |
| 18.4923 | 26.718 |
| 18.4962 | 26.725 |
| 18.5 | 26.732 |
| 18.5039 | 26.739 |
| 18.5077 | 26.746 |
| 18.511599999999998 | 26.752 |
| 18.5155 | 26.759 |
| 18.519299999999998 | 26.766 |
| 18.5232 | 26.771 |
| 18.527 | 26.776 |
| 18.530900000000003 | 26.78 |
| 18.5348 | 26.785 |
| 18.5386 | 26.79 |
| 18.5425 | 26.795 |
| 18.5463 | 26.799 |
| 18.5502 | 26.804 |
| 18.5541 | 26.807 |
| 18.5579 | 26.808 |
| 18.561799999999998 | 26.809 |
| 18.5657 | 26.81 |
| 18.5695 | 26.81 |
| 18.573400000000003 | 26.811 |
| 18.5772 | 26.812 |
| 18.5811 | 26.813 |
| 18.585 | 26.814 |
| 18.5888 | 26.813 |
| 18.5927 | 26.812 |
| 18.5965 | 26.811 |
| 18.6004 | 26.81 |
| 18.6043 | 26.809 |
| 18.6081 | 26.808 |
| 18.612 | 26.806 |
| 18.6158 | 26.806 |
| 18.6197 | 26.805 |
| 18.6236 | 26.805 |
| 18.6274 | 26.805 |
| 18.6313 | 26.806 |
| 18.635099999999998 | 26.806 |
| 18.639 | 26.806 |
| 18.6429 | 26.807 |
| 18.6467 | 26.807 |
| 18.650599999999997 | 26.808 |
| 18.654400000000003 | 26.809 |
| 18.6583 | 26.811 |
| 18.662200000000002 | 26.814 |
| 18.666 | 26.816 |
| 18.669900000000002 | 26.819 |
| 18.6737 | 26.821 |
| 18.677599999999998 | 26.824 |
| 18.6815 | 26.826 |
| 18.685299999999998 | 26.829 |
| 18.6892 | 26.831 |
| 18.693099999999998 | 26.834 |
| 18.696900000000003 | 26.836 |
| 18.7008 | 26.839 |
| 18.7046 | 26.841 |
| 18.7085 | 26.844 |
| 18.712400000000002 | 26.846 |
| 18.7162 | 26.849 |
| 18.7201 | 26.851 |
| 18.7239 | 26.854 |
| 18.7278 | 26.857 |
| 18.7317 | 26.86 |
| 18.7355 | 26.863 |
| 18.7394 | 26.866 |
| 18.7432 | 26.869 |
| 18.7471 | 26.872 |
| 18.751 | 26.875 |
| 18.7548 | 26.879 |
| 18.7587 | 26.886 |
| 18.7625 | 26.892 |
| 18.7664 | 26.899 |
| 18.7703 | 26.906 |
| 18.774099999999997 | 26.912 |
| 18.778 | 26.919 |
| 18.7818 | 26.925 |
| 18.785700000000002 | 26.932 |
| 18.7896 | 26.938 |
| 18.793400000000002 | 26.945 |
| 18.7973 | 26.951 |
| 18.801099999999998 | 26.958 |
| 18.805 | 26.964 |
| 18.8089 | 26.971 |
| 18.8127 | 26.978 |
| 18.816599999999998 | 26.984 |
| 18.8205 | 26.991 |
| 18.8243 | 26.994 |
| 18.828200000000002 | 26.994 |
| 18.832 | 26.994 |
| 18.835900000000002 | 26.995 |
| 18.8398 | 26.995 |
| 18.8436 | 26.996 |
| 18.8475 | 26.996 |
| 18.8513 | 26.997 |
| 18.8552 | 26.997 |
| 18.859099999999998 | 26.996 |
| 18.8629 | 26.995 |
| 18.866799999999998 | 26.994 |
| 18.8706 | 26.993 |
| 18.8745 | 26.992 |
| 18.878400000000003 | 26.991 |
| 18.8822 | 26.99 |
| 18.8861 | 26.989 |
| 18.8899 | 26.988 |
| 18.8938 | 26.991 |
| 18.8977 | 26.994 |
| 18.9015 | 26.998 |
| 18.9054 | 27.002 |
| 18.909200000000002 | 27.005 |
| 18.9131 | 27.009 |
| 18.917 | 27.012 |
| 18.9208 | 27.016 |
| 18.9247 | 27.02 |
| 18.9285 | 27.024 |
| 18.9324 | 27.029 |
| 18.9363 | 27.034 |
| 18.940099999999997 | 27.039 |
| 18.944 | 27.044 |
| 18.9479 | 27.049 |
| 18.951700000000002 | 27.054 |
| 18.955599999999997 | 27.058 |
| 18.959400000000002 | 27.063 |
| 18.9633 | 27.067 |
| 18.967200000000002 | 27.07 |
| 18.971 | 27.074 |
| 18.9749 | 27.078 |
| 18.9787 | 27.081 |
| 18.982599999999998 | 27.085 |
| 18.9865 | 27.089 |
| 18.990299999999998 | 27.092 |
| 18.9942 | 27.096 |
| 18.998 | 27.102 |
| 19.001900000000003 | 27.108 |
| 19.0058 | 27.115 |
| 19.0096 | 27.121 |
| 19.0135 | 27.128 |
| 19.0173 | 27.134 |
| 19.0212 | 27.14 |
| 19.0251 | 27.146 |
| 19.0289 | 27.153 |
| 19.032799999999998 | 27.162 |
| 19.0366 | 27.172 |
| 19.0405 | 27.182 |
| 19.044400000000003 | 27.191 |
| 19.0482 | 27.201 |
| 19.0521 | 27.21 |
| 19.0559 | 27.22 |
| 19.0598 | 27.23 |
| 19.0637 | 27.239 |
| 19.0675 | 27.247 |
| 19.0714 | 27.255 |
| 19.0753 | 27.263 |
| 19.079099999999997 | 27.27 |
| 19.083 | 27.278 |
| 19.0868 | 27.286 |
| 19.090700000000002 | 27.294 |
| 19.0946 | 27.301 |
| 19.0984 | 27.309 |
| 19.1023 | 27.312 |
| 19.106099999999998 | 27.314 |
| 19.11 | 27.316 |
| 19.1139 | 27.318 |
| 19.1177 | 27.321 |
| 19.121599999999997 | 27.323 |
| 19.125400000000003 | 27.325 |
| 19.1293 | 27.327 |
| 19.133200000000002 | 27.329 |
| 19.137 | 27.33 |
| 19.140900000000002 | 27.33 |
| 19.1447 | 27.331 |
| 19.1486 | 27.331 |
| 19.1525 | 27.332 |
| 19.156299999999998 | 27.332 |
| 19.1602 | 27.332 |
| 19.164 | 27.333 |
| 19.167900000000003 | 27.333 |
| 19.171799999999998 | 27.336 |
| 19.1756 | 27.343 |
| 19.1795 | 27.35 |
| 19.1833 | 27.356 |
| 19.1872 | 27.363 |
| 19.1911 | 27.37 |
| 19.1949 | 27.376 |
| 19.1988 | 27.383 |
| 19.2027 | 27.389 |
| 19.2065 | 27.397 |
| 19.2104 | 27.408 |
| 19.2142 | 27.42 |
| 19.2181 | 27.431 |
| 19.222 | 27.443 |
| 19.2258 | 27.454 |
| 19.2297 | 27.465 |
| 19.2335 | 27.477 |
| 19.2374 | 27.488 |
| 19.2413 | 27.499 |
| 19.245099999999997 | 27.503 |
| 19.249 | 27.506 |
| 19.2528 | 27.51 |
| 19.256700000000002 | 27.514 |
| 19.2606 | 27.518 |
| 19.264400000000002 | 27.522 |
| 19.2683 | 27.525 |
| 19.2721 | 27.529 |
| 19.276 | 27.533 |
| 19.2799 | 27.527 |
| 19.2837 | 27.518 |
| 19.287599999999998 | 27.51 |
| 19.291400000000003 | 27.501 |
| 19.2953 | 27.493 |
| 19.2992 | 27.484 |
| 19.303 | 27.476 |
| 19.306900000000002 | 27.467 |
| 19.3107 | 27.458 |
| 19.3146 | 27.449 |
| 19.3185 | 27.44 |
| 19.3223 | 27.43 |
| 19.3262 | 27.421 |
| 19.330099999999998 | 27.411 |
| 19.3339 | 27.402 |
| 19.337799999999998 | 27.392 |
| 19.3416 | 27.383 |
| 19.3455 | 27.373 |
| 19.349400000000003 | 27.366 |
| 19.3532 | 27.367 |
| 19.3571 | 27.368 |
| 19.3609 | 27.369 |
| 19.3648 | 27.37 |
| 19.3687 | 27.371 |
| 19.3725 | 27.372 |
| 19.3764 | 27.373 |
| 19.380200000000002 | 27.375 |
| 19.3841 | 27.376 |
| 19.388 | 27.384 |
| 19.3918 | 27.394 |
| 19.3957 | 27.405 |
| 19.3995 | 27.416 |
| 19.4034 | 27.426 |
| 19.4073 | 27.436 |
| 19.411099999999998 | 27.447 |
| 19.415 | 27.457 |
| 19.4188 | 27.468 |
| 19.4227 | 27.478 |
| 19.426599999999997 | 27.487 |
| 19.430400000000002 | 27.497 |
| 19.4343 | 27.506 |
| 19.4381 | 27.516 |
| 19.442 | 27.525 |
| 19.4459 | 27.535 |
| 19.4497 | 27.544 |
| 19.453599999999998 | 27.554 |
| 19.4575 | 27.563 |
| 19.461299999999998 | 27.565 |
| 19.4652 | 27.566 |
| 19.469 | 27.568 |
| 19.472900000000003 | 27.569 |
| 19.4768 | 27.57 |
| 19.4806 | 27.572 |
| 19.4845 | 27.573 |
| 19.4883 | 27.575 |
| 19.4922 | 27.576 |
| 19.4961 | 27.575 |
| 19.4999 | 27.572 |
| 19.5038 | 27.569 |
| 19.5076 | 27.566 |
| 19.5115 | 27.563 |
| 19.515400000000003 | 27.56 |
| 19.5192 | 27.557 |
| 19.5231 | 27.554 |
| 19.5269 | 27.55 |
| 19.5308 | 27.547 |
| 19.5347 | 27.549 |
| 19.5385 | 27.551 |
| 19.5424 | 27.552 |
| 19.546200000000002 | 27.554 |
| 19.550099999999997 | 27.556 |
| 19.554 | 27.558 |
| 19.5578 | 27.559 |
| 19.561700000000002 | 27.561 |
| 19.5655 | 27.563 |
| 19.5694 | 27.568 |
| 19.5733 | 27.577 |
| 19.577099999999998 | 27.587 |
| 19.581 | 27.596 |
| 19.5849 | 27.606 |
| 19.5887 | 27.615 |
| 19.592599999999997 | 27.625 |
| 19.596400000000003 | 27.634 |
| 19.6003 | 27.644 |
| 19.604200000000002 | 27.653 |
| 19.608 | 27.664 |
| 19.611900000000002 | 27.676 |
| 19.6157 | 27.688 |
| 19.6196 | 27.699 |
| 19.6235 | 27.711 |
| 19.627299999999998 | 27.723 |
| 19.6312 | 27.734 |
| 19.635 | 27.746 |
| 19.638900000000003 | 27.758 |
| 19.642799999999998 | 27.769 |
| 19.6466 | 27.777 |
| 19.6505 | 27.786 |
| 19.6543 | 27.794 |
| 19.6582 | 27.803 |
| 19.6621 | 27.811 |
| 19.6659 | 27.82 |
| 19.6698 | 27.828 |
| 19.673599999999997 | 27.837 |
| 19.6775 | 27.845 |
| 19.6814 | 27.85 |
| 19.685200000000002 | 27.852 |
| 19.6891 | 27.855 |
| 19.6929 | 27.857 |
| 19.6968 | 27.86 |
| 19.7007 | 27.862 |
| 19.7045 | 27.865 |
| 19.7084 | 27.867 |
| 19.7123 | 27.869 |
| 19.716099999999997 | 27.872 |
| 19.72 | 27.868 |
| 19.7238 | 27.865 |
| 19.727700000000002 | 27.861 |
| 19.7316 | 27.857 |
| 19.735400000000002 | 27.853 |
| 19.7393 | 27.849 |
| 19.7431 | 27.845 |
| 19.747 | 27.841 |
| 19.7509 | 27.837 |
| 19.7547 | 27.833 |
| 19.758599999999998 | 27.829 |
| 19.762400000000003 | 27.826 |
| 19.766299999999998 | 27.822 |
| 19.7702 | 27.819 |
| 19.774 | 27.815 |
| 19.777900000000002 | 27.812 |
| 19.7817 | 27.808 |
| 19.7856 | 27.805 |
| 19.7895 | 27.801 |
| 19.7933 | 27.801 |
| 19.7972 | 27.807 |
| 19.801 | 27.812 |
| 19.8049 | 27.817 |
| 19.808799999999998 | 27.823 |
| 19.8126 | 27.828 |
| 19.8165 | 27.834 |
| 19.8203 | 27.839 |
| 19.8242 | 27.844 |
| 19.8281 | 27.85 |
| 19.8319 | 27.86 |
| 19.8358 | 27.874 |
| 19.8397 | 27.889 |
| 19.8435 | 27.903 |
| 19.8474 | 27.917 |
| 19.851200000000002 | 27.932 |
| 19.8551 | 27.946 |
| 19.859 | 27.96 |
| 19.8628 | 27.974 |
| 19.8667 | 27.989 |
| 19.8705 | 28.006 |
| 19.8744 | 28.025 |
| 19.8783 | 28.044 |
| 19.882099999999998 | 28.063 |
| 19.886 | 28.081 |
| 19.8898 | 28.1 |
| 19.8937 | 28.119 |
| 19.897599999999997 | 28.138 |
| 19.901400000000002 | 28.156 |
| 19.9053 | 28.175 |
| 19.9091 | 28.195 |
| 19.913 | 28.215 |
| 19.916900000000002 | 28.235 |
| 19.9207 | 28.255 |
| 19.924599999999998 | 28.275 |
| 19.9284 | 28.295 |
| 19.932299999999998 | 28.314 |
| 19.9362 | 28.334 |
| 19.94 | 28.354 |
| 19.943900000000003 | 28.374 |
| 19.9477 | 28.394 |
| 19.9516 | 28.413 |
| 19.9555 | 28.433 |
| 19.9593 | 28.452 |
| 19.9632 | 28.472 |
| 19.9671 | 28.492 |
| 19.9709 | 28.511 |
| 19.9748 | 28.53 |
| 19.9786 | 28.55 |
| 19.9825 | 28.569 |
| 19.9864 | 28.587 |
| 19.9902 | 28.605 |
| 19.9941 | 28.623 |
| 19.9979 | 28.641 |
| 20.0018 | 28.658 |
| 20.0057 | 28.676 |